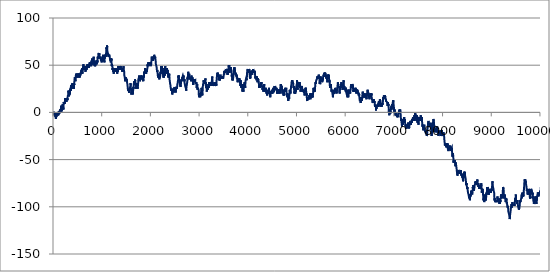
| Category | Series 0 |
|---|---|
| 0.0 | 1 |
| 1.0 | 0 |
| 2.0 | -1 |
| 3.0 | 0 |
| 4.0 | -1 |
| 5.0 | -2 |
| 6.0 | -1 |
| 7.0 | -2 |
| 8.0 | -3 |
| 9.0 | -2 |
| 10.0 | -3 |
| 11.0 | -2 |
| 12.0 | -1 |
| 13.0 | -2 |
| 14.0 | -3 |
| 15.0 | -4 |
| 16.0 | -3 |
| 17.0 | -2 |
| 18.0 | -3 |
| 19.0 | -2 |
| 20.0 | -1 |
| 21.0 | -2 |
| 22.0 | -3 |
| 23.0 | -2 |
| 24.0 | -3 |
| 25.0 | -2 |
| 26.0 | -1 |
| 27.0 | -2 |
| 28.0 | -1 |
| 29.0 | -2 |
| 30.0 | -3 |
| 31.0 | -4 |
| 32.0 | -5 |
| 33.0 | -4 |
| 34.0 | -3 |
| 35.0 | -4 |
| 36.0 | -5 |
| 37.0 | -6 |
| 38.0 | -7 |
| 39.0 | -6 |
| 40.0 | -5 |
| 41.0 | -4 |
| 42.0 | -3 |
| 43.0 | -2 |
| 44.0 | -3 |
| 45.0 | -4 |
| 46.0 | -5 |
| 47.0 | -6 |
| 48.0 | -5 |
| 49.0 | -4 |
| 50.0 | -5 |
| 51.0 | -4 |
| 52.0 | -3 |
| 53.0 | -4 |
| 54.0 | -3 |
| 55.0 | -4 |
| 56.0 | -3 |
| 57.0 | -4 |
| 58.0 | -3 |
| 59.0 | -2 |
| 60.0 | -1 |
| 61.0 | -2 |
| 62.0 | -1 |
| 63.0 | -2 |
| 64.0 | -3 |
| 65.0 | -4 |
| 66.0 | -3 |
| 67.0 | -4 |
| 68.0 | -3 |
| 69.0 | -2 |
| 70.0 | -1 |
| 71.0 | -2 |
| 72.0 | -1 |
| 73.0 | 0 |
| 74.0 | -1 |
| 75.0 | 0 |
| 76.0 | -1 |
| 77.0 | -2 |
| 78.0 | -1 |
| 79.0 | 0 |
| 80.0 | -1 |
| 81.0 | -2 |
| 82.0 | -3 |
| 83.0 | -2 |
| 84.0 | -1 |
| 85.0 | -2 |
| 86.0 | -1 |
| 87.0 | -2 |
| 88.0 | -3 |
| 89.0 | -4 |
| 90.0 | -3 |
| 91.0 | -4 |
| 92.0 | -3 |
| 93.0 | -2 |
| 94.0 | -1 |
| 95.0 | 0 |
| 96.0 | -1 |
| 97.0 | 0 |
| 98.0 | 1 |
| 99.0 | 0 |
| 100.0 | -1 |
| 101.0 | 0 |
| 102.0 | -1 |
| 103.0 | -2 |
| 104.0 | -1 |
| 105.0 | 0 |
| 106.0 | -1 |
| 107.0 | 0 |
| 108.0 | 1 |
| 109.0 | 0 |
| 110.0 | -1 |
| 111.0 | 0 |
| 112.0 | -1 |
| 113.0 | -2 |
| 114.0 | -1 |
| 115.0 | 0 |
| 116.0 | 1 |
| 117.0 | 2 |
| 118.0 | 1 |
| 119.0 | 0 |
| 120.0 | 1 |
| 121.0 | 2 |
| 122.0 | 3 |
| 123.0 | 2 |
| 124.0 | 3 |
| 125.0 | 2 |
| 126.0 | 1 |
| 127.0 | 0 |
| 128.0 | 1 |
| 129.0 | 2 |
| 130.0 | 1 |
| 131.0 | 2 |
| 132.0 | 3 |
| 133.0 | 4 |
| 134.0 | 3 |
| 135.0 | 4 |
| 136.0 | 3 |
| 137.0 | 2 |
| 138.0 | 1 |
| 139.0 | 2 |
| 140.0 | 3 |
| 141.0 | 4 |
| 142.0 | 5 |
| 143.0 | 6 |
| 144.0 | 7 |
| 145.0 | 6 |
| 146.0 | 5 |
| 147.0 | 6 |
| 148.0 | 5 |
| 149.0 | 4 |
| 150.0 | 3 |
| 151.0 | 2 |
| 152.0 | 3 |
| 153.0 | 4 |
| 154.0 | 3 |
| 155.0 | 2 |
| 156.0 | 1 |
| 157.0 | 2 |
| 158.0 | 3 |
| 159.0 | 4 |
| 160.0 | 5 |
| 161.0 | 6 |
| 162.0 | 7 |
| 163.0 | 6 |
| 164.0 | 7 |
| 165.0 | 6 |
| 166.0 | 5 |
| 167.0 | 4 |
| 168.0 | 3 |
| 169.0 | 4 |
| 170.0 | 3 |
| 171.0 | 4 |
| 172.0 | 5 |
| 173.0 | 6 |
| 174.0 | 5 |
| 175.0 | 6 |
| 176.0 | 7 |
| 177.0 | 8 |
| 178.0 | 9 |
| 179.0 | 10 |
| 180.0 | 9 |
| 181.0 | 8 |
| 182.0 | 7 |
| 183.0 | 8 |
| 184.0 | 7 |
| 185.0 | 6 |
| 186.0 | 7 |
| 187.0 | 8 |
| 188.0 | 7 |
| 189.0 | 6 |
| 190.0 | 5 |
| 191.0 | 4 |
| 192.0 | 3 |
| 193.0 | 4 |
| 194.0 | 5 |
| 195.0 | 6 |
| 196.0 | 7 |
| 197.0 | 8 |
| 198.0 | 9 |
| 199.0 | 10 |
| 200.0 | 11 |
| 201.0 | 10 |
| 202.0 | 11 |
| 203.0 | 10 |
| 204.0 | 9 |
| 205.0 | 8 |
| 206.0 | 9 |
| 207.0 | 10 |
| 208.0 | 9 |
| 209.0 | 8 |
| 210.0 | 9 |
| 211.0 | 8 |
| 212.0 | 9 |
| 213.0 | 8 |
| 214.0 | 9 |
| 215.0 | 10 |
| 216.0 | 11 |
| 217.0 | 10 |
| 218.0 | 9 |
| 219.0 | 10 |
| 220.0 | 9 |
| 221.0 | 10 |
| 222.0 | 9 |
| 223.0 | 10 |
| 224.0 | 11 |
| 225.0 | 12 |
| 226.0 | 11 |
| 227.0 | 12 |
| 228.0 | 13 |
| 229.0 | 14 |
| 230.0 | 15 |
| 231.0 | 14 |
| 232.0 | 13 |
| 233.0 | 14 |
| 234.0 | 13 |
| 235.0 | 14 |
| 236.0 | 13 |
| 237.0 | 14 |
| 238.0 | 15 |
| 239.0 | 14 |
| 240.0 | 13 |
| 241.0 | 14 |
| 242.0 | 15 |
| 243.0 | 14 |
| 244.0 | 15 |
| 245.0 | 14 |
| 246.0 | 13 |
| 247.0 | 14 |
| 248.0 | 13 |
| 249.0 | 14 |
| 250.0 | 13 |
| 251.0 | 12 |
| 252.0 | 13 |
| 253.0 | 12 |
| 254.0 | 11 |
| 255.0 | 12 |
| 256.0 | 13 |
| 257.0 | 14 |
| 258.0 | 15 |
| 259.0 | 14 |
| 260.0 | 13 |
| 261.0 | 14 |
| 262.0 | 15 |
| 263.0 | 14 |
| 264.0 | 13 |
| 265.0 | 12 |
| 266.0 | 13 |
| 267.0 | 12 |
| 268.0 | 13 |
| 269.0 | 14 |
| 270.0 | 15 |
| 271.0 | 14 |
| 272.0 | 15 |
| 273.0 | 14 |
| 274.0 | 15 |
| 275.0 | 14 |
| 276.0 | 13 |
| 277.0 | 14 |
| 278.0 | 15 |
| 279.0 | 16 |
| 280.0 | 17 |
| 281.0 | 18 |
| 282.0 | 17 |
| 283.0 | 16 |
| 284.0 | 17 |
| 285.0 | 16 |
| 286.0 | 17 |
| 287.0 | 16 |
| 288.0 | 17 |
| 289.0 | 16 |
| 290.0 | 17 |
| 291.0 | 18 |
| 292.0 | 19 |
| 293.0 | 18 |
| 294.0 | 19 |
| 295.0 | 20 |
| 296.0 | 21 |
| 297.0 | 22 |
| 298.0 | 23 |
| 299.0 | 22 |
| 300.0 | 21 |
| 301.0 | 22 |
| 302.0 | 23 |
| 303.0 | 22 |
| 304.0 | 21 |
| 305.0 | 20 |
| 306.0 | 19 |
| 307.0 | 18 |
| 308.0 | 17 |
| 309.0 | 16 |
| 310.0 | 17 |
| 311.0 | 18 |
| 312.0 | 19 |
| 313.0 | 18 |
| 314.0 | 19 |
| 315.0 | 20 |
| 316.0 | 19 |
| 317.0 | 20 |
| 318.0 | 21 |
| 319.0 | 20 |
| 320.0 | 21 |
| 321.0 | 20 |
| 322.0 | 21 |
| 323.0 | 20 |
| 324.0 | 19 |
| 325.0 | 20 |
| 326.0 | 21 |
| 327.0 | 22 |
| 328.0 | 23 |
| 329.0 | 24 |
| 330.0 | 25 |
| 331.0 | 24 |
| 332.0 | 25 |
| 333.0 | 24 |
| 334.0 | 25 |
| 335.0 | 24 |
| 336.0 | 23 |
| 337.0 | 24 |
| 338.0 | 25 |
| 339.0 | 26 |
| 340.0 | 25 |
| 341.0 | 24 |
| 342.0 | 23 |
| 343.0 | 24 |
| 344.0 | 25 |
| 345.0 | 26 |
| 346.0 | 27 |
| 347.0 | 26 |
| 348.0 | 27 |
| 349.0 | 28 |
| 350.0 | 29 |
| 351.0 | 30 |
| 352.0 | 29 |
| 353.0 | 28 |
| 354.0 | 27 |
| 355.0 | 28 |
| 356.0 | 27 |
| 357.0 | 26 |
| 358.0 | 27 |
| 359.0 | 26 |
| 360.0 | 25 |
| 361.0 | 26 |
| 362.0 | 27 |
| 363.0 | 28 |
| 364.0 | 29 |
| 365.0 | 30 |
| 366.0 | 29 |
| 367.0 | 30 |
| 368.0 | 29 |
| 369.0 | 30 |
| 370.0 | 29 |
| 371.0 | 30 |
| 372.0 | 29 |
| 373.0 | 30 |
| 374.0 | 29 |
| 375.0 | 30 |
| 376.0 | 29 |
| 377.0 | 30 |
| 378.0 | 29 |
| 379.0 | 30 |
| 380.0 | 29 |
| 381.0 | 30 |
| 382.0 | 31 |
| 383.0 | 30 |
| 384.0 | 29 |
| 385.0 | 30 |
| 386.0 | 31 |
| 387.0 | 30 |
| 388.0 | 29 |
| 389.0 | 30 |
| 390.0 | 29 |
| 391.0 | 28 |
| 392.0 | 27 |
| 393.0 | 28 |
| 394.0 | 27 |
| 395.0 | 26 |
| 396.0 | 27 |
| 397.0 | 26 |
| 398.0 | 25 |
| 399.0 | 26 |
| 400.0 | 25 |
| 401.0 | 26 |
| 402.0 | 27 |
| 403.0 | 28 |
| 404.0 | 27 |
| 405.0 | 26 |
| 406.0 | 25 |
| 407.0 | 26 |
| 408.0 | 27 |
| 409.0 | 28 |
| 410.0 | 29 |
| 411.0 | 30 |
| 412.0 | 31 |
| 413.0 | 30 |
| 414.0 | 29 |
| 415.0 | 30 |
| 416.0 | 31 |
| 417.0 | 32 |
| 418.0 | 33 |
| 419.0 | 34 |
| 420.0 | 33 |
| 421.0 | 34 |
| 422.0 | 35 |
| 423.0 | 36 |
| 424.0 | 35 |
| 425.0 | 36 |
| 426.0 | 37 |
| 427.0 | 38 |
| 428.0 | 37 |
| 429.0 | 36 |
| 430.0 | 37 |
| 431.0 | 36 |
| 432.0 | 35 |
| 433.0 | 36 |
| 434.0 | 37 |
| 435.0 | 36 |
| 436.0 | 35 |
| 437.0 | 36 |
| 438.0 | 35 |
| 439.0 | 34 |
| 440.0 | 33 |
| 441.0 | 34 |
| 442.0 | 35 |
| 443.0 | 36 |
| 444.0 | 37 |
| 445.0 | 38 |
| 446.0 | 37 |
| 447.0 | 38 |
| 448.0 | 39 |
| 449.0 | 40 |
| 450.0 | 39 |
| 451.0 | 40 |
| 452.0 | 41 |
| 453.0 | 40 |
| 454.0 | 39 |
| 455.0 | 38 |
| 456.0 | 37 |
| 457.0 | 38 |
| 458.0 | 37 |
| 459.0 | 36 |
| 460.0 | 37 |
| 461.0 | 38 |
| 462.0 | 39 |
| 463.0 | 38 |
| 464.0 | 37 |
| 465.0 | 38 |
| 466.0 | 39 |
| 467.0 | 40 |
| 468.0 | 39 |
| 469.0 | 40 |
| 470.0 | 39 |
| 471.0 | 40 |
| 472.0 | 41 |
| 473.0 | 40 |
| 474.0 | 39 |
| 475.0 | 38 |
| 476.0 | 37 |
| 477.0 | 36 |
| 478.0 | 37 |
| 479.0 | 38 |
| 480.0 | 39 |
| 481.0 | 40 |
| 482.0 | 39 |
| 483.0 | 40 |
| 484.0 | 41 |
| 485.0 | 40 |
| 486.0 | 41 |
| 487.0 | 40 |
| 488.0 | 39 |
| 489.0 | 38 |
| 490.0 | 39 |
| 491.0 | 40 |
| 492.0 | 39 |
| 493.0 | 40 |
| 494.0 | 41 |
| 495.0 | 42 |
| 496.0 | 41 |
| 497.0 | 40 |
| 498.0 | 41 |
| 499.0 | 42 |
| 500.0 | 41 |
| 501.0 | 40 |
| 502.0 | 41 |
| 503.0 | 40 |
| 504.0 | 39 |
| 505.0 | 40 |
| 506.0 | 41 |
| 507.0 | 40 |
| 508.0 | 39 |
| 509.0 | 38 |
| 510.0 | 37 |
| 511.0 | 38 |
| 512.0 | 39 |
| 513.0 | 40 |
| 514.0 | 41 |
| 515.0 | 40 |
| 516.0 | 41 |
| 517.0 | 42 |
| 518.0 | 41 |
| 519.0 | 42 |
| 520.0 | 41 |
| 521.0 | 42 |
| 522.0 | 41 |
| 523.0 | 40 |
| 524.0 | 41 |
| 525.0 | 40 |
| 526.0 | 39 |
| 527.0 | 38 |
| 528.0 | 37 |
| 529.0 | 38 |
| 530.0 | 39 |
| 531.0 | 40 |
| 532.0 | 41 |
| 533.0 | 40 |
| 534.0 | 39 |
| 535.0 | 40 |
| 536.0 | 41 |
| 537.0 | 42 |
| 538.0 | 41 |
| 539.0 | 40 |
| 540.0 | 39 |
| 541.0 | 40 |
| 542.0 | 41 |
| 543.0 | 40 |
| 544.0 | 41 |
| 545.0 | 40 |
| 546.0 | 41 |
| 547.0 | 42 |
| 548.0 | 41 |
| 549.0 | 42 |
| 550.0 | 41 |
| 551.0 | 40 |
| 552.0 | 41 |
| 553.0 | 42 |
| 554.0 | 43 |
| 555.0 | 42 |
| 556.0 | 41 |
| 557.0 | 40 |
| 558.0 | 41 |
| 559.0 | 42 |
| 560.0 | 43 |
| 561.0 | 44 |
| 562.0 | 43 |
| 563.0 | 44 |
| 564.0 | 45 |
| 565.0 | 46 |
| 566.0 | 45 |
| 567.0 | 44 |
| 568.0 | 43 |
| 569.0 | 44 |
| 570.0 | 45 |
| 571.0 | 46 |
| 572.0 | 45 |
| 573.0 | 46 |
| 574.0 | 47 |
| 575.0 | 46 |
| 576.0 | 47 |
| 577.0 | 46 |
| 578.0 | 45 |
| 579.0 | 44 |
| 580.0 | 43 |
| 581.0 | 42 |
| 582.0 | 41 |
| 583.0 | 42 |
| 584.0 | 43 |
| 585.0 | 44 |
| 586.0 | 43 |
| 587.0 | 42 |
| 588.0 | 43 |
| 589.0 | 44 |
| 590.0 | 45 |
| 591.0 | 44 |
| 592.0 | 45 |
| 593.0 | 44 |
| 594.0 | 45 |
| 595.0 | 46 |
| 596.0 | 47 |
| 597.0 | 48 |
| 598.0 | 49 |
| 599.0 | 48 |
| 600.0 | 49 |
| 601.0 | 48 |
| 602.0 | 49 |
| 603.0 | 50 |
| 604.0 | 51 |
| 605.0 | 50 |
| 606.0 | 49 |
| 607.0 | 48 |
| 608.0 | 49 |
| 609.0 | 48 |
| 610.0 | 49 |
| 611.0 | 48 |
| 612.0 | 47 |
| 613.0 | 46 |
| 614.0 | 45 |
| 615.0 | 44 |
| 616.0 | 45 |
| 617.0 | 46 |
| 618.0 | 47 |
| 619.0 | 46 |
| 620.0 | 45 |
| 621.0 | 46 |
| 622.0 | 45 |
| 623.0 | 44 |
| 624.0 | 45 |
| 625.0 | 46 |
| 626.0 | 47 |
| 627.0 | 48 |
| 628.0 | 49 |
| 629.0 | 48 |
| 630.0 | 47 |
| 631.0 | 48 |
| 632.0 | 49 |
| 633.0 | 48 |
| 634.0 | 49 |
| 635.0 | 48 |
| 636.0 | 47 |
| 637.0 | 48 |
| 638.0 | 47 |
| 639.0 | 46 |
| 640.0 | 47 |
| 641.0 | 46 |
| 642.0 | 45 |
| 643.0 | 46 |
| 644.0 | 45 |
| 645.0 | 44 |
| 646.0 | 45 |
| 647.0 | 44 |
| 648.0 | 43 |
| 649.0 | 44 |
| 650.0 | 45 |
| 651.0 | 46 |
| 652.0 | 45 |
| 653.0 | 46 |
| 654.0 | 45 |
| 655.0 | 46 |
| 656.0 | 47 |
| 657.0 | 48 |
| 658.0 | 47 |
| 659.0 | 48 |
| 660.0 | 49 |
| 661.0 | 48 |
| 662.0 | 49 |
| 663.0 | 48 |
| 664.0 | 47 |
| 665.0 | 48 |
| 666.0 | 47 |
| 667.0 | 46 |
| 668.0 | 45 |
| 669.0 | 44 |
| 670.0 | 45 |
| 671.0 | 46 |
| 672.0 | 47 |
| 673.0 | 48 |
| 674.0 | 49 |
| 675.0 | 50 |
| 676.0 | 49 |
| 677.0 | 50 |
| 678.0 | 49 |
| 679.0 | 50 |
| 680.0 | 49 |
| 681.0 | 48 |
| 682.0 | 49 |
| 683.0 | 50 |
| 684.0 | 49 |
| 685.0 | 50 |
| 686.0 | 51 |
| 687.0 | 52 |
| 688.0 | 51 |
| 689.0 | 50 |
| 690.0 | 49 |
| 691.0 | 48 |
| 692.0 | 47 |
| 693.0 | 48 |
| 694.0 | 49 |
| 695.0 | 50 |
| 696.0 | 49 |
| 697.0 | 50 |
| 698.0 | 49 |
| 699.0 | 50 |
| 700.0 | 51 |
| 701.0 | 50 |
| 702.0 | 49 |
| 703.0 | 50 |
| 704.0 | 49 |
| 705.0 | 48 |
| 706.0 | 49 |
| 707.0 | 48 |
| 708.0 | 47 |
| 709.0 | 48 |
| 710.0 | 49 |
| 711.0 | 50 |
| 712.0 | 49 |
| 713.0 | 48 |
| 714.0 | 47 |
| 715.0 | 46 |
| 716.0 | 47 |
| 717.0 | 48 |
| 718.0 | 49 |
| 719.0 | 48 |
| 720.0 | 49 |
| 721.0 | 48 |
| 722.0 | 49 |
| 723.0 | 50 |
| 724.0 | 51 |
| 725.0 | 50 |
| 726.0 | 51 |
| 727.0 | 50 |
| 728.0 | 51 |
| 729.0 | 52 |
| 730.0 | 51 |
| 731.0 | 52 |
| 732.0 | 51 |
| 733.0 | 52 |
| 734.0 | 53 |
| 735.0 | 52 |
| 736.0 | 51 |
| 737.0 | 50 |
| 738.0 | 51 |
| 739.0 | 50 |
| 740.0 | 51 |
| 741.0 | 50 |
| 742.0 | 49 |
| 743.0 | 50 |
| 744.0 | 51 |
| 745.0 | 50 |
| 746.0 | 51 |
| 747.0 | 52 |
| 748.0 | 53 |
| 749.0 | 52 |
| 750.0 | 53 |
| 751.0 | 52 |
| 752.0 | 53 |
| 753.0 | 54 |
| 754.0 | 53 |
| 755.0 | 52 |
| 756.0 | 53 |
| 757.0 | 52 |
| 758.0 | 51 |
| 759.0 | 50 |
| 760.0 | 51 |
| 761.0 | 50 |
| 762.0 | 49 |
| 763.0 | 48 |
| 764.0 | 49 |
| 765.0 | 50 |
| 766.0 | 51 |
| 767.0 | 52 |
| 768.0 | 53 |
| 769.0 | 52 |
| 770.0 | 53 |
| 771.0 | 54 |
| 772.0 | 55 |
| 773.0 | 54 |
| 774.0 | 55 |
| 775.0 | 54 |
| 776.0 | 53 |
| 777.0 | 54 |
| 778.0 | 55 |
| 779.0 | 56 |
| 780.0 | 57 |
| 781.0 | 56 |
| 782.0 | 55 |
| 783.0 | 54 |
| 784.0 | 53 |
| 785.0 | 52 |
| 786.0 | 51 |
| 787.0 | 52 |
| 788.0 | 51 |
| 789.0 | 52 |
| 790.0 | 51 |
| 791.0 | 52 |
| 792.0 | 53 |
| 793.0 | 52 |
| 794.0 | 51 |
| 795.0 | 52 |
| 796.0 | 53 |
| 797.0 | 54 |
| 798.0 | 53 |
| 799.0 | 52 |
| 800.0 | 51 |
| 801.0 | 52 |
| 802.0 | 53 |
| 803.0 | 54 |
| 804.0 | 55 |
| 805.0 | 54 |
| 806.0 | 53 |
| 807.0 | 54 |
| 808.0 | 55 |
| 809.0 | 56 |
| 810.0 | 57 |
| 811.0 | 56 |
| 812.0 | 57 |
| 813.0 | 58 |
| 814.0 | 59 |
| 815.0 | 58 |
| 816.0 | 57 |
| 817.0 | 56 |
| 818.0 | 55 |
| 819.0 | 54 |
| 820.0 | 55 |
| 821.0 | 54 |
| 822.0 | 53 |
| 823.0 | 52 |
| 824.0 | 51 |
| 825.0 | 50 |
| 826.0 | 51 |
| 827.0 | 52 |
| 828.0 | 51 |
| 829.0 | 52 |
| 830.0 | 51 |
| 831.0 | 50 |
| 832.0 | 51 |
| 833.0 | 50 |
| 834.0 | 49 |
| 835.0 | 48 |
| 836.0 | 49 |
| 837.0 | 50 |
| 838.0 | 51 |
| 839.0 | 52 |
| 840.0 | 51 |
| 841.0 | 52 |
| 842.0 | 51 |
| 843.0 | 50 |
| 844.0 | 49 |
| 845.0 | 50 |
| 846.0 | 49 |
| 847.0 | 50 |
| 848.0 | 49 |
| 849.0 | 50 |
| 850.0 | 49 |
| 851.0 | 48 |
| 852.0 | 49 |
| 853.0 | 48 |
| 854.0 | 49 |
| 855.0 | 48 |
| 856.0 | 49 |
| 857.0 | 50 |
| 858.0 | 51 |
| 859.0 | 52 |
| 860.0 | 51 |
| 861.0 | 50 |
| 862.0 | 51 |
| 863.0 | 52 |
| 864.0 | 53 |
| 865.0 | 54 |
| 866.0 | 55 |
| 867.0 | 54 |
| 868.0 | 55 |
| 869.0 | 56 |
| 870.0 | 55 |
| 871.0 | 54 |
| 872.0 | 53 |
| 873.0 | 52 |
| 874.0 | 51 |
| 875.0 | 50 |
| 876.0 | 51 |
| 877.0 | 52 |
| 878.0 | 51 |
| 879.0 | 52 |
| 880.0 | 51 |
| 881.0 | 50 |
| 882.0 | 51 |
| 883.0 | 52 |
| 884.0 | 51 |
| 885.0 | 52 |
| 886.0 | 53 |
| 887.0 | 54 |
| 888.0 | 55 |
| 889.0 | 54 |
| 890.0 | 53 |
| 891.0 | 54 |
| 892.0 | 53 |
| 893.0 | 54 |
| 894.0 | 55 |
| 895.0 | 56 |
| 896.0 | 57 |
| 897.0 | 58 |
| 898.0 | 59 |
| 899.0 | 58 |
| 900.0 | 57 |
| 901.0 | 56 |
| 902.0 | 57 |
| 903.0 | 58 |
| 904.0 | 57 |
| 905.0 | 58 |
| 906.0 | 57 |
| 907.0 | 58 |
| 908.0 | 57 |
| 909.0 | 58 |
| 910.0 | 59 |
| 911.0 | 60 |
| 912.0 | 61 |
| 913.0 | 62 |
| 914.0 | 61 |
| 915.0 | 60 |
| 916.0 | 61 |
| 917.0 | 62 |
| 918.0 | 63 |
| 919.0 | 62 |
| 920.0 | 61 |
| 921.0 | 60 |
| 922.0 | 59 |
| 923.0 | 58 |
| 924.0 | 59 |
| 925.0 | 60 |
| 926.0 | 61 |
| 927.0 | 60 |
| 928.0 | 61 |
| 929.0 | 62 |
| 930.0 | 63 |
| 931.0 | 62 |
| 932.0 | 61 |
| 933.0 | 60 |
| 934.0 | 61 |
| 935.0 | 60 |
| 936.0 | 59 |
| 937.0 | 60 |
| 938.0 | 59 |
| 939.0 | 60 |
| 940.0 | 59 |
| 941.0 | 60 |
| 942.0 | 59 |
| 943.0 | 60 |
| 944.0 | 59 |
| 945.0 | 60 |
| 946.0 | 59 |
| 947.0 | 60 |
| 948.0 | 59 |
| 949.0 | 58 |
| 950.0 | 57 |
| 951.0 | 56 |
| 952.0 | 57 |
| 953.0 | 58 |
| 954.0 | 59 |
| 955.0 | 58 |
| 956.0 | 57 |
| 957.0 | 56 |
| 958.0 | 57 |
| 959.0 | 58 |
| 960.0 | 57 |
| 961.0 | 56 |
| 962.0 | 57 |
| 963.0 | 56 |
| 964.0 | 55 |
| 965.0 | 56 |
| 966.0 | 55 |
| 967.0 | 56 |
| 968.0 | 57 |
| 969.0 | 56 |
| 970.0 | 55 |
| 971.0 | 54 |
| 972.0 | 55 |
| 973.0 | 56 |
| 974.0 | 55 |
| 975.0 | 54 |
| 976.0 | 53 |
| 977.0 | 54 |
| 978.0 | 53 |
| 979.0 | 54 |
| 980.0 | 53 |
| 981.0 | 54 |
| 982.0 | 53 |
| 983.0 | 54 |
| 984.0 | 53 |
| 985.0 | 52 |
| 986.0 | 53 |
| 987.0 | 54 |
| 988.0 | 55 |
| 989.0 | 56 |
| 990.0 | 55 |
| 991.0 | 54 |
| 992.0 | 55 |
| 993.0 | 56 |
| 994.0 | 55 |
| 995.0 | 56 |
| 996.0 | 57 |
| 997.0 | 58 |
| 998.0 | 57 |
| 999.0 | 58 |
| 1000.0 | 59 |
| 1001.0 | 58 |
| 1002.0 | 59 |
| 1003.0 | 58 |
| 1004.0 | 59 |
| 1005.0 | 60 |
| 1006.0 | 59 |
| 1007.0 | 58 |
| 1008.0 | 59 |
| 1009.0 | 60 |
| 1010.0 | 61 |
| 1011.0 | 60 |
| 1012.0 | 59 |
| 1013.0 | 60 |
| 1014.0 | 59 |
| 1015.0 | 58 |
| 1016.0 | 57 |
| 1017.0 | 56 |
| 1018.0 | 57 |
| 1019.0 | 58 |
| 1020.0 | 57 |
| 1021.0 | 56 |
| 1022.0 | 57 |
| 1023.0 | 56 |
| 1024.0 | 57 |
| 1025.0 | 56 |
| 1026.0 | 55 |
| 1027.0 | 56 |
| 1028.0 | 55 |
| 1029.0 | 54 |
| 1030.0 | 55 |
| 1031.0 | 56 |
| 1032.0 | 55 |
| 1033.0 | 54 |
| 1034.0 | 53 |
| 1035.0 | 54 |
| 1036.0 | 55 |
| 1037.0 | 56 |
| 1038.0 | 57 |
| 1039.0 | 58 |
| 1040.0 | 59 |
| 1041.0 | 58 |
| 1042.0 | 57 |
| 1043.0 | 58 |
| 1044.0 | 59 |
| 1045.0 | 60 |
| 1046.0 | 59 |
| 1047.0 | 58 |
| 1048.0 | 59 |
| 1049.0 | 60 |
| 1050.0 | 61 |
| 1051.0 | 60 |
| 1052.0 | 59 |
| 1053.0 | 58 |
| 1054.0 | 59 |
| 1055.0 | 60 |
| 1056.0 | 59 |
| 1057.0 | 60 |
| 1058.0 | 61 |
| 1059.0 | 60 |
| 1060.0 | 59 |
| 1061.0 | 60 |
| 1062.0 | 59 |
| 1063.0 | 60 |
| 1064.0 | 61 |
| 1065.0 | 62 |
| 1066.0 | 61 |
| 1067.0 | 60 |
| 1068.0 | 61 |
| 1069.0 | 62 |
| 1070.0 | 63 |
| 1071.0 | 64 |
| 1072.0 | 65 |
| 1073.0 | 66 |
| 1074.0 | 65 |
| 1075.0 | 66 |
| 1076.0 | 67 |
| 1077.0 | 68 |
| 1078.0 | 69 |
| 1079.0 | 68 |
| 1080.0 | 67 |
| 1081.0 | 66 |
| 1082.0 | 67 |
| 1083.0 | 66 |
| 1084.0 | 67 |
| 1085.0 | 66 |
| 1086.0 | 67 |
| 1087.0 | 68 |
| 1088.0 | 69 |
| 1089.0 | 70 |
| 1090.0 | 71 |
| 1091.0 | 70 |
| 1092.0 | 69 |
| 1093.0 | 68 |
| 1094.0 | 67 |
| 1095.0 | 66 |
| 1096.0 | 65 |
| 1097.0 | 64 |
| 1098.0 | 63 |
| 1099.0 | 62 |
| 1100.0 | 61 |
| 1101.0 | 62 |
| 1102.0 | 63 |
| 1103.0 | 62 |
| 1104.0 | 61 |
| 1105.0 | 62 |
| 1106.0 | 63 |
| 1107.0 | 62 |
| 1108.0 | 63 |
| 1109.0 | 62 |
| 1110.0 | 63 |
| 1111.0 | 62 |
| 1112.0 | 63 |
| 1113.0 | 64 |
| 1114.0 | 63 |
| 1115.0 | 62 |
| 1116.0 | 61 |
| 1117.0 | 60 |
| 1118.0 | 59 |
| 1119.0 | 60 |
| 1120.0 | 59 |
| 1121.0 | 60 |
| 1122.0 | 61 |
| 1123.0 | 62 |
| 1124.0 | 61 |
| 1125.0 | 60 |
| 1126.0 | 59 |
| 1127.0 | 60 |
| 1128.0 | 59 |
| 1129.0 | 58 |
| 1130.0 | 59 |
| 1131.0 | 60 |
| 1132.0 | 61 |
| 1133.0 | 60 |
| 1134.0 | 61 |
| 1135.0 | 60 |
| 1136.0 | 61 |
| 1137.0 | 62 |
| 1138.0 | 61 |
| 1139.0 | 62 |
| 1140.0 | 61 |
| 1141.0 | 60 |
| 1142.0 | 59 |
| 1143.0 | 58 |
| 1144.0 | 59 |
| 1145.0 | 60 |
| 1146.0 | 59 |
| 1147.0 | 58 |
| 1148.0 | 57 |
| 1149.0 | 56 |
| 1150.0 | 57 |
| 1151.0 | 56 |
| 1152.0 | 57 |
| 1153.0 | 58 |
| 1154.0 | 57 |
| 1155.0 | 56 |
| 1156.0 | 55 |
| 1157.0 | 56 |
| 1158.0 | 57 |
| 1159.0 | 58 |
| 1160.0 | 57 |
| 1161.0 | 56 |
| 1162.0 | 55 |
| 1163.0 | 54 |
| 1164.0 | 53 |
| 1165.0 | 52 |
| 1166.0 | 53 |
| 1167.0 | 54 |
| 1168.0 | 53 |
| 1169.0 | 54 |
| 1170.0 | 55 |
| 1171.0 | 56 |
| 1172.0 | 57 |
| 1173.0 | 58 |
| 1174.0 | 57 |
| 1175.0 | 56 |
| 1176.0 | 55 |
| 1177.0 | 56 |
| 1178.0 | 57 |
| 1179.0 | 56 |
| 1180.0 | 55 |
| 1181.0 | 54 |
| 1182.0 | 53 |
| 1183.0 | 52 |
| 1184.0 | 51 |
| 1185.0 | 50 |
| 1186.0 | 49 |
| 1187.0 | 50 |
| 1188.0 | 51 |
| 1189.0 | 50 |
| 1190.0 | 51 |
| 1191.0 | 50 |
| 1192.0 | 51 |
| 1193.0 | 52 |
| 1194.0 | 51 |
| 1195.0 | 50 |
| 1196.0 | 51 |
| 1197.0 | 50 |
| 1198.0 | 49 |
| 1199.0 | 48 |
| 1200.0 | 47 |
| 1201.0 | 46 |
| 1202.0 | 45 |
| 1203.0 | 46 |
| 1204.0 | 47 |
| 1205.0 | 48 |
| 1206.0 | 47 |
| 1207.0 | 48 |
| 1208.0 | 47 |
| 1209.0 | 48 |
| 1210.0 | 47 |
| 1211.0 | 48 |
| 1212.0 | 47 |
| 1213.0 | 46 |
| 1214.0 | 45 |
| 1215.0 | 44 |
| 1216.0 | 43 |
| 1217.0 | 44 |
| 1218.0 | 43 |
| 1219.0 | 44 |
| 1220.0 | 43 |
| 1221.0 | 44 |
| 1222.0 | 45 |
| 1223.0 | 44 |
| 1224.0 | 43 |
| 1225.0 | 42 |
| 1226.0 | 41 |
| 1227.0 | 42 |
| 1228.0 | 43 |
| 1229.0 | 42 |
| 1230.0 | 43 |
| 1231.0 | 44 |
| 1232.0 | 45 |
| 1233.0 | 44 |
| 1234.0 | 43 |
| 1235.0 | 44 |
| 1236.0 | 43 |
| 1237.0 | 44 |
| 1238.0 | 45 |
| 1239.0 | 46 |
| 1240.0 | 45 |
| 1241.0 | 44 |
| 1242.0 | 43 |
| 1243.0 | 44 |
| 1244.0 | 45 |
| 1245.0 | 46 |
| 1246.0 | 47 |
| 1247.0 | 46 |
| 1248.0 | 47 |
| 1249.0 | 46 |
| 1250.0 | 47 |
| 1251.0 | 46 |
| 1252.0 | 45 |
| 1253.0 | 44 |
| 1254.0 | 43 |
| 1255.0 | 44 |
| 1256.0 | 45 |
| 1257.0 | 46 |
| 1258.0 | 45 |
| 1259.0 | 44 |
| 1260.0 | 45 |
| 1261.0 | 46 |
| 1262.0 | 45 |
| 1263.0 | 46 |
| 1264.0 | 45 |
| 1265.0 | 44 |
| 1266.0 | 43 |
| 1267.0 | 44 |
| 1268.0 | 45 |
| 1269.0 | 46 |
| 1270.0 | 47 |
| 1271.0 | 46 |
| 1272.0 | 45 |
| 1273.0 | 44 |
| 1274.0 | 45 |
| 1275.0 | 44 |
| 1276.0 | 43 |
| 1277.0 | 44 |
| 1278.0 | 45 |
| 1279.0 | 46 |
| 1280.0 | 45 |
| 1281.0 | 46 |
| 1282.0 | 47 |
| 1283.0 | 46 |
| 1284.0 | 47 |
| 1285.0 | 46 |
| 1286.0 | 45 |
| 1287.0 | 44 |
| 1288.0 | 45 |
| 1289.0 | 46 |
| 1290.0 | 45 |
| 1291.0 | 46 |
| 1292.0 | 45 |
| 1293.0 | 44 |
| 1294.0 | 43 |
| 1295.0 | 42 |
| 1296.0 | 41 |
| 1297.0 | 40 |
| 1298.0 | 41 |
| 1299.0 | 40 |
| 1300.0 | 41 |
| 1301.0 | 42 |
| 1302.0 | 43 |
| 1303.0 | 44 |
| 1304.0 | 45 |
| 1305.0 | 46 |
| 1306.0 | 45 |
| 1307.0 | 46 |
| 1308.0 | 45 |
| 1309.0 | 46 |
| 1310.0 | 45 |
| 1311.0 | 44 |
| 1312.0 | 43 |
| 1313.0 | 44 |
| 1314.0 | 45 |
| 1315.0 | 46 |
| 1316.0 | 45 |
| 1317.0 | 46 |
| 1318.0 | 47 |
| 1319.0 | 46 |
| 1320.0 | 47 |
| 1321.0 | 48 |
| 1322.0 | 49 |
| 1323.0 | 50 |
| 1324.0 | 49 |
| 1325.0 | 48 |
| 1326.0 | 47 |
| 1327.0 | 48 |
| 1328.0 | 49 |
| 1329.0 | 50 |
| 1330.0 | 49 |
| 1331.0 | 48 |
| 1332.0 | 47 |
| 1333.0 | 46 |
| 1334.0 | 47 |
| 1335.0 | 46 |
| 1336.0 | 45 |
| 1337.0 | 46 |
| 1338.0 | 45 |
| 1339.0 | 46 |
| 1340.0 | 47 |
| 1341.0 | 46 |
| 1342.0 | 45 |
| 1343.0 | 46 |
| 1344.0 | 47 |
| 1345.0 | 46 |
| 1346.0 | 45 |
| 1347.0 | 46 |
| 1348.0 | 45 |
| 1349.0 | 46 |
| 1350.0 | 47 |
| 1351.0 | 48 |
| 1352.0 | 49 |
| 1353.0 | 48 |
| 1354.0 | 49 |
| 1355.0 | 50 |
| 1356.0 | 49 |
| 1357.0 | 48 |
| 1358.0 | 49 |
| 1359.0 | 48 |
| 1360.0 | 49 |
| 1361.0 | 48 |
| 1362.0 | 49 |
| 1363.0 | 48 |
| 1364.0 | 49 |
| 1365.0 | 48 |
| 1366.0 | 47 |
| 1367.0 | 48 |
| 1368.0 | 49 |
| 1369.0 | 48 |
| 1370.0 | 49 |
| 1371.0 | 48 |
| 1372.0 | 47 |
| 1373.0 | 46 |
| 1374.0 | 45 |
| 1375.0 | 44 |
| 1376.0 | 45 |
| 1377.0 | 46 |
| 1378.0 | 45 |
| 1379.0 | 46 |
| 1380.0 | 45 |
| 1381.0 | 44 |
| 1382.0 | 45 |
| 1383.0 | 46 |
| 1384.0 | 45 |
| 1385.0 | 44 |
| 1386.0 | 45 |
| 1387.0 | 46 |
| 1388.0 | 47 |
| 1389.0 | 46 |
| 1390.0 | 45 |
| 1391.0 | 46 |
| 1392.0 | 45 |
| 1393.0 | 46 |
| 1394.0 | 47 |
| 1395.0 | 46 |
| 1396.0 | 45 |
| 1397.0 | 44 |
| 1398.0 | 45 |
| 1399.0 | 46 |
| 1400.0 | 45 |
| 1401.0 | 44 |
| 1402.0 | 45 |
| 1403.0 | 46 |
| 1404.0 | 45 |
| 1405.0 | 44 |
| 1406.0 | 43 |
| 1407.0 | 44 |
| 1408.0 | 45 |
| 1409.0 | 44 |
| 1410.0 | 43 |
| 1411.0 | 42 |
| 1412.0 | 43 |
| 1413.0 | 44 |
| 1414.0 | 43 |
| 1415.0 | 42 |
| 1416.0 | 43 |
| 1417.0 | 44 |
| 1418.0 | 45 |
| 1419.0 | 44 |
| 1420.0 | 45 |
| 1421.0 | 46 |
| 1422.0 | 45 |
| 1423.0 | 46 |
| 1424.0 | 47 |
| 1425.0 | 48 |
| 1426.0 | 49 |
| 1427.0 | 48 |
| 1428.0 | 49 |
| 1429.0 | 48 |
| 1430.0 | 47 |
| 1431.0 | 46 |
| 1432.0 | 45 |
| 1433.0 | 44 |
| 1434.0 | 45 |
| 1435.0 | 44 |
| 1436.0 | 43 |
| 1437.0 | 44 |
| 1438.0 | 45 |
| 1439.0 | 44 |
| 1440.0 | 43 |
| 1441.0 | 42 |
| 1442.0 | 41 |
| 1443.0 | 40 |
| 1444.0 | 39 |
| 1445.0 | 40 |
| 1446.0 | 39 |
| 1447.0 | 40 |
| 1448.0 | 39 |
| 1449.0 | 40 |
| 1450.0 | 39 |
| 1451.0 | 40 |
| 1452.0 | 39 |
| 1453.0 | 38 |
| 1454.0 | 37 |
| 1455.0 | 36 |
| 1456.0 | 35 |
| 1457.0 | 34 |
| 1458.0 | 33 |
| 1459.0 | 34 |
| 1460.0 | 33 |
| 1461.0 | 34 |
| 1462.0 | 35 |
| 1463.0 | 36 |
| 1464.0 | 35 |
| 1465.0 | 36 |
| 1466.0 | 35 |
| 1467.0 | 36 |
| 1468.0 | 35 |
| 1469.0 | 36 |
| 1470.0 | 37 |
| 1471.0 | 36 |
| 1472.0 | 35 |
| 1473.0 | 36 |
| 1474.0 | 35 |
| 1475.0 | 36 |
| 1476.0 | 35 |
| 1477.0 | 34 |
| 1478.0 | 35 |
| 1479.0 | 36 |
| 1480.0 | 37 |
| 1481.0 | 36 |
| 1482.0 | 35 |
| 1483.0 | 36 |
| 1484.0 | 35 |
| 1485.0 | 34 |
| 1486.0 | 33 |
| 1487.0 | 32 |
| 1488.0 | 33 |
| 1489.0 | 32 |
| 1490.0 | 33 |
| 1491.0 | 34 |
| 1492.0 | 33 |
| 1493.0 | 34 |
| 1494.0 | 35 |
| 1495.0 | 36 |
| 1496.0 | 35 |
| 1497.0 | 34 |
| 1498.0 | 33 |
| 1499.0 | 32 |
| 1500.0 | 33 |
| 1501.0 | 32 |
| 1502.0 | 31 |
| 1503.0 | 30 |
| 1504.0 | 31 |
| 1505.0 | 32 |
| 1506.0 | 31 |
| 1507.0 | 32 |
| 1508.0 | 31 |
| 1509.0 | 30 |
| 1510.0 | 29 |
| 1511.0 | 28 |
| 1512.0 | 27 |
| 1513.0 | 26 |
| 1514.0 | 27 |
| 1515.0 | 26 |
| 1516.0 | 25 |
| 1517.0 | 26 |
| 1518.0 | 25 |
| 1519.0 | 24 |
| 1520.0 | 23 |
| 1521.0 | 22 |
| 1522.0 | 23 |
| 1523.0 | 22 |
| 1524.0 | 23 |
| 1525.0 | 24 |
| 1526.0 | 23 |
| 1527.0 | 22 |
| 1528.0 | 23 |
| 1529.0 | 24 |
| 1530.0 | 23 |
| 1531.0 | 24 |
| 1532.0 | 25 |
| 1533.0 | 24 |
| 1534.0 | 25 |
| 1535.0 | 24 |
| 1536.0 | 23 |
| 1537.0 | 22 |
| 1538.0 | 21 |
| 1539.0 | 22 |
| 1540.0 | 23 |
| 1541.0 | 22 |
| 1542.0 | 23 |
| 1543.0 | 22 |
| 1544.0 | 21 |
| 1545.0 | 22 |
| 1546.0 | 21 |
| 1547.0 | 22 |
| 1548.0 | 23 |
| 1549.0 | 24 |
| 1550.0 | 25 |
| 1551.0 | 26 |
| 1552.0 | 25 |
| 1553.0 | 24 |
| 1554.0 | 25 |
| 1555.0 | 24 |
| 1556.0 | 25 |
| 1557.0 | 26 |
| 1558.0 | 25 |
| 1559.0 | 24 |
| 1560.0 | 25 |
| 1561.0 | 24 |
| 1562.0 | 25 |
| 1563.0 | 26 |
| 1564.0 | 25 |
| 1565.0 | 26 |
| 1566.0 | 27 |
| 1567.0 | 28 |
| 1568.0 | 27 |
| 1569.0 | 28 |
| 1570.0 | 29 |
| 1571.0 | 30 |
| 1572.0 | 31 |
| 1573.0 | 30 |
| 1574.0 | 29 |
| 1575.0 | 28 |
| 1576.0 | 27 |
| 1577.0 | 26 |
| 1578.0 | 27 |
| 1579.0 | 26 |
| 1580.0 | 25 |
| 1581.0 | 24 |
| 1582.0 | 25 |
| 1583.0 | 24 |
| 1584.0 | 23 |
| 1585.0 | 22 |
| 1586.0 | 21 |
| 1587.0 | 20 |
| 1588.0 | 19 |
| 1589.0 | 20 |
| 1590.0 | 21 |
| 1591.0 | 20 |
| 1592.0 | 21 |
| 1593.0 | 22 |
| 1594.0 | 21 |
| 1595.0 | 20 |
| 1596.0 | 21 |
| 1597.0 | 20 |
| 1598.0 | 21 |
| 1599.0 | 20 |
| 1600.0 | 21 |
| 1601.0 | 22 |
| 1602.0 | 23 |
| 1603.0 | 24 |
| 1604.0 | 25 |
| 1605.0 | 24 |
| 1606.0 | 23 |
| 1607.0 | 22 |
| 1608.0 | 23 |
| 1609.0 | 24 |
| 1610.0 | 23 |
| 1611.0 | 22 |
| 1612.0 | 23 |
| 1613.0 | 22 |
| 1614.0 | 21 |
| 1615.0 | 20 |
| 1616.0 | 21 |
| 1617.0 | 20 |
| 1618.0 | 19 |
| 1619.0 | 18 |
| 1620.0 | 19 |
| 1621.0 | 20 |
| 1622.0 | 21 |
| 1623.0 | 22 |
| 1624.0 | 23 |
| 1625.0 | 22 |
| 1626.0 | 23 |
| 1627.0 | 24 |
| 1628.0 | 25 |
| 1629.0 | 26 |
| 1630.0 | 27 |
| 1631.0 | 26 |
| 1632.0 | 25 |
| 1633.0 | 26 |
| 1634.0 | 27 |
| 1635.0 | 28 |
| 1636.0 | 27 |
| 1637.0 | 28 |
| 1638.0 | 29 |
| 1639.0 | 30 |
| 1640.0 | 31 |
| 1641.0 | 30 |
| 1642.0 | 31 |
| 1643.0 | 32 |
| 1644.0 | 33 |
| 1645.0 | 34 |
| 1646.0 | 33 |
| 1647.0 | 32 |
| 1648.0 | 31 |
| 1649.0 | 30 |
| 1650.0 | 29 |
| 1651.0 | 30 |
| 1652.0 | 29 |
| 1653.0 | 30 |
| 1654.0 | 29 |
| 1655.0 | 30 |
| 1656.0 | 31 |
| 1657.0 | 30 |
| 1658.0 | 29 |
| 1659.0 | 30 |
| 1660.0 | 31 |
| 1661.0 | 32 |
| 1662.0 | 33 |
| 1663.0 | 34 |
| 1664.0 | 35 |
| 1665.0 | 34 |
| 1666.0 | 35 |
| 1667.0 | 34 |
| 1668.0 | 33 |
| 1669.0 | 34 |
| 1670.0 | 33 |
| 1671.0 | 32 |
| 1672.0 | 33 |
| 1673.0 | 34 |
| 1674.0 | 33 |
| 1675.0 | 32 |
| 1676.0 | 31 |
| 1677.0 | 32 |
| 1678.0 | 31 |
| 1679.0 | 30 |
| 1680.0 | 29 |
| 1681.0 | 28 |
| 1682.0 | 27 |
| 1683.0 | 26 |
| 1684.0 | 25 |
| 1685.0 | 26 |
| 1686.0 | 25 |
| 1687.0 | 26 |
| 1688.0 | 25 |
| 1689.0 | 26 |
| 1690.0 | 27 |
| 1691.0 | 28 |
| 1692.0 | 27 |
| 1693.0 | 28 |
| 1694.0 | 29 |
| 1695.0 | 28 |
| 1696.0 | 29 |
| 1697.0 | 30 |
| 1698.0 | 31 |
| 1699.0 | 30 |
| 1700.0 | 31 |
| 1701.0 | 30 |
| 1702.0 | 29 |
| 1703.0 | 30 |
| 1704.0 | 29 |
| 1705.0 | 30 |
| 1706.0 | 29 |
| 1707.0 | 30 |
| 1708.0 | 31 |
| 1709.0 | 32 |
| 1710.0 | 31 |
| 1711.0 | 30 |
| 1712.0 | 29 |
| 1713.0 | 28 |
| 1714.0 | 27 |
| 1715.0 | 26 |
| 1716.0 | 25 |
| 1717.0 | 26 |
| 1718.0 | 25 |
| 1719.0 | 26 |
| 1720.0 | 27 |
| 1721.0 | 26 |
| 1722.0 | 27 |
| 1723.0 | 28 |
| 1724.0 | 29 |
| 1725.0 | 28 |
| 1726.0 | 29 |
| 1727.0 | 30 |
| 1728.0 | 31 |
| 1729.0 | 32 |
| 1730.0 | 33 |
| 1731.0 | 34 |
| 1732.0 | 35 |
| 1733.0 | 36 |
| 1734.0 | 35 |
| 1735.0 | 36 |
| 1736.0 | 35 |
| 1737.0 | 36 |
| 1738.0 | 35 |
| 1739.0 | 34 |
| 1740.0 | 35 |
| 1741.0 | 34 |
| 1742.0 | 35 |
| 1743.0 | 36 |
| 1744.0 | 37 |
| 1745.0 | 38 |
| 1746.0 | 39 |
| 1747.0 | 38 |
| 1748.0 | 39 |
| 1749.0 | 38 |
| 1750.0 | 37 |
| 1751.0 | 38 |
| 1752.0 | 37 |
| 1753.0 | 38 |
| 1754.0 | 37 |
| 1755.0 | 36 |
| 1756.0 | 35 |
| 1757.0 | 34 |
| 1758.0 | 33 |
| 1759.0 | 34 |
| 1760.0 | 33 |
| 1761.0 | 34 |
| 1762.0 | 33 |
| 1763.0 | 32 |
| 1764.0 | 33 |
| 1765.0 | 32 |
| 1766.0 | 33 |
| 1767.0 | 34 |
| 1768.0 | 33 |
| 1769.0 | 34 |
| 1770.0 | 35 |
| 1771.0 | 34 |
| 1772.0 | 35 |
| 1773.0 | 36 |
| 1774.0 | 35 |
| 1775.0 | 36 |
| 1776.0 | 35 |
| 1777.0 | 36 |
| 1778.0 | 37 |
| 1779.0 | 36 |
| 1780.0 | 37 |
| 1781.0 | 38 |
| 1782.0 | 37 |
| 1783.0 | 38 |
| 1784.0 | 37 |
| 1785.0 | 38 |
| 1786.0 | 39 |
| 1787.0 | 40 |
| 1788.0 | 39 |
| 1789.0 | 40 |
| 1790.0 | 39 |
| 1791.0 | 38 |
| 1792.0 | 37 |
| 1793.0 | 36 |
| 1794.0 | 37 |
| 1795.0 | 38 |
| 1796.0 | 37 |
| 1797.0 | 38 |
| 1798.0 | 39 |
| 1799.0 | 38 |
| 1800.0 | 39 |
| 1801.0 | 38 |
| 1802.0 | 37 |
| 1803.0 | 36 |
| 1804.0 | 37 |
| 1805.0 | 38 |
| 1806.0 | 37 |
| 1807.0 | 36 |
| 1808.0 | 35 |
| 1809.0 | 36 |
| 1810.0 | 35 |
| 1811.0 | 36 |
| 1812.0 | 37 |
| 1813.0 | 38 |
| 1814.0 | 37 |
| 1815.0 | 36 |
| 1816.0 | 35 |
| 1817.0 | 36 |
| 1818.0 | 35 |
| 1819.0 | 36 |
| 1820.0 | 35 |
| 1821.0 | 34 |
| 1822.0 | 35 |
| 1823.0 | 34 |
| 1824.0 | 35 |
| 1825.0 | 36 |
| 1826.0 | 35 |
| 1827.0 | 34 |
| 1828.0 | 35 |
| 1829.0 | 34 |
| 1830.0 | 35 |
| 1831.0 | 34 |
| 1832.0 | 35 |
| 1833.0 | 34 |
| 1834.0 | 33 |
| 1835.0 | 34 |
| 1836.0 | 35 |
| 1837.0 | 36 |
| 1838.0 | 37 |
| 1839.0 | 38 |
| 1840.0 | 39 |
| 1841.0 | 38 |
| 1842.0 | 37 |
| 1843.0 | 36 |
| 1844.0 | 37 |
| 1845.0 | 38 |
| 1846.0 | 39 |
| 1847.0 | 38 |
| 1848.0 | 39 |
| 1849.0 | 40 |
| 1850.0 | 41 |
| 1851.0 | 42 |
| 1852.0 | 43 |
| 1853.0 | 42 |
| 1854.0 | 41 |
| 1855.0 | 42 |
| 1856.0 | 43 |
| 1857.0 | 42 |
| 1858.0 | 43 |
| 1859.0 | 44 |
| 1860.0 | 43 |
| 1861.0 | 42 |
| 1862.0 | 41 |
| 1863.0 | 42 |
| 1864.0 | 43 |
| 1865.0 | 44 |
| 1866.0 | 43 |
| 1867.0 | 44 |
| 1868.0 | 45 |
| 1869.0 | 46 |
| 1870.0 | 45 |
| 1871.0 | 46 |
| 1872.0 | 47 |
| 1873.0 | 46 |
| 1874.0 | 45 |
| 1875.0 | 46 |
| 1876.0 | 45 |
| 1877.0 | 44 |
| 1878.0 | 43 |
| 1879.0 | 42 |
| 1880.0 | 41 |
| 1881.0 | 42 |
| 1882.0 | 43 |
| 1883.0 | 44 |
| 1884.0 | 43 |
| 1885.0 | 42 |
| 1886.0 | 43 |
| 1887.0 | 42 |
| 1888.0 | 43 |
| 1889.0 | 44 |
| 1890.0 | 43 |
| 1891.0 | 42 |
| 1892.0 | 41 |
| 1893.0 | 42 |
| 1894.0 | 43 |
| 1895.0 | 44 |
| 1896.0 | 45 |
| 1897.0 | 44 |
| 1898.0 | 43 |
| 1899.0 | 44 |
| 1900.0 | 45 |
| 1901.0 | 44 |
| 1902.0 | 43 |
| 1903.0 | 42 |
| 1904.0 | 43 |
| 1905.0 | 42 |
| 1906.0 | 43 |
| 1907.0 | 42 |
| 1908.0 | 43 |
| 1909.0 | 44 |
| 1910.0 | 45 |
| 1911.0 | 46 |
| 1912.0 | 45 |
| 1913.0 | 44 |
| 1914.0 | 45 |
| 1915.0 | 44 |
| 1916.0 | 45 |
| 1917.0 | 46 |
| 1918.0 | 47 |
| 1919.0 | 48 |
| 1920.0 | 49 |
| 1921.0 | 50 |
| 1922.0 | 51 |
| 1923.0 | 50 |
| 1924.0 | 49 |
| 1925.0 | 50 |
| 1926.0 | 49 |
| 1927.0 | 48 |
| 1928.0 | 49 |
| 1929.0 | 50 |
| 1930.0 | 51 |
| 1931.0 | 52 |
| 1932.0 | 53 |
| 1933.0 | 54 |
| 1934.0 | 53 |
| 1935.0 | 52 |
| 1936.0 | 53 |
| 1937.0 | 54 |
| 1938.0 | 53 |
| 1939.0 | 52 |
| 1940.0 | 51 |
| 1941.0 | 50 |
| 1942.0 | 49 |
| 1943.0 | 50 |
| 1944.0 | 49 |
| 1945.0 | 50 |
| 1946.0 | 49 |
| 1947.0 | 50 |
| 1948.0 | 49 |
| 1949.0 | 50 |
| 1950.0 | 51 |
| 1951.0 | 52 |
| 1952.0 | 53 |
| 1953.0 | 52 |
| 1954.0 | 53 |
| 1955.0 | 54 |
| 1956.0 | 53 |
| 1957.0 | 54 |
| 1958.0 | 53 |
| 1959.0 | 52 |
| 1960.0 | 53 |
| 1961.0 | 54 |
| 1962.0 | 53 |
| 1963.0 | 52 |
| 1964.0 | 53 |
| 1965.0 | 54 |
| 1966.0 | 53 |
| 1967.0 | 52 |
| 1968.0 | 51 |
| 1969.0 | 52 |
| 1970.0 | 51 |
| 1971.0 | 52 |
| 1972.0 | 53 |
| 1973.0 | 54 |
| 1974.0 | 53 |
| 1975.0 | 54 |
| 1976.0 | 53 |
| 1977.0 | 52 |
| 1978.0 | 51 |
| 1979.0 | 52 |
| 1980.0 | 51 |
| 1981.0 | 50 |
| 1982.0 | 49 |
| 1983.0 | 48 |
| 1984.0 | 49 |
| 1985.0 | 50 |
| 1986.0 | 49 |
| 1987.0 | 48 |
| 1988.0 | 49 |
| 1989.0 | 50 |
| 1990.0 | 49 |
| 1991.0 | 48 |
| 1992.0 | 49 |
| 1993.0 | 48 |
| 1994.0 | 49 |
| 1995.0 | 50 |
| 1996.0 | 51 |
| 1997.0 | 52 |
| 1998.0 | 53 |
| 1999.0 | 54 |
| 2000.0 | 55 |
| 2001.0 | 56 |
| 2002.0 | 57 |
| 2003.0 | 58 |
| 2004.0 | 57 |
| 2005.0 | 58 |
| 2006.0 | 57 |
| 2007.0 | 58 |
| 2008.0 | 59 |
| 2009.0 | 58 |
| 2010.0 | 59 |
| 2011.0 | 58 |
| 2012.0 | 57 |
| 2013.0 | 56 |
| 2014.0 | 57 |
| 2015.0 | 56 |
| 2016.0 | 55 |
| 2017.0 | 56 |
| 2018.0 | 55 |
| 2019.0 | 56 |
| 2020.0 | 55 |
| 2021.0 | 56 |
| 2022.0 | 57 |
| 2023.0 | 58 |
| 2024.0 | 59 |
| 2025.0 | 58 |
| 2026.0 | 57 |
| 2027.0 | 56 |
| 2028.0 | 55 |
| 2029.0 | 56 |
| 2030.0 | 57 |
| 2031.0 | 56 |
| 2032.0 | 55 |
| 2033.0 | 54 |
| 2034.0 | 55 |
| 2035.0 | 56 |
| 2036.0 | 55 |
| 2037.0 | 56 |
| 2038.0 | 55 |
| 2039.0 | 54 |
| 2040.0 | 55 |
| 2041.0 | 56 |
| 2042.0 | 57 |
| 2043.0 | 56 |
| 2044.0 | 57 |
| 2045.0 | 58 |
| 2046.0 | 59 |
| 2047.0 | 58 |
| 2048.0 | 59 |
| 2049.0 | 58 |
| 2050.0 | 57 |
| 2051.0 | 56 |
| 2052.0 | 57 |
| 2053.0 | 56 |
| 2054.0 | 57 |
| 2055.0 | 58 |
| 2056.0 | 59 |
| 2057.0 | 60 |
| 2058.0 | 61 |
| 2059.0 | 60 |
| 2060.0 | 61 |
| 2061.0 | 60 |
| 2062.0 | 59 |
| 2063.0 | 58 |
| 2064.0 | 59 |
| 2065.0 | 58 |
| 2066.0 | 59 |
| 2067.0 | 60 |
| 2068.0 | 59 |
| 2069.0 | 58 |
| 2070.0 | 57 |
| 2071.0 | 58 |
| 2072.0 | 57 |
| 2073.0 | 58 |
| 2074.0 | 57 |
| 2075.0 | 58 |
| 2076.0 | 59 |
| 2077.0 | 58 |
| 2078.0 | 59 |
| 2079.0 | 58 |
| 2080.0 | 57 |
| 2081.0 | 58 |
| 2082.0 | 57 |
| 2083.0 | 58 |
| 2084.0 | 57 |
| 2085.0 | 56 |
| 2086.0 | 55 |
| 2087.0 | 54 |
| 2088.0 | 55 |
| 2089.0 | 54 |
| 2090.0 | 53 |
| 2091.0 | 52 |
| 2092.0 | 51 |
| 2093.0 | 52 |
| 2094.0 | 51 |
| 2095.0 | 50 |
| 2096.0 | 51 |
| 2097.0 | 52 |
| 2098.0 | 51 |
| 2099.0 | 52 |
| 2100.0 | 51 |
| 2101.0 | 50 |
| 2102.0 | 49 |
| 2103.0 | 48 |
| 2104.0 | 49 |
| 2105.0 | 48 |
| 2106.0 | 49 |
| 2107.0 | 48 |
| 2108.0 | 49 |
| 2109.0 | 48 |
| 2110.0 | 47 |
| 2111.0 | 46 |
| 2112.0 | 45 |
| 2113.0 | 46 |
| 2114.0 | 45 |
| 2115.0 | 44 |
| 2116.0 | 43 |
| 2117.0 | 42 |
| 2118.0 | 43 |
| 2119.0 | 44 |
| 2120.0 | 45 |
| 2121.0 | 44 |
| 2122.0 | 45 |
| 2123.0 | 44 |
| 2124.0 | 43 |
| 2125.0 | 42 |
| 2126.0 | 43 |
| 2127.0 | 42 |
| 2128.0 | 41 |
| 2129.0 | 42 |
| 2130.0 | 41 |
| 2131.0 | 40 |
| 2132.0 | 39 |
| 2133.0 | 38 |
| 2134.0 | 39 |
| 2135.0 | 38 |
| 2136.0 | 37 |
| 2137.0 | 38 |
| 2138.0 | 37 |
| 2139.0 | 38 |
| 2140.0 | 39 |
| 2141.0 | 38 |
| 2142.0 | 39 |
| 2143.0 | 40 |
| 2144.0 | 39 |
| 2145.0 | 38 |
| 2146.0 | 39 |
| 2147.0 | 40 |
| 2148.0 | 41 |
| 2149.0 | 42 |
| 2150.0 | 41 |
| 2151.0 | 42 |
| 2152.0 | 41 |
| 2153.0 | 40 |
| 2154.0 | 39 |
| 2155.0 | 38 |
| 2156.0 | 37 |
| 2157.0 | 38 |
| 2158.0 | 37 |
| 2159.0 | 36 |
| 2160.0 | 37 |
| 2161.0 | 36 |
| 2162.0 | 35 |
| 2163.0 | 36 |
| 2164.0 | 35 |
| 2165.0 | 36 |
| 2166.0 | 37 |
| 2167.0 | 38 |
| 2168.0 | 39 |
| 2169.0 | 38 |
| 2170.0 | 37 |
| 2171.0 | 38 |
| 2172.0 | 37 |
| 2173.0 | 36 |
| 2174.0 | 37 |
| 2175.0 | 36 |
| 2176.0 | 37 |
| 2177.0 | 38 |
| 2178.0 | 37 |
| 2179.0 | 36 |
| 2180.0 | 37 |
| 2181.0 | 38 |
| 2182.0 | 39 |
| 2183.0 | 38 |
| 2184.0 | 39 |
| 2185.0 | 40 |
| 2186.0 | 41 |
| 2187.0 | 42 |
| 2188.0 | 43 |
| 2189.0 | 42 |
| 2190.0 | 43 |
| 2191.0 | 42 |
| 2192.0 | 41 |
| 2193.0 | 42 |
| 2194.0 | 43 |
| 2195.0 | 44 |
| 2196.0 | 45 |
| 2197.0 | 46 |
| 2198.0 | 47 |
| 2199.0 | 48 |
| 2200.0 | 49 |
| 2201.0 | 48 |
| 2202.0 | 47 |
| 2203.0 | 48 |
| 2204.0 | 47 |
| 2205.0 | 46 |
| 2206.0 | 47 |
| 2207.0 | 48 |
| 2208.0 | 49 |
| 2209.0 | 48 |
| 2210.0 | 47 |
| 2211.0 | 48 |
| 2212.0 | 49 |
| 2213.0 | 50 |
| 2214.0 | 49 |
| 2215.0 | 50 |
| 2216.0 | 49 |
| 2217.0 | 48 |
| 2218.0 | 47 |
| 2219.0 | 46 |
| 2220.0 | 45 |
| 2221.0 | 44 |
| 2222.0 | 45 |
| 2223.0 | 46 |
| 2224.0 | 45 |
| 2225.0 | 44 |
| 2226.0 | 43 |
| 2227.0 | 44 |
| 2228.0 | 45 |
| 2229.0 | 46 |
| 2230.0 | 47 |
| 2231.0 | 46 |
| 2232.0 | 47 |
| 2233.0 | 48 |
| 2234.0 | 47 |
| 2235.0 | 46 |
| 2236.0 | 45 |
| 2237.0 | 44 |
| 2238.0 | 43 |
| 2239.0 | 42 |
| 2240.0 | 41 |
| 2241.0 | 42 |
| 2242.0 | 41 |
| 2243.0 | 40 |
| 2244.0 | 39 |
| 2245.0 | 40 |
| 2246.0 | 41 |
| 2247.0 | 40 |
| 2248.0 | 39 |
| 2249.0 | 38 |
| 2250.0 | 37 |
| 2251.0 | 38 |
| 2252.0 | 39 |
| 2253.0 | 38 |
| 2254.0 | 37 |
| 2255.0 | 38 |
| 2256.0 | 39 |
| 2257.0 | 40 |
| 2258.0 | 39 |
| 2259.0 | 38 |
| 2260.0 | 39 |
| 2261.0 | 40 |
| 2262.0 | 41 |
| 2263.0 | 40 |
| 2264.0 | 39 |
| 2265.0 | 40 |
| 2266.0 | 41 |
| 2267.0 | 42 |
| 2268.0 | 41 |
| 2269.0 | 40 |
| 2270.0 | 39 |
| 2271.0 | 38 |
| 2272.0 | 39 |
| 2273.0 | 40 |
| 2274.0 | 41 |
| 2275.0 | 42 |
| 2276.0 | 43 |
| 2277.0 | 44 |
| 2278.0 | 45 |
| 2279.0 | 46 |
| 2280.0 | 47 |
| 2281.0 | 46 |
| 2282.0 | 47 |
| 2283.0 | 48 |
| 2284.0 | 49 |
| 2285.0 | 48 |
| 2286.0 | 47 |
| 2287.0 | 46 |
| 2288.0 | 47 |
| 2289.0 | 46 |
| 2290.0 | 45 |
| 2291.0 | 44 |
| 2292.0 | 43 |
| 2293.0 | 44 |
| 2294.0 | 43 |
| 2295.0 | 44 |
| 2296.0 | 43 |
| 2297.0 | 44 |
| 2298.0 | 43 |
| 2299.0 | 44 |
| 2300.0 | 43 |
| 2301.0 | 44 |
| 2302.0 | 43 |
| 2303.0 | 44 |
| 2304.0 | 43 |
| 2305.0 | 44 |
| 2306.0 | 43 |
| 2307.0 | 42 |
| 2308.0 | 41 |
| 2309.0 | 40 |
| 2310.0 | 41 |
| 2311.0 | 42 |
| 2312.0 | 43 |
| 2313.0 | 42 |
| 2314.0 | 43 |
| 2315.0 | 44 |
| 2316.0 | 45 |
| 2317.0 | 46 |
| 2318.0 | 47 |
| 2319.0 | 46 |
| 2320.0 | 45 |
| 2321.0 | 46 |
| 2322.0 | 45 |
| 2323.0 | 46 |
| 2324.0 | 45 |
| 2325.0 | 46 |
| 2326.0 | 45 |
| 2327.0 | 44 |
| 2328.0 | 43 |
| 2329.0 | 42 |
| 2330.0 | 43 |
| 2331.0 | 44 |
| 2332.0 | 45 |
| 2333.0 | 44 |
| 2334.0 | 45 |
| 2335.0 | 46 |
| 2336.0 | 45 |
| 2337.0 | 44 |
| 2338.0 | 43 |
| 2339.0 | 42 |
| 2340.0 | 41 |
| 2341.0 | 42 |
| 2342.0 | 41 |
| 2343.0 | 40 |
| 2344.0 | 39 |
| 2345.0 | 38 |
| 2346.0 | 37 |
| 2347.0 | 38 |
| 2348.0 | 39 |
| 2349.0 | 40 |
| 2350.0 | 41 |
| 2351.0 | 42 |
| 2352.0 | 41 |
| 2353.0 | 40 |
| 2354.0 | 39 |
| 2355.0 | 40 |
| 2356.0 | 39 |
| 2357.0 | 40 |
| 2358.0 | 39 |
| 2359.0 | 38 |
| 2360.0 | 37 |
| 2361.0 | 36 |
| 2362.0 | 37 |
| 2363.0 | 38 |
| 2364.0 | 39 |
| 2365.0 | 40 |
| 2366.0 | 41 |
| 2367.0 | 40 |
| 2368.0 | 39 |
| 2369.0 | 38 |
| 2370.0 | 37 |
| 2371.0 | 36 |
| 2372.0 | 35 |
| 2373.0 | 36 |
| 2374.0 | 35 |
| 2375.0 | 36 |
| 2376.0 | 35 |
| 2377.0 | 34 |
| 2378.0 | 33 |
| 2379.0 | 34 |
| 2380.0 | 33 |
| 2381.0 | 32 |
| 2382.0 | 31 |
| 2383.0 | 30 |
| 2384.0 | 31 |
| 2385.0 | 30 |
| 2386.0 | 31 |
| 2387.0 | 32 |
| 2388.0 | 31 |
| 2389.0 | 30 |
| 2390.0 | 29 |
| 2391.0 | 30 |
| 2392.0 | 29 |
| 2393.0 | 28 |
| 2394.0 | 27 |
| 2395.0 | 26 |
| 2396.0 | 27 |
| 2397.0 | 28 |
| 2398.0 | 27 |
| 2399.0 | 26 |
| 2400.0 | 25 |
| 2401.0 | 24 |
| 2402.0 | 23 |
| 2403.0 | 22 |
| 2404.0 | 23 |
| 2405.0 | 24 |
| 2406.0 | 23 |
| 2407.0 | 24 |
| 2408.0 | 23 |
| 2409.0 | 24 |
| 2410.0 | 23 |
| 2411.0 | 22 |
| 2412.0 | 23 |
| 2413.0 | 22 |
| 2414.0 | 23 |
| 2415.0 | 24 |
| 2416.0 | 25 |
| 2417.0 | 24 |
| 2418.0 | 25 |
| 2419.0 | 24 |
| 2420.0 | 23 |
| 2421.0 | 24 |
| 2422.0 | 23 |
| 2423.0 | 22 |
| 2424.0 | 21 |
| 2425.0 | 20 |
| 2426.0 | 19 |
| 2427.0 | 18 |
| 2428.0 | 19 |
| 2429.0 | 20 |
| 2430.0 | 19 |
| 2431.0 | 20 |
| 2432.0 | 19 |
| 2433.0 | 20 |
| 2434.0 | 21 |
| 2435.0 | 22 |
| 2436.0 | 21 |
| 2437.0 | 22 |
| 2438.0 | 21 |
| 2439.0 | 22 |
| 2440.0 | 23 |
| 2441.0 | 22 |
| 2442.0 | 23 |
| 2443.0 | 24 |
| 2444.0 | 23 |
| 2445.0 | 24 |
| 2446.0 | 25 |
| 2447.0 | 24 |
| 2448.0 | 23 |
| 2449.0 | 22 |
| 2450.0 | 23 |
| 2451.0 | 24 |
| 2452.0 | 25 |
| 2453.0 | 24 |
| 2454.0 | 23 |
| 2455.0 | 22 |
| 2456.0 | 21 |
| 2457.0 | 22 |
| 2458.0 | 21 |
| 2459.0 | 22 |
| 2460.0 | 23 |
| 2461.0 | 22 |
| 2462.0 | 23 |
| 2463.0 | 24 |
| 2464.0 | 23 |
| 2465.0 | 22 |
| 2466.0 | 23 |
| 2467.0 | 22 |
| 2468.0 | 23 |
| 2469.0 | 22 |
| 2470.0 | 23 |
| 2471.0 | 24 |
| 2472.0 | 25 |
| 2473.0 | 26 |
| 2474.0 | 27 |
| 2475.0 | 26 |
| 2476.0 | 25 |
| 2477.0 | 26 |
| 2478.0 | 25 |
| 2479.0 | 24 |
| 2480.0 | 23 |
| 2481.0 | 24 |
| 2482.0 | 25 |
| 2483.0 | 26 |
| 2484.0 | 27 |
| 2485.0 | 28 |
| 2486.0 | 27 |
| 2487.0 | 26 |
| 2488.0 | 25 |
| 2489.0 | 26 |
| 2490.0 | 25 |
| 2491.0 | 26 |
| 2492.0 | 25 |
| 2493.0 | 26 |
| 2494.0 | 25 |
| 2495.0 | 26 |
| 2496.0 | 25 |
| 2497.0 | 24 |
| 2498.0 | 23 |
| 2499.0 | 22 |
| 2500.0 | 21 |
| 2501.0 | 22 |
| 2502.0 | 23 |
| 2503.0 | 24 |
| 2504.0 | 23 |
| 2505.0 | 24 |
| 2506.0 | 25 |
| 2507.0 | 26 |
| 2508.0 | 27 |
| 2509.0 | 28 |
| 2510.0 | 27 |
| 2511.0 | 28 |
| 2512.0 | 27 |
| 2513.0 | 26 |
| 2514.0 | 27 |
| 2515.0 | 26 |
| 2516.0 | 27 |
| 2517.0 | 28 |
| 2518.0 | 27 |
| 2519.0 | 26 |
| 2520.0 | 25 |
| 2521.0 | 24 |
| 2522.0 | 25 |
| 2523.0 | 26 |
| 2524.0 | 25 |
| 2525.0 | 24 |
| 2526.0 | 25 |
| 2527.0 | 26 |
| 2528.0 | 27 |
| 2529.0 | 28 |
| 2530.0 | 29 |
| 2531.0 | 28 |
| 2532.0 | 29 |
| 2533.0 | 30 |
| 2534.0 | 29 |
| 2535.0 | 30 |
| 2536.0 | 29 |
| 2537.0 | 30 |
| 2538.0 | 31 |
| 2539.0 | 32 |
| 2540.0 | 31 |
| 2541.0 | 30 |
| 2542.0 | 31 |
| 2543.0 | 32 |
| 2544.0 | 33 |
| 2545.0 | 34 |
| 2546.0 | 33 |
| 2547.0 | 32 |
| 2548.0 | 33 |
| 2549.0 | 34 |
| 2550.0 | 35 |
| 2551.0 | 36 |
| 2552.0 | 37 |
| 2553.0 | 36 |
| 2554.0 | 37 |
| 2555.0 | 38 |
| 2556.0 | 39 |
| 2557.0 | 38 |
| 2558.0 | 37 |
| 2559.0 | 38 |
| 2560.0 | 39 |
| 2561.0 | 40 |
| 2562.0 | 39 |
| 2563.0 | 38 |
| 2564.0 | 37 |
| 2565.0 | 36 |
| 2566.0 | 37 |
| 2567.0 | 36 |
| 2568.0 | 35 |
| 2569.0 | 34 |
| 2570.0 | 35 |
| 2571.0 | 34 |
| 2572.0 | 35 |
| 2573.0 | 34 |
| 2574.0 | 35 |
| 2575.0 | 34 |
| 2576.0 | 33 |
| 2577.0 | 34 |
| 2578.0 | 33 |
| 2579.0 | 32 |
| 2580.0 | 31 |
| 2581.0 | 30 |
| 2582.0 | 31 |
| 2583.0 | 32 |
| 2584.0 | 31 |
| 2585.0 | 30 |
| 2586.0 | 29 |
| 2587.0 | 28 |
| 2588.0 | 29 |
| 2589.0 | 28 |
| 2590.0 | 29 |
| 2591.0 | 28 |
| 2592.0 | 29 |
| 2593.0 | 30 |
| 2594.0 | 29 |
| 2595.0 | 30 |
| 2596.0 | 29 |
| 2597.0 | 28 |
| 2598.0 | 27 |
| 2599.0 | 26 |
| 2600.0 | 27 |
| 2601.0 | 28 |
| 2602.0 | 27 |
| 2603.0 | 28 |
| 2604.0 | 29 |
| 2605.0 | 28 |
| 2606.0 | 29 |
| 2607.0 | 30 |
| 2608.0 | 31 |
| 2609.0 | 32 |
| 2610.0 | 33 |
| 2611.0 | 32 |
| 2612.0 | 33 |
| 2613.0 | 34 |
| 2614.0 | 33 |
| 2615.0 | 34 |
| 2616.0 | 35 |
| 2617.0 | 34 |
| 2618.0 | 33 |
| 2619.0 | 32 |
| 2620.0 | 33 |
| 2621.0 | 34 |
| 2622.0 | 33 |
| 2623.0 | 32 |
| 2624.0 | 33 |
| 2625.0 | 34 |
| 2626.0 | 35 |
| 2627.0 | 36 |
| 2628.0 | 37 |
| 2629.0 | 36 |
| 2630.0 | 35 |
| 2631.0 | 34 |
| 2632.0 | 35 |
| 2633.0 | 36 |
| 2634.0 | 37 |
| 2635.0 | 38 |
| 2636.0 | 37 |
| 2637.0 | 36 |
| 2638.0 | 37 |
| 2639.0 | 38 |
| 2640.0 | 37 |
| 2641.0 | 36 |
| 2642.0 | 37 |
| 2643.0 | 36 |
| 2644.0 | 37 |
| 2645.0 | 38 |
| 2646.0 | 39 |
| 2647.0 | 38 |
| 2648.0 | 39 |
| 2649.0 | 40 |
| 2650.0 | 39 |
| 2651.0 | 40 |
| 2652.0 | 39 |
| 2653.0 | 38 |
| 2654.0 | 39 |
| 2655.0 | 38 |
| 2656.0 | 37 |
| 2657.0 | 38 |
| 2658.0 | 39 |
| 2659.0 | 40 |
| 2660.0 | 39 |
| 2661.0 | 38 |
| 2662.0 | 39 |
| 2663.0 | 38 |
| 2664.0 | 37 |
| 2665.0 | 38 |
| 2666.0 | 37 |
| 2667.0 | 36 |
| 2668.0 | 35 |
| 2669.0 | 36 |
| 2670.0 | 35 |
| 2671.0 | 36 |
| 2672.0 | 35 |
| 2673.0 | 34 |
| 2674.0 | 33 |
| 2675.0 | 34 |
| 2676.0 | 33 |
| 2677.0 | 34 |
| 2678.0 | 35 |
| 2679.0 | 34 |
| 2680.0 | 33 |
| 2681.0 | 32 |
| 2682.0 | 31 |
| 2683.0 | 30 |
| 2684.0 | 31 |
| 2685.0 | 30 |
| 2686.0 | 31 |
| 2687.0 | 30 |
| 2688.0 | 31 |
| 2689.0 | 30 |
| 2690.0 | 29 |
| 2691.0 | 30 |
| 2692.0 | 29 |
| 2693.0 | 30 |
| 2694.0 | 29 |
| 2695.0 | 30 |
| 2696.0 | 29 |
| 2697.0 | 28 |
| 2698.0 | 27 |
| 2699.0 | 28 |
| 2700.0 | 27 |
| 2701.0 | 26 |
| 2702.0 | 27 |
| 2703.0 | 28 |
| 2704.0 | 27 |
| 2705.0 | 28 |
| 2706.0 | 27 |
| 2707.0 | 28 |
| 2708.0 | 27 |
| 2709.0 | 26 |
| 2710.0 | 25 |
| 2711.0 | 26 |
| 2712.0 | 25 |
| 2713.0 | 24 |
| 2714.0 | 23 |
| 2715.0 | 24 |
| 2716.0 | 25 |
| 2717.0 | 24 |
| 2718.0 | 25 |
| 2719.0 | 26 |
| 2720.0 | 27 |
| 2721.0 | 28 |
| 2722.0 | 27 |
| 2723.0 | 26 |
| 2724.0 | 27 |
| 2725.0 | 28 |
| 2726.0 | 29 |
| 2727.0 | 28 |
| 2728.0 | 29 |
| 2729.0 | 30 |
| 2730.0 | 29 |
| 2731.0 | 30 |
| 2732.0 | 31 |
| 2733.0 | 32 |
| 2734.0 | 31 |
| 2735.0 | 32 |
| 2736.0 | 31 |
| 2737.0 | 32 |
| 2738.0 | 33 |
| 2739.0 | 34 |
| 2740.0 | 35 |
| 2741.0 | 36 |
| 2742.0 | 37 |
| 2743.0 | 36 |
| 2744.0 | 35 |
| 2745.0 | 36 |
| 2746.0 | 37 |
| 2747.0 | 38 |
| 2748.0 | 37 |
| 2749.0 | 38 |
| 2750.0 | 39 |
| 2751.0 | 38 |
| 2752.0 | 39 |
| 2753.0 | 40 |
| 2754.0 | 41 |
| 2755.0 | 42 |
| 2756.0 | 43 |
| 2757.0 | 42 |
| 2758.0 | 43 |
| 2759.0 | 42 |
| 2760.0 | 41 |
| 2761.0 | 40 |
| 2762.0 | 41 |
| 2763.0 | 42 |
| 2764.0 | 41 |
| 2765.0 | 40 |
| 2766.0 | 41 |
| 2767.0 | 40 |
| 2768.0 | 39 |
| 2769.0 | 38 |
| 2770.0 | 37 |
| 2771.0 | 38 |
| 2772.0 | 39 |
| 2773.0 | 40 |
| 2774.0 | 39 |
| 2775.0 | 40 |
| 2776.0 | 39 |
| 2777.0 | 40 |
| 2778.0 | 41 |
| 2779.0 | 40 |
| 2780.0 | 39 |
| 2781.0 | 40 |
| 2782.0 | 39 |
| 2783.0 | 38 |
| 2784.0 | 37 |
| 2785.0 | 36 |
| 2786.0 | 37 |
| 2787.0 | 36 |
| 2788.0 | 37 |
| 2789.0 | 36 |
| 2790.0 | 35 |
| 2791.0 | 34 |
| 2792.0 | 35 |
| 2793.0 | 36 |
| 2794.0 | 35 |
| 2795.0 | 36 |
| 2796.0 | 35 |
| 2797.0 | 36 |
| 2798.0 | 35 |
| 2799.0 | 36 |
| 2800.0 | 37 |
| 2801.0 | 36 |
| 2802.0 | 35 |
| 2803.0 | 34 |
| 2804.0 | 35 |
| 2805.0 | 36 |
| 2806.0 | 37 |
| 2807.0 | 36 |
| 2808.0 | 37 |
| 2809.0 | 36 |
| 2810.0 | 37 |
| 2811.0 | 36 |
| 2812.0 | 35 |
| 2813.0 | 34 |
| 2814.0 | 33 |
| 2815.0 | 34 |
| 2816.0 | 33 |
| 2817.0 | 34 |
| 2818.0 | 35 |
| 2819.0 | 36 |
| 2820.0 | 37 |
| 2821.0 | 38 |
| 2822.0 | 39 |
| 2823.0 | 38 |
| 2824.0 | 39 |
| 2825.0 | 40 |
| 2826.0 | 39 |
| 2827.0 | 38 |
| 2828.0 | 37 |
| 2829.0 | 36 |
| 2830.0 | 37 |
| 2831.0 | 36 |
| 2832.0 | 37 |
| 2833.0 | 38 |
| 2834.0 | 37 |
| 2835.0 | 36 |
| 2836.0 | 37 |
| 2837.0 | 36 |
| 2838.0 | 35 |
| 2839.0 | 36 |
| 2840.0 | 35 |
| 2841.0 | 36 |
| 2842.0 | 37 |
| 2843.0 | 36 |
| 2844.0 | 35 |
| 2845.0 | 34 |
| 2846.0 | 35 |
| 2847.0 | 34 |
| 2848.0 | 35 |
| 2849.0 | 34 |
| 2850.0 | 33 |
| 2851.0 | 32 |
| 2852.0 | 33 |
| 2853.0 | 32 |
| 2854.0 | 31 |
| 2855.0 | 32 |
| 2856.0 | 31 |
| 2857.0 | 30 |
| 2858.0 | 29 |
| 2859.0 | 30 |
| 2860.0 | 31 |
| 2861.0 | 30 |
| 2862.0 | 31 |
| 2863.0 | 32 |
| 2864.0 | 33 |
| 2865.0 | 32 |
| 2866.0 | 33 |
| 2867.0 | 34 |
| 2868.0 | 33 |
| 2869.0 | 34 |
| 2870.0 | 35 |
| 2871.0 | 34 |
| 2872.0 | 33 |
| 2873.0 | 34 |
| 2874.0 | 33 |
| 2875.0 | 34 |
| 2876.0 | 35 |
| 2877.0 | 34 |
| 2878.0 | 35 |
| 2879.0 | 34 |
| 2880.0 | 33 |
| 2881.0 | 34 |
| 2882.0 | 33 |
| 2883.0 | 34 |
| 2884.0 | 33 |
| 2885.0 | 34 |
| 2886.0 | 33 |
| 2887.0 | 32 |
| 2888.0 | 33 |
| 2889.0 | 32 |
| 2890.0 | 33 |
| 2891.0 | 32 |
| 2892.0 | 33 |
| 2893.0 | 34 |
| 2894.0 | 33 |
| 2895.0 | 34 |
| 2896.0 | 33 |
| 2897.0 | 34 |
| 2898.0 | 33 |
| 2899.0 | 34 |
| 2900.0 | 33 |
| 2901.0 | 34 |
| 2902.0 | 33 |
| 2903.0 | 32 |
| 2904.0 | 33 |
| 2905.0 | 32 |
| 2906.0 | 33 |
| 2907.0 | 32 |
| 2908.0 | 31 |
| 2909.0 | 30 |
| 2910.0 | 29 |
| 2911.0 | 30 |
| 2912.0 | 31 |
| 2913.0 | 30 |
| 2914.0 | 29 |
| 2915.0 | 30 |
| 2916.0 | 29 |
| 2917.0 | 30 |
| 2918.0 | 31 |
| 2919.0 | 30 |
| 2920.0 | 29 |
| 2921.0 | 30 |
| 2922.0 | 31 |
| 2923.0 | 32 |
| 2924.0 | 31 |
| 2925.0 | 30 |
| 2926.0 | 29 |
| 2927.0 | 28 |
| 2928.0 | 27 |
| 2929.0 | 26 |
| 2930.0 | 27 |
| 2931.0 | 26 |
| 2932.0 | 25 |
| 2933.0 | 26 |
| 2934.0 | 25 |
| 2935.0 | 26 |
| 2936.0 | 27 |
| 2937.0 | 28 |
| 2938.0 | 29 |
| 2939.0 | 30 |
| 2940.0 | 29 |
| 2941.0 | 28 |
| 2942.0 | 27 |
| 2943.0 | 26 |
| 2944.0 | 25 |
| 2945.0 | 24 |
| 2946.0 | 23 |
| 2947.0 | 24 |
| 2948.0 | 25 |
| 2949.0 | 24 |
| 2950.0 | 25 |
| 2951.0 | 26 |
| 2952.0 | 27 |
| 2953.0 | 26 |
| 2954.0 | 27 |
| 2955.0 | 26 |
| 2956.0 | 27 |
| 2957.0 | 26 |
| 2958.0 | 25 |
| 2959.0 | 26 |
| 2960.0 | 25 |
| 2961.0 | 26 |
| 2962.0 | 25 |
| 2963.0 | 26 |
| 2964.0 | 25 |
| 2965.0 | 26 |
| 2966.0 | 25 |
| 2967.0 | 26 |
| 2968.0 | 25 |
| 2969.0 | 24 |
| 2970.0 | 23 |
| 2971.0 | 22 |
| 2972.0 | 21 |
| 2973.0 | 20 |
| 2974.0 | 19 |
| 2975.0 | 18 |
| 2976.0 | 19 |
| 2977.0 | 20 |
| 2978.0 | 19 |
| 2979.0 | 18 |
| 2980.0 | 17 |
| 2981.0 | 18 |
| 2982.0 | 17 |
| 2983.0 | 16 |
| 2984.0 | 17 |
| 2985.0 | 18 |
| 2986.0 | 19 |
| 2987.0 | 20 |
| 2988.0 | 21 |
| 2989.0 | 20 |
| 2990.0 | 19 |
| 2991.0 | 20 |
| 2992.0 | 19 |
| 2993.0 | 18 |
| 2994.0 | 19 |
| 2995.0 | 18 |
| 2996.0 | 19 |
| 2997.0 | 20 |
| 2998.0 | 21 |
| 2999.0 | 20 |
| 3000.0 | 19 |
| 3001.0 | 18 |
| 3002.0 | 17 |
| 3003.0 | 16 |
| 3004.0 | 17 |
| 3005.0 | 18 |
| 3006.0 | 17 |
| 3007.0 | 18 |
| 3008.0 | 19 |
| 3009.0 | 18 |
| 3010.0 | 17 |
| 3011.0 | 18 |
| 3012.0 | 19 |
| 3013.0 | 18 |
| 3014.0 | 19 |
| 3015.0 | 20 |
| 3016.0 | 19 |
| 3017.0 | 18 |
| 3018.0 | 19 |
| 3019.0 | 20 |
| 3020.0 | 21 |
| 3021.0 | 22 |
| 3022.0 | 23 |
| 3023.0 | 22 |
| 3024.0 | 23 |
| 3025.0 | 22 |
| 3026.0 | 23 |
| 3027.0 | 24 |
| 3028.0 | 25 |
| 3029.0 | 26 |
| 3030.0 | 25 |
| 3031.0 | 24 |
| 3032.0 | 23 |
| 3033.0 | 24 |
| 3034.0 | 23 |
| 3035.0 | 22 |
| 3036.0 | 21 |
| 3037.0 | 20 |
| 3038.0 | 21 |
| 3039.0 | 20 |
| 3040.0 | 19 |
| 3041.0 | 20 |
| 3042.0 | 21 |
| 3043.0 | 20 |
| 3044.0 | 19 |
| 3045.0 | 18 |
| 3046.0 | 17 |
| 3047.0 | 18 |
| 3048.0 | 19 |
| 3049.0 | 20 |
| 3050.0 | 21 |
| 3051.0 | 22 |
| 3052.0 | 23 |
| 3053.0 | 24 |
| 3054.0 | 25 |
| 3055.0 | 26 |
| 3056.0 | 27 |
| 3057.0 | 28 |
| 3058.0 | 29 |
| 3059.0 | 30 |
| 3060.0 | 29 |
| 3061.0 | 28 |
| 3062.0 | 27 |
| 3063.0 | 28 |
| 3064.0 | 29 |
| 3065.0 | 30 |
| 3066.0 | 31 |
| 3067.0 | 30 |
| 3068.0 | 31 |
| 3069.0 | 32 |
| 3070.0 | 33 |
| 3071.0 | 34 |
| 3072.0 | 33 |
| 3073.0 | 34 |
| 3074.0 | 35 |
| 3075.0 | 34 |
| 3076.0 | 33 |
| 3077.0 | 32 |
| 3078.0 | 33 |
| 3079.0 | 32 |
| 3080.0 | 33 |
| 3081.0 | 34 |
| 3082.0 | 33 |
| 3083.0 | 32 |
| 3084.0 | 33 |
| 3085.0 | 32 |
| 3086.0 | 31 |
| 3087.0 | 30 |
| 3088.0 | 31 |
| 3089.0 | 32 |
| 3090.0 | 31 |
| 3091.0 | 30 |
| 3092.0 | 29 |
| 3093.0 | 30 |
| 3094.0 | 31 |
| 3095.0 | 32 |
| 3096.0 | 31 |
| 3097.0 | 32 |
| 3098.0 | 31 |
| 3099.0 | 32 |
| 3100.0 | 33 |
| 3101.0 | 34 |
| 3102.0 | 35 |
| 3103.0 | 34 |
| 3104.0 | 35 |
| 3105.0 | 34 |
| 3106.0 | 35 |
| 3107.0 | 34 |
| 3108.0 | 35 |
| 3109.0 | 36 |
| 3110.0 | 35 |
| 3111.0 | 34 |
| 3112.0 | 33 |
| 3113.0 | 32 |
| 3114.0 | 31 |
| 3115.0 | 30 |
| 3116.0 | 31 |
| 3117.0 | 32 |
| 3118.0 | 31 |
| 3119.0 | 32 |
| 3120.0 | 31 |
| 3121.0 | 30 |
| 3122.0 | 29 |
| 3123.0 | 28 |
| 3124.0 | 27 |
| 3125.0 | 26 |
| 3126.0 | 27 |
| 3127.0 | 26 |
| 3128.0 | 27 |
| 3129.0 | 28 |
| 3130.0 | 27 |
| 3131.0 | 26 |
| 3132.0 | 27 |
| 3133.0 | 26 |
| 3134.0 | 25 |
| 3135.0 | 24 |
| 3136.0 | 23 |
| 3137.0 | 22 |
| 3138.0 | 21 |
| 3139.0 | 22 |
| 3140.0 | 23 |
| 3141.0 | 24 |
| 3142.0 | 25 |
| 3143.0 | 24 |
| 3144.0 | 25 |
| 3145.0 | 24 |
| 3146.0 | 25 |
| 3147.0 | 26 |
| 3148.0 | 25 |
| 3149.0 | 26 |
| 3150.0 | 25 |
| 3151.0 | 26 |
| 3152.0 | 27 |
| 3153.0 | 26 |
| 3154.0 | 25 |
| 3155.0 | 24 |
| 3156.0 | 25 |
| 3157.0 | 26 |
| 3158.0 | 27 |
| 3159.0 | 28 |
| 3160.0 | 27 |
| 3161.0 | 26 |
| 3162.0 | 25 |
| 3163.0 | 26 |
| 3164.0 | 27 |
| 3165.0 | 28 |
| 3166.0 | 29 |
| 3167.0 | 28 |
| 3168.0 | 29 |
| 3169.0 | 30 |
| 3170.0 | 29 |
| 3171.0 | 28 |
| 3172.0 | 27 |
| 3173.0 | 26 |
| 3174.0 | 27 |
| 3175.0 | 28 |
| 3176.0 | 27 |
| 3177.0 | 28 |
| 3178.0 | 27 |
| 3179.0 | 26 |
| 3180.0 | 27 |
| 3181.0 | 28 |
| 3182.0 | 27 |
| 3183.0 | 28 |
| 3184.0 | 29 |
| 3185.0 | 30 |
| 3186.0 | 31 |
| 3187.0 | 32 |
| 3188.0 | 31 |
| 3189.0 | 30 |
| 3190.0 | 31 |
| 3191.0 | 32 |
| 3192.0 | 31 |
| 3193.0 | 30 |
| 3194.0 | 29 |
| 3195.0 | 28 |
| 3196.0 | 29 |
| 3197.0 | 30 |
| 3198.0 | 29 |
| 3199.0 | 28 |
| 3200.0 | 27 |
| 3201.0 | 28 |
| 3202.0 | 29 |
| 3203.0 | 30 |
| 3204.0 | 31 |
| 3205.0 | 32 |
| 3206.0 | 31 |
| 3207.0 | 30 |
| 3208.0 | 29 |
| 3209.0 | 30 |
| 3210.0 | 29 |
| 3211.0 | 30 |
| 3212.0 | 31 |
| 3213.0 | 30 |
| 3214.0 | 29 |
| 3215.0 | 30 |
| 3216.0 | 29 |
| 3217.0 | 30 |
| 3218.0 | 29 |
| 3219.0 | 28 |
| 3220.0 | 27 |
| 3221.0 | 28 |
| 3222.0 | 29 |
| 3223.0 | 30 |
| 3224.0 | 31 |
| 3225.0 | 32 |
| 3226.0 | 33 |
| 3227.0 | 32 |
| 3228.0 | 31 |
| 3229.0 | 30 |
| 3230.0 | 29 |
| 3231.0 | 28 |
| 3232.0 | 29 |
| 3233.0 | 30 |
| 3234.0 | 31 |
| 3235.0 | 30 |
| 3236.0 | 31 |
| 3237.0 | 30 |
| 3238.0 | 31 |
| 3239.0 | 32 |
| 3240.0 | 31 |
| 3241.0 | 32 |
| 3242.0 | 33 |
| 3243.0 | 34 |
| 3244.0 | 33 |
| 3245.0 | 34 |
| 3246.0 | 35 |
| 3247.0 | 36 |
| 3248.0 | 37 |
| 3249.0 | 38 |
| 3250.0 | 37 |
| 3251.0 | 36 |
| 3252.0 | 35 |
| 3253.0 | 34 |
| 3254.0 | 33 |
| 3255.0 | 32 |
| 3256.0 | 31 |
| 3257.0 | 32 |
| 3258.0 | 31 |
| 3259.0 | 30 |
| 3260.0 | 29 |
| 3261.0 | 30 |
| 3262.0 | 29 |
| 3263.0 | 30 |
| 3264.0 | 29 |
| 3265.0 | 28 |
| 3266.0 | 29 |
| 3267.0 | 28 |
| 3268.0 | 27 |
| 3269.0 | 28 |
| 3270.0 | 27 |
| 3271.0 | 28 |
| 3272.0 | 27 |
| 3273.0 | 28 |
| 3274.0 | 29 |
| 3275.0 | 30 |
| 3276.0 | 31 |
| 3277.0 | 30 |
| 3278.0 | 31 |
| 3279.0 | 30 |
| 3280.0 | 29 |
| 3281.0 | 28 |
| 3282.0 | 29 |
| 3283.0 | 28 |
| 3284.0 | 29 |
| 3285.0 | 30 |
| 3286.0 | 29 |
| 3287.0 | 28 |
| 3288.0 | 29 |
| 3289.0 | 30 |
| 3290.0 | 31 |
| 3291.0 | 32 |
| 3292.0 | 31 |
| 3293.0 | 30 |
| 3294.0 | 29 |
| 3295.0 | 28 |
| 3296.0 | 29 |
| 3297.0 | 28 |
| 3298.0 | 29 |
| 3299.0 | 28 |
| 3300.0 | 27 |
| 3301.0 | 28 |
| 3302.0 | 29 |
| 3303.0 | 28 |
| 3304.0 | 27 |
| 3305.0 | 28 |
| 3306.0 | 27 |
| 3307.0 | 28 |
| 3308.0 | 29 |
| 3309.0 | 30 |
| 3310.0 | 29 |
| 3311.0 | 28 |
| 3312.0 | 29 |
| 3313.0 | 30 |
| 3314.0 | 31 |
| 3315.0 | 32 |
| 3316.0 | 33 |
| 3317.0 | 32 |
| 3318.0 | 31 |
| 3319.0 | 32 |
| 3320.0 | 33 |
| 3321.0 | 32 |
| 3322.0 | 33 |
| 3323.0 | 32 |
| 3324.0 | 31 |
| 3325.0 | 32 |
| 3326.0 | 31 |
| 3327.0 | 30 |
| 3328.0 | 29 |
| 3329.0 | 30 |
| 3330.0 | 29 |
| 3331.0 | 30 |
| 3332.0 | 29 |
| 3333.0 | 28 |
| 3334.0 | 29 |
| 3335.0 | 30 |
| 3336.0 | 31 |
| 3337.0 | 32 |
| 3338.0 | 33 |
| 3339.0 | 34 |
| 3340.0 | 35 |
| 3341.0 | 36 |
| 3342.0 | 37 |
| 3343.0 | 36 |
| 3344.0 | 37 |
| 3345.0 | 38 |
| 3346.0 | 37 |
| 3347.0 | 38 |
| 3348.0 | 39 |
| 3349.0 | 38 |
| 3350.0 | 39 |
| 3351.0 | 40 |
| 3352.0 | 41 |
| 3353.0 | 40 |
| 3354.0 | 41 |
| 3355.0 | 42 |
| 3356.0 | 41 |
| 3357.0 | 42 |
| 3358.0 | 41 |
| 3359.0 | 40 |
| 3360.0 | 39 |
| 3361.0 | 38 |
| 3362.0 | 39 |
| 3363.0 | 40 |
| 3364.0 | 41 |
| 3365.0 | 42 |
| 3366.0 | 43 |
| 3367.0 | 42 |
| 3368.0 | 41 |
| 3369.0 | 40 |
| 3370.0 | 41 |
| 3371.0 | 40 |
| 3372.0 | 41 |
| 3373.0 | 40 |
| 3374.0 | 39 |
| 3375.0 | 38 |
| 3376.0 | 39 |
| 3377.0 | 40 |
| 3378.0 | 39 |
| 3379.0 | 38 |
| 3380.0 | 39 |
| 3381.0 | 38 |
| 3382.0 | 37 |
| 3383.0 | 36 |
| 3384.0 | 35 |
| 3385.0 | 34 |
| 3386.0 | 35 |
| 3387.0 | 36 |
| 3388.0 | 37 |
| 3389.0 | 38 |
| 3390.0 | 37 |
| 3391.0 | 38 |
| 3392.0 | 37 |
| 3393.0 | 38 |
| 3394.0 | 37 |
| 3395.0 | 36 |
| 3396.0 | 37 |
| 3397.0 | 38 |
| 3398.0 | 37 |
| 3399.0 | 36 |
| 3400.0 | 35 |
| 3401.0 | 34 |
| 3402.0 | 35 |
| 3403.0 | 36 |
| 3404.0 | 35 |
| 3405.0 | 36 |
| 3406.0 | 35 |
| 3407.0 | 34 |
| 3408.0 | 35 |
| 3409.0 | 36 |
| 3410.0 | 37 |
| 3411.0 | 38 |
| 3412.0 | 37 |
| 3413.0 | 38 |
| 3414.0 | 39 |
| 3415.0 | 38 |
| 3416.0 | 39 |
| 3417.0 | 40 |
| 3418.0 | 39 |
| 3419.0 | 38 |
| 3420.0 | 39 |
| 3421.0 | 38 |
| 3422.0 | 37 |
| 3423.0 | 36 |
| 3424.0 | 35 |
| 3425.0 | 36 |
| 3426.0 | 37 |
| 3427.0 | 36 |
| 3428.0 | 35 |
| 3429.0 | 36 |
| 3430.0 | 37 |
| 3431.0 | 36 |
| 3432.0 | 37 |
| 3433.0 | 38 |
| 3434.0 | 39 |
| 3435.0 | 38 |
| 3436.0 | 39 |
| 3437.0 | 38 |
| 3438.0 | 37 |
| 3439.0 | 36 |
| 3440.0 | 35 |
| 3441.0 | 36 |
| 3442.0 | 37 |
| 3443.0 | 38 |
| 3444.0 | 39 |
| 3445.0 | 38 |
| 3446.0 | 37 |
| 3447.0 | 36 |
| 3448.0 | 37 |
| 3449.0 | 38 |
| 3450.0 | 37 |
| 3451.0 | 36 |
| 3452.0 | 37 |
| 3453.0 | 36 |
| 3454.0 | 35 |
| 3455.0 | 36 |
| 3456.0 | 37 |
| 3457.0 | 36 |
| 3458.0 | 37 |
| 3459.0 | 36 |
| 3460.0 | 37 |
| 3461.0 | 38 |
| 3462.0 | 37 |
| 3463.0 | 36 |
| 3464.0 | 35 |
| 3465.0 | 36 |
| 3466.0 | 35 |
| 3467.0 | 36 |
| 3468.0 | 37 |
| 3469.0 | 38 |
| 3470.0 | 39 |
| 3471.0 | 38 |
| 3472.0 | 37 |
| 3473.0 | 36 |
| 3474.0 | 35 |
| 3475.0 | 36 |
| 3476.0 | 35 |
| 3477.0 | 36 |
| 3478.0 | 37 |
| 3479.0 | 38 |
| 3480.0 | 37 |
| 3481.0 | 38 |
| 3482.0 | 39 |
| 3483.0 | 38 |
| 3484.0 | 39 |
| 3485.0 | 38 |
| 3486.0 | 39 |
| 3487.0 | 40 |
| 3488.0 | 39 |
| 3489.0 | 40 |
| 3490.0 | 41 |
| 3491.0 | 42 |
| 3492.0 | 41 |
| 3493.0 | 40 |
| 3494.0 | 41 |
| 3495.0 | 42 |
| 3496.0 | 41 |
| 3497.0 | 42 |
| 3498.0 | 43 |
| 3499.0 | 44 |
| 3500.0 | 43 |
| 3501.0 | 44 |
| 3502.0 | 43 |
| 3503.0 | 42 |
| 3504.0 | 43 |
| 3505.0 | 42 |
| 3506.0 | 43 |
| 3507.0 | 44 |
| 3508.0 | 43 |
| 3509.0 | 42 |
| 3510.0 | 43 |
| 3511.0 | 42 |
| 3512.0 | 41 |
| 3513.0 | 42 |
| 3514.0 | 43 |
| 3515.0 | 42 |
| 3516.0 | 41 |
| 3517.0 | 42 |
| 3518.0 | 43 |
| 3519.0 | 42 |
| 3520.0 | 43 |
| 3521.0 | 42 |
| 3522.0 | 43 |
| 3523.0 | 42 |
| 3524.0 | 43 |
| 3525.0 | 44 |
| 3526.0 | 43 |
| 3527.0 | 44 |
| 3528.0 | 45 |
| 3529.0 | 46 |
| 3530.0 | 47 |
| 3531.0 | 46 |
| 3532.0 | 47 |
| 3533.0 | 46 |
| 3534.0 | 45 |
| 3535.0 | 46 |
| 3536.0 | 47 |
| 3537.0 | 46 |
| 3538.0 | 45 |
| 3539.0 | 44 |
| 3540.0 | 45 |
| 3541.0 | 44 |
| 3542.0 | 43 |
| 3543.0 | 44 |
| 3544.0 | 43 |
| 3545.0 | 44 |
| 3546.0 | 43 |
| 3547.0 | 44 |
| 3548.0 | 43 |
| 3549.0 | 44 |
| 3550.0 | 45 |
| 3551.0 | 46 |
| 3552.0 | 47 |
| 3553.0 | 46 |
| 3554.0 | 45 |
| 3555.0 | 44 |
| 3556.0 | 45 |
| 3557.0 | 46 |
| 3558.0 | 45 |
| 3559.0 | 44 |
| 3560.0 | 43 |
| 3561.0 | 42 |
| 3562.0 | 41 |
| 3563.0 | 40 |
| 3564.0 | 41 |
| 3565.0 | 40 |
| 3566.0 | 41 |
| 3567.0 | 42 |
| 3568.0 | 41 |
| 3569.0 | 40 |
| 3570.0 | 39 |
| 3571.0 | 40 |
| 3572.0 | 41 |
| 3573.0 | 42 |
| 3574.0 | 43 |
| 3575.0 | 44 |
| 3576.0 | 45 |
| 3577.0 | 44 |
| 3578.0 | 45 |
| 3579.0 | 46 |
| 3580.0 | 45 |
| 3581.0 | 46 |
| 3582.0 | 47 |
| 3583.0 | 46 |
| 3584.0 | 47 |
| 3585.0 | 46 |
| 3586.0 | 47 |
| 3587.0 | 48 |
| 3588.0 | 49 |
| 3589.0 | 50 |
| 3590.0 | 49 |
| 3591.0 | 48 |
| 3592.0 | 49 |
| 3593.0 | 50 |
| 3594.0 | 49 |
| 3595.0 | 48 |
| 3596.0 | 49 |
| 3597.0 | 50 |
| 3598.0 | 49 |
| 3599.0 | 48 |
| 3600.0 | 47 |
| 3601.0 | 46 |
| 3602.0 | 45 |
| 3603.0 | 44 |
| 3604.0 | 43 |
| 3605.0 | 42 |
| 3606.0 | 43 |
| 3607.0 | 42 |
| 3608.0 | 43 |
| 3609.0 | 42 |
| 3610.0 | 43 |
| 3611.0 | 44 |
| 3612.0 | 45 |
| 3613.0 | 46 |
| 3614.0 | 47 |
| 3615.0 | 46 |
| 3616.0 | 45 |
| 3617.0 | 46 |
| 3618.0 | 47 |
| 3619.0 | 46 |
| 3620.0 | 47 |
| 3621.0 | 46 |
| 3622.0 | 45 |
| 3623.0 | 46 |
| 3624.0 | 47 |
| 3625.0 | 48 |
| 3626.0 | 47 |
| 3627.0 | 46 |
| 3628.0 | 45 |
| 3629.0 | 46 |
| 3630.0 | 47 |
| 3631.0 | 48 |
| 3632.0 | 49 |
| 3633.0 | 48 |
| 3634.0 | 47 |
| 3635.0 | 46 |
| 3636.0 | 45 |
| 3637.0 | 46 |
| 3638.0 | 45 |
| 3639.0 | 46 |
| 3640.0 | 47 |
| 3641.0 | 46 |
| 3642.0 | 45 |
| 3643.0 | 44 |
| 3644.0 | 43 |
| 3645.0 | 44 |
| 3646.0 | 43 |
| 3647.0 | 42 |
| 3648.0 | 41 |
| 3649.0 | 40 |
| 3650.0 | 39 |
| 3651.0 | 38 |
| 3652.0 | 39 |
| 3653.0 | 40 |
| 3654.0 | 39 |
| 3655.0 | 38 |
| 3656.0 | 39 |
| 3657.0 | 38 |
| 3658.0 | 37 |
| 3659.0 | 36 |
| 3660.0 | 35 |
| 3661.0 | 36 |
| 3662.0 | 35 |
| 3663.0 | 34 |
| 3664.0 | 35 |
| 3665.0 | 36 |
| 3666.0 | 35 |
| 3667.0 | 34 |
| 3668.0 | 33 |
| 3669.0 | 34 |
| 3670.0 | 35 |
| 3671.0 | 34 |
| 3672.0 | 33 |
| 3673.0 | 34 |
| 3674.0 | 35 |
| 3675.0 | 34 |
| 3676.0 | 35 |
| 3677.0 | 36 |
| 3678.0 | 35 |
| 3679.0 | 36 |
| 3680.0 | 37 |
| 3681.0 | 36 |
| 3682.0 | 37 |
| 3683.0 | 38 |
| 3684.0 | 39 |
| 3685.0 | 40 |
| 3686.0 | 39 |
| 3687.0 | 40 |
| 3688.0 | 41 |
| 3689.0 | 42 |
| 3690.0 | 43 |
| 3691.0 | 44 |
| 3692.0 | 43 |
| 3693.0 | 44 |
| 3694.0 | 45 |
| 3695.0 | 46 |
| 3696.0 | 45 |
| 3697.0 | 46 |
| 3698.0 | 47 |
| 3699.0 | 46 |
| 3700.0 | 45 |
| 3701.0 | 46 |
| 3702.0 | 47 |
| 3703.0 | 48 |
| 3704.0 | 49 |
| 3705.0 | 48 |
| 3706.0 | 49 |
| 3707.0 | 48 |
| 3708.0 | 47 |
| 3709.0 | 48 |
| 3710.0 | 47 |
| 3711.0 | 48 |
| 3712.0 | 47 |
| 3713.0 | 46 |
| 3714.0 | 47 |
| 3715.0 | 46 |
| 3716.0 | 45 |
| 3717.0 | 44 |
| 3718.0 | 43 |
| 3719.0 | 42 |
| 3720.0 | 43 |
| 3721.0 | 42 |
| 3722.0 | 41 |
| 3723.0 | 40 |
| 3724.0 | 41 |
| 3725.0 | 40 |
| 3726.0 | 39 |
| 3727.0 | 40 |
| 3728.0 | 39 |
| 3729.0 | 40 |
| 3730.0 | 41 |
| 3731.0 | 40 |
| 3732.0 | 41 |
| 3733.0 | 40 |
| 3734.0 | 41 |
| 3735.0 | 42 |
| 3736.0 | 41 |
| 3737.0 | 42 |
| 3738.0 | 41 |
| 3739.0 | 40 |
| 3740.0 | 41 |
| 3741.0 | 40 |
| 3742.0 | 41 |
| 3743.0 | 40 |
| 3744.0 | 39 |
| 3745.0 | 38 |
| 3746.0 | 37 |
| 3747.0 | 38 |
| 3748.0 | 39 |
| 3749.0 | 40 |
| 3750.0 | 39 |
| 3751.0 | 38 |
| 3752.0 | 39 |
| 3753.0 | 38 |
| 3754.0 | 37 |
| 3755.0 | 36 |
| 3756.0 | 35 |
| 3757.0 | 36 |
| 3758.0 | 37 |
| 3759.0 | 38 |
| 3760.0 | 37 |
| 3761.0 | 36 |
| 3762.0 | 35 |
| 3763.0 | 36 |
| 3764.0 | 35 |
| 3765.0 | 36 |
| 3766.0 | 35 |
| 3767.0 | 34 |
| 3768.0 | 33 |
| 3769.0 | 34 |
| 3770.0 | 33 |
| 3771.0 | 32 |
| 3772.0 | 33 |
| 3773.0 | 34 |
| 3774.0 | 35 |
| 3775.0 | 36 |
| 3776.0 | 35 |
| 3777.0 | 34 |
| 3778.0 | 33 |
| 3779.0 | 34 |
| 3780.0 | 33 |
| 3781.0 | 34 |
| 3782.0 | 33 |
| 3783.0 | 34 |
| 3784.0 | 35 |
| 3785.0 | 36 |
| 3786.0 | 35 |
| 3787.0 | 34 |
| 3788.0 | 35 |
| 3789.0 | 34 |
| 3790.0 | 33 |
| 3791.0 | 34 |
| 3792.0 | 35 |
| 3793.0 | 34 |
| 3794.0 | 35 |
| 3795.0 | 34 |
| 3796.0 | 35 |
| 3797.0 | 36 |
| 3798.0 | 35 |
| 3799.0 | 36 |
| 3800.0 | 35 |
| 3801.0 | 36 |
| 3802.0 | 35 |
| 3803.0 | 34 |
| 3804.0 | 33 |
| 3805.0 | 34 |
| 3806.0 | 35 |
| 3807.0 | 36 |
| 3808.0 | 35 |
| 3809.0 | 34 |
| 3810.0 | 33 |
| 3811.0 | 34 |
| 3812.0 | 35 |
| 3813.0 | 34 |
| 3814.0 | 33 |
| 3815.0 | 32 |
| 3816.0 | 31 |
| 3817.0 | 32 |
| 3818.0 | 33 |
| 3819.0 | 32 |
| 3820.0 | 31 |
| 3821.0 | 32 |
| 3822.0 | 31 |
| 3823.0 | 32 |
| 3824.0 | 31 |
| 3825.0 | 30 |
| 3826.0 | 29 |
| 3827.0 | 28 |
| 3828.0 | 29 |
| 3829.0 | 30 |
| 3830.0 | 31 |
| 3831.0 | 32 |
| 3832.0 | 33 |
| 3833.0 | 34 |
| 3834.0 | 33 |
| 3835.0 | 34 |
| 3836.0 | 33 |
| 3837.0 | 32 |
| 3838.0 | 31 |
| 3839.0 | 30 |
| 3840.0 | 29 |
| 3841.0 | 28 |
| 3842.0 | 27 |
| 3843.0 | 28 |
| 3844.0 | 27 |
| 3845.0 | 26 |
| 3846.0 | 27 |
| 3847.0 | 28 |
| 3848.0 | 29 |
| 3849.0 | 28 |
| 3850.0 | 29 |
| 3851.0 | 28 |
| 3852.0 | 29 |
| 3853.0 | 30 |
| 3854.0 | 31 |
| 3855.0 | 30 |
| 3856.0 | 29 |
| 3857.0 | 28 |
| 3858.0 | 29 |
| 3859.0 | 30 |
| 3860.0 | 29 |
| 3861.0 | 28 |
| 3862.0 | 29 |
| 3863.0 | 28 |
| 3864.0 | 27 |
| 3865.0 | 26 |
| 3866.0 | 25 |
| 3867.0 | 24 |
| 3868.0 | 23 |
| 3869.0 | 22 |
| 3870.0 | 23 |
| 3871.0 | 22 |
| 3872.0 | 23 |
| 3873.0 | 24 |
| 3874.0 | 25 |
| 3875.0 | 24 |
| 3876.0 | 25 |
| 3877.0 | 26 |
| 3878.0 | 25 |
| 3879.0 | 26 |
| 3880.0 | 27 |
| 3881.0 | 28 |
| 3882.0 | 29 |
| 3883.0 | 28 |
| 3884.0 | 27 |
| 3885.0 | 26 |
| 3886.0 | 25 |
| 3887.0 | 24 |
| 3888.0 | 23 |
| 3889.0 | 22 |
| 3890.0 | 23 |
| 3891.0 | 24 |
| 3892.0 | 25 |
| 3893.0 | 24 |
| 3894.0 | 25 |
| 3895.0 | 26 |
| 3896.0 | 27 |
| 3897.0 | 26 |
| 3898.0 | 27 |
| 3899.0 | 26 |
| 3900.0 | 27 |
| 3901.0 | 28 |
| 3902.0 | 29 |
| 3903.0 | 30 |
| 3904.0 | 31 |
| 3905.0 | 30 |
| 3906.0 | 29 |
| 3907.0 | 30 |
| 3908.0 | 31 |
| 3909.0 | 30 |
| 3910.0 | 31 |
| 3911.0 | 30 |
| 3912.0 | 31 |
| 3913.0 | 32 |
| 3914.0 | 33 |
| 3915.0 | 32 |
| 3916.0 | 33 |
| 3917.0 | 32 |
| 3918.0 | 33 |
| 3919.0 | 32 |
| 3920.0 | 31 |
| 3921.0 | 30 |
| 3922.0 | 29 |
| 3923.0 | 28 |
| 3924.0 | 27 |
| 3925.0 | 26 |
| 3926.0 | 27 |
| 3927.0 | 28 |
| 3928.0 | 29 |
| 3929.0 | 30 |
| 3930.0 | 31 |
| 3931.0 | 30 |
| 3932.0 | 31 |
| 3933.0 | 32 |
| 3934.0 | 33 |
| 3935.0 | 34 |
| 3936.0 | 33 |
| 3937.0 | 34 |
| 3938.0 | 33 |
| 3939.0 | 34 |
| 3940.0 | 33 |
| 3941.0 | 34 |
| 3942.0 | 35 |
| 3943.0 | 34 |
| 3944.0 | 35 |
| 3945.0 | 36 |
| 3946.0 | 37 |
| 3947.0 | 36 |
| 3948.0 | 35 |
| 3949.0 | 36 |
| 3950.0 | 37 |
| 3951.0 | 36 |
| 3952.0 | 37 |
| 3953.0 | 36 |
| 3954.0 | 35 |
| 3955.0 | 36 |
| 3956.0 | 35 |
| 3957.0 | 34 |
| 3958.0 | 35 |
| 3959.0 | 36 |
| 3960.0 | 37 |
| 3961.0 | 38 |
| 3962.0 | 39 |
| 3963.0 | 40 |
| 3964.0 | 41 |
| 3965.0 | 42 |
| 3966.0 | 43 |
| 3967.0 | 44 |
| 3968.0 | 43 |
| 3969.0 | 44 |
| 3970.0 | 43 |
| 3971.0 | 44 |
| 3972.0 | 43 |
| 3973.0 | 44 |
| 3974.0 | 45 |
| 3975.0 | 44 |
| 3976.0 | 45 |
| 3977.0 | 44 |
| 3978.0 | 45 |
| 3979.0 | 46 |
| 3980.0 | 45 |
| 3981.0 | 44 |
| 3982.0 | 43 |
| 3983.0 | 44 |
| 3984.0 | 43 |
| 3985.0 | 44 |
| 3986.0 | 43 |
| 3987.0 | 44 |
| 3988.0 | 43 |
| 3989.0 | 42 |
| 3990.0 | 43 |
| 3991.0 | 44 |
| 3992.0 | 43 |
| 3993.0 | 44 |
| 3994.0 | 45 |
| 3995.0 | 46 |
| 3996.0 | 45 |
| 3997.0 | 46 |
| 3998.0 | 47 |
| 3999.0 | 46 |
| 4000.0 | 47 |
| 4001.0 | 46 |
| 4002.0 | 45 |
| 4003.0 | 44 |
| 4004.0 | 43 |
| 4005.0 | 42 |
| 4006.0 | 43 |
| 4007.0 | 44 |
| 4008.0 | 45 |
| 4009.0 | 46 |
| 4010.0 | 45 |
| 4011.0 | 46 |
| 4012.0 | 45 |
| 4013.0 | 44 |
| 4014.0 | 43 |
| 4015.0 | 42 |
| 4016.0 | 41 |
| 4017.0 | 40 |
| 4018.0 | 39 |
| 4019.0 | 40 |
| 4020.0 | 39 |
| 4021.0 | 38 |
| 4022.0 | 37 |
| 4023.0 | 36 |
| 4024.0 | 37 |
| 4025.0 | 36 |
| 4026.0 | 37 |
| 4027.0 | 38 |
| 4028.0 | 37 |
| 4029.0 | 36 |
| 4030.0 | 35 |
| 4031.0 | 36 |
| 4032.0 | 37 |
| 4033.0 | 36 |
| 4034.0 | 37 |
| 4035.0 | 38 |
| 4036.0 | 39 |
| 4037.0 | 38 |
| 4038.0 | 39 |
| 4039.0 | 38 |
| 4040.0 | 37 |
| 4041.0 | 38 |
| 4042.0 | 39 |
| 4043.0 | 38 |
| 4044.0 | 39 |
| 4045.0 | 40 |
| 4046.0 | 41 |
| 4047.0 | 42 |
| 4048.0 | 43 |
| 4049.0 | 44 |
| 4050.0 | 43 |
| 4051.0 | 42 |
| 4052.0 | 43 |
| 4053.0 | 44 |
| 4054.0 | 45 |
| 4055.0 | 44 |
| 4056.0 | 45 |
| 4057.0 | 44 |
| 4058.0 | 45 |
| 4059.0 | 44 |
| 4060.0 | 43 |
| 4061.0 | 42 |
| 4062.0 | 43 |
| 4063.0 | 42 |
| 4064.0 | 43 |
| 4065.0 | 42 |
| 4066.0 | 43 |
| 4067.0 | 42 |
| 4068.0 | 41 |
| 4069.0 | 40 |
| 4070.0 | 41 |
| 4071.0 | 42 |
| 4072.0 | 43 |
| 4073.0 | 44 |
| 4074.0 | 43 |
| 4075.0 | 44 |
| 4076.0 | 43 |
| 4077.0 | 42 |
| 4078.0 | 43 |
| 4079.0 | 44 |
| 4080.0 | 45 |
| 4081.0 | 44 |
| 4082.0 | 45 |
| 4083.0 | 44 |
| 4084.0 | 43 |
| 4085.0 | 42 |
| 4086.0 | 43 |
| 4087.0 | 44 |
| 4088.0 | 45 |
| 4089.0 | 46 |
| 4090.0 | 47 |
| 4091.0 | 46 |
| 4092.0 | 45 |
| 4093.0 | 44 |
| 4094.0 | 43 |
| 4095.0 | 44 |
| 4096.0 | 43 |
| 4097.0 | 42 |
| 4098.0 | 41 |
| 4099.0 | 42 |
| 4100.0 | 43 |
| 4101.0 | 44 |
| 4102.0 | 43 |
| 4103.0 | 44 |
| 4104.0 | 43 |
| 4105.0 | 44 |
| 4106.0 | 43 |
| 4107.0 | 42 |
| 4108.0 | 41 |
| 4109.0 | 42 |
| 4110.0 | 41 |
| 4111.0 | 42 |
| 4112.0 | 43 |
| 4113.0 | 44 |
| 4114.0 | 43 |
| 4115.0 | 42 |
| 4116.0 | 41 |
| 4117.0 | 42 |
| 4118.0 | 43 |
| 4119.0 | 42 |
| 4120.0 | 41 |
| 4121.0 | 42 |
| 4122.0 | 43 |
| 4123.0 | 44 |
| 4124.0 | 45 |
| 4125.0 | 44 |
| 4126.0 | 43 |
| 4127.0 | 42 |
| 4128.0 | 41 |
| 4129.0 | 40 |
| 4130.0 | 39 |
| 4131.0 | 38 |
| 4132.0 | 39 |
| 4133.0 | 38 |
| 4134.0 | 39 |
| 4135.0 | 38 |
| 4136.0 | 37 |
| 4137.0 | 36 |
| 4138.0 | 37 |
| 4139.0 | 38 |
| 4140.0 | 37 |
| 4141.0 | 36 |
| 4142.0 | 35 |
| 4143.0 | 36 |
| 4144.0 | 37 |
| 4145.0 | 38 |
| 4146.0 | 37 |
| 4147.0 | 38 |
| 4148.0 | 37 |
| 4149.0 | 38 |
| 4150.0 | 37 |
| 4151.0 | 36 |
| 4152.0 | 35 |
| 4153.0 | 36 |
| 4154.0 | 37 |
| 4155.0 | 38 |
| 4156.0 | 37 |
| 4157.0 | 36 |
| 4158.0 | 35 |
| 4159.0 | 34 |
| 4160.0 | 33 |
| 4161.0 | 34 |
| 4162.0 | 35 |
| 4163.0 | 36 |
| 4164.0 | 37 |
| 4165.0 | 36 |
| 4166.0 | 37 |
| 4167.0 | 38 |
| 4168.0 | 37 |
| 4169.0 | 36 |
| 4170.0 | 37 |
| 4171.0 | 36 |
| 4172.0 | 35 |
| 4173.0 | 36 |
| 4174.0 | 37 |
| 4175.0 | 36 |
| 4176.0 | 35 |
| 4177.0 | 34 |
| 4178.0 | 33 |
| 4179.0 | 32 |
| 4180.0 | 33 |
| 4181.0 | 34 |
| 4182.0 | 35 |
| 4183.0 | 34 |
| 4184.0 | 35 |
| 4185.0 | 34 |
| 4186.0 | 35 |
| 4187.0 | 36 |
| 4188.0 | 37 |
| 4189.0 | 36 |
| 4190.0 | 35 |
| 4191.0 | 36 |
| 4192.0 | 35 |
| 4193.0 | 36 |
| 4194.0 | 35 |
| 4195.0 | 36 |
| 4196.0 | 37 |
| 4197.0 | 36 |
| 4198.0 | 35 |
| 4199.0 | 34 |
| 4200.0 | 35 |
| 4201.0 | 34 |
| 4202.0 | 33 |
| 4203.0 | 34 |
| 4204.0 | 33 |
| 4205.0 | 32 |
| 4206.0 | 31 |
| 4207.0 | 30 |
| 4208.0 | 29 |
| 4209.0 | 28 |
| 4210.0 | 29 |
| 4211.0 | 28 |
| 4212.0 | 27 |
| 4213.0 | 26 |
| 4214.0 | 25 |
| 4215.0 | 26 |
| 4216.0 | 27 |
| 4217.0 | 28 |
| 4218.0 | 29 |
| 4219.0 | 28 |
| 4220.0 | 29 |
| 4221.0 | 28 |
| 4222.0 | 27 |
| 4223.0 | 28 |
| 4224.0 | 27 |
| 4225.0 | 26 |
| 4226.0 | 27 |
| 4227.0 | 28 |
| 4228.0 | 27 |
| 4229.0 | 28 |
| 4230.0 | 29 |
| 4231.0 | 28 |
| 4232.0 | 29 |
| 4233.0 | 30 |
| 4234.0 | 29 |
| 4235.0 | 28 |
| 4236.0 | 29 |
| 4237.0 | 30 |
| 4238.0 | 31 |
| 4239.0 | 30 |
| 4240.0 | 31 |
| 4241.0 | 30 |
| 4242.0 | 31 |
| 4243.0 | 30 |
| 4244.0 | 31 |
| 4245.0 | 30 |
| 4246.0 | 29 |
| 4247.0 | 30 |
| 4248.0 | 31 |
| 4249.0 | 32 |
| 4250.0 | 31 |
| 4251.0 | 32 |
| 4252.0 | 31 |
| 4253.0 | 30 |
| 4254.0 | 29 |
| 4255.0 | 30 |
| 4256.0 | 31 |
| 4257.0 | 30 |
| 4258.0 | 31 |
| 4259.0 | 32 |
| 4260.0 | 31 |
| 4261.0 | 32 |
| 4262.0 | 31 |
| 4263.0 | 30 |
| 4264.0 | 29 |
| 4265.0 | 30 |
| 4266.0 | 29 |
| 4267.0 | 30 |
| 4268.0 | 31 |
| 4269.0 | 30 |
| 4270.0 | 29 |
| 4271.0 | 28 |
| 4272.0 | 29 |
| 4273.0 | 28 |
| 4274.0 | 27 |
| 4275.0 | 26 |
| 4276.0 | 25 |
| 4277.0 | 26 |
| 4278.0 | 25 |
| 4279.0 | 26 |
| 4280.0 | 25 |
| 4281.0 | 26 |
| 4282.0 | 25 |
| 4283.0 | 24 |
| 4284.0 | 25 |
| 4285.0 | 26 |
| 4286.0 | 25 |
| 4287.0 | 26 |
| 4288.0 | 25 |
| 4289.0 | 26 |
| 4290.0 | 25 |
| 4291.0 | 26 |
| 4292.0 | 25 |
| 4293.0 | 26 |
| 4294.0 | 27 |
| 4295.0 | 26 |
| 4296.0 | 25 |
| 4297.0 | 24 |
| 4298.0 | 23 |
| 4299.0 | 22 |
| 4300.0 | 23 |
| 4301.0 | 24 |
| 4302.0 | 23 |
| 4303.0 | 24 |
| 4304.0 | 23 |
| 4305.0 | 24 |
| 4306.0 | 25 |
| 4307.0 | 26 |
| 4308.0 | 25 |
| 4309.0 | 26 |
| 4310.0 | 25 |
| 4311.0 | 26 |
| 4312.0 | 27 |
| 4313.0 | 28 |
| 4314.0 | 29 |
| 4315.0 | 30 |
| 4316.0 | 29 |
| 4317.0 | 28 |
| 4318.0 | 29 |
| 4319.0 | 28 |
| 4320.0 | 27 |
| 4321.0 | 26 |
| 4322.0 | 27 |
| 4323.0 | 26 |
| 4324.0 | 25 |
| 4325.0 | 26 |
| 4326.0 | 27 |
| 4327.0 | 26 |
| 4328.0 | 27 |
| 4329.0 | 26 |
| 4330.0 | 25 |
| 4331.0 | 24 |
| 4332.0 | 23 |
| 4333.0 | 22 |
| 4334.0 | 23 |
| 4335.0 | 24 |
| 4336.0 | 23 |
| 4337.0 | 24 |
| 4338.0 | 23 |
| 4339.0 | 22 |
| 4340.0 | 23 |
| 4341.0 | 24 |
| 4342.0 | 23 |
| 4343.0 | 24 |
| 4344.0 | 23 |
| 4345.0 | 24 |
| 4346.0 | 25 |
| 4347.0 | 24 |
| 4348.0 | 25 |
| 4349.0 | 24 |
| 4350.0 | 25 |
| 4351.0 | 26 |
| 4352.0 | 25 |
| 4353.0 | 24 |
| 4354.0 | 23 |
| 4355.0 | 22 |
| 4356.0 | 21 |
| 4357.0 | 22 |
| 4358.0 | 21 |
| 4359.0 | 22 |
| 4360.0 | 21 |
| 4361.0 | 22 |
| 4362.0 | 21 |
| 4363.0 | 22 |
| 4364.0 | 21 |
| 4365.0 | 20 |
| 4366.0 | 21 |
| 4367.0 | 20 |
| 4368.0 | 21 |
| 4369.0 | 22 |
| 4370.0 | 23 |
| 4371.0 | 22 |
| 4372.0 | 21 |
| 4373.0 | 20 |
| 4374.0 | 19 |
| 4375.0 | 18 |
| 4376.0 | 19 |
| 4377.0 | 20 |
| 4378.0 | 21 |
| 4379.0 | 22 |
| 4380.0 | 23 |
| 4381.0 | 22 |
| 4382.0 | 23 |
| 4383.0 | 22 |
| 4384.0 | 23 |
| 4385.0 | 24 |
| 4386.0 | 23 |
| 4387.0 | 22 |
| 4388.0 | 21 |
| 4389.0 | 22 |
| 4390.0 | 21 |
| 4391.0 | 20 |
| 4392.0 | 21 |
| 4393.0 | 20 |
| 4394.0 | 21 |
| 4395.0 | 20 |
| 4396.0 | 21 |
| 4397.0 | 22 |
| 4398.0 | 21 |
| 4399.0 | 22 |
| 4400.0 | 21 |
| 4401.0 | 20 |
| 4402.0 | 21 |
| 4403.0 | 20 |
| 4404.0 | 19 |
| 4405.0 | 20 |
| 4406.0 | 21 |
| 4407.0 | 22 |
| 4408.0 | 21 |
| 4409.0 | 20 |
| 4410.0 | 21 |
| 4411.0 | 22 |
| 4412.0 | 23 |
| 4413.0 | 24 |
| 4414.0 | 25 |
| 4415.0 | 26 |
| 4416.0 | 25 |
| 4417.0 | 24 |
| 4418.0 | 23 |
| 4419.0 | 24 |
| 4420.0 | 23 |
| 4421.0 | 22 |
| 4422.0 | 21 |
| 4423.0 | 22 |
| 4424.0 | 23 |
| 4425.0 | 22 |
| 4426.0 | 23 |
| 4427.0 | 22 |
| 4428.0 | 21 |
| 4429.0 | 20 |
| 4430.0 | 19 |
| 4431.0 | 18 |
| 4432.0 | 17 |
| 4433.0 | 18 |
| 4434.0 | 19 |
| 4435.0 | 20 |
| 4436.0 | 19 |
| 4437.0 | 20 |
| 4438.0 | 19 |
| 4439.0 | 18 |
| 4440.0 | 17 |
| 4441.0 | 16 |
| 4442.0 | 17 |
| 4443.0 | 18 |
| 4444.0 | 19 |
| 4445.0 | 20 |
| 4446.0 | 21 |
| 4447.0 | 22 |
| 4448.0 | 21 |
| 4449.0 | 20 |
| 4450.0 | 19 |
| 4451.0 | 20 |
| 4452.0 | 19 |
| 4453.0 | 20 |
| 4454.0 | 21 |
| 4455.0 | 22 |
| 4456.0 | 21 |
| 4457.0 | 20 |
| 4458.0 | 21 |
| 4459.0 | 22 |
| 4460.0 | 21 |
| 4461.0 | 20 |
| 4462.0 | 21 |
| 4463.0 | 20 |
| 4464.0 | 21 |
| 4465.0 | 20 |
| 4466.0 | 21 |
| 4467.0 | 22 |
| 4468.0 | 21 |
| 4469.0 | 20 |
| 4470.0 | 21 |
| 4471.0 | 22 |
| 4472.0 | 21 |
| 4473.0 | 22 |
| 4474.0 | 23 |
| 4475.0 | 24 |
| 4476.0 | 25 |
| 4477.0 | 24 |
| 4478.0 | 23 |
| 4479.0 | 24 |
| 4480.0 | 25 |
| 4481.0 | 24 |
| 4482.0 | 23 |
| 4483.0 | 24 |
| 4484.0 | 23 |
| 4485.0 | 22 |
| 4486.0 | 21 |
| 4487.0 | 22 |
| 4488.0 | 21 |
| 4489.0 | 20 |
| 4490.0 | 21 |
| 4491.0 | 22 |
| 4492.0 | 23 |
| 4493.0 | 24 |
| 4494.0 | 25 |
| 4495.0 | 24 |
| 4496.0 | 25 |
| 4497.0 | 26 |
| 4498.0 | 25 |
| 4499.0 | 26 |
| 4500.0 | 25 |
| 4501.0 | 26 |
| 4502.0 | 27 |
| 4503.0 | 26 |
| 4504.0 | 27 |
| 4505.0 | 26 |
| 4506.0 | 27 |
| 4507.0 | 26 |
| 4508.0 | 27 |
| 4509.0 | 26 |
| 4510.0 | 25 |
| 4511.0 | 24 |
| 4512.0 | 25 |
| 4513.0 | 26 |
| 4514.0 | 25 |
| 4515.0 | 24 |
| 4516.0 | 23 |
| 4517.0 | 22 |
| 4518.0 | 23 |
| 4519.0 | 24 |
| 4520.0 | 25 |
| 4521.0 | 24 |
| 4522.0 | 25 |
| 4523.0 | 24 |
| 4524.0 | 25 |
| 4525.0 | 26 |
| 4526.0 | 25 |
| 4527.0 | 26 |
| 4528.0 | 27 |
| 4529.0 | 28 |
| 4530.0 | 27 |
| 4531.0 | 26 |
| 4532.0 | 25 |
| 4533.0 | 24 |
| 4534.0 | 23 |
| 4535.0 | 24 |
| 4536.0 | 25 |
| 4537.0 | 24 |
| 4538.0 | 23 |
| 4539.0 | 24 |
| 4540.0 | 23 |
| 4541.0 | 24 |
| 4542.0 | 23 |
| 4543.0 | 24 |
| 4544.0 | 25 |
| 4545.0 | 24 |
| 4546.0 | 23 |
| 4547.0 | 24 |
| 4548.0 | 23 |
| 4549.0 | 24 |
| 4550.0 | 23 |
| 4551.0 | 24 |
| 4552.0 | 25 |
| 4553.0 | 26 |
| 4554.0 | 25 |
| 4555.0 | 26 |
| 4556.0 | 25 |
| 4557.0 | 26 |
| 4558.0 | 27 |
| 4559.0 | 26 |
| 4560.0 | 27 |
| 4561.0 | 26 |
| 4562.0 | 25 |
| 4563.0 | 26 |
| 4564.0 | 25 |
| 4565.0 | 24 |
| 4566.0 | 25 |
| 4567.0 | 26 |
| 4568.0 | 27 |
| 4569.0 | 26 |
| 4570.0 | 27 |
| 4571.0 | 26 |
| 4572.0 | 25 |
| 4573.0 | 24 |
| 4574.0 | 25 |
| 4575.0 | 24 |
| 4576.0 | 25 |
| 4577.0 | 24 |
| 4578.0 | 23 |
| 4579.0 | 22 |
| 4580.0 | 21 |
| 4581.0 | 20 |
| 4582.0 | 21 |
| 4583.0 | 22 |
| 4584.0 | 23 |
| 4585.0 | 24 |
| 4586.0 | 23 |
| 4587.0 | 22 |
| 4588.0 | 21 |
| 4589.0 | 20 |
| 4590.0 | 19 |
| 4591.0 | 20 |
| 4592.0 | 21 |
| 4593.0 | 20 |
| 4594.0 | 21 |
| 4595.0 | 20 |
| 4596.0 | 21 |
| 4597.0 | 22 |
| 4598.0 | 23 |
| 4599.0 | 24 |
| 4600.0 | 23 |
| 4601.0 | 22 |
| 4602.0 | 21 |
| 4603.0 | 22 |
| 4604.0 | 23 |
| 4605.0 | 24 |
| 4606.0 | 23 |
| 4607.0 | 24 |
| 4608.0 | 23 |
| 4609.0 | 22 |
| 4610.0 | 23 |
| 4611.0 | 22 |
| 4612.0 | 21 |
| 4613.0 | 22 |
| 4614.0 | 21 |
| 4615.0 | 20 |
| 4616.0 | 21 |
| 4617.0 | 22 |
| 4618.0 | 23 |
| 4619.0 | 24 |
| 4620.0 | 23 |
| 4621.0 | 24 |
| 4622.0 | 25 |
| 4623.0 | 24 |
| 4624.0 | 23 |
| 4625.0 | 22 |
| 4626.0 | 23 |
| 4627.0 | 22 |
| 4628.0 | 23 |
| 4629.0 | 22 |
| 4630.0 | 23 |
| 4631.0 | 24 |
| 4632.0 | 23 |
| 4633.0 | 22 |
| 4634.0 | 23 |
| 4635.0 | 22 |
| 4636.0 | 23 |
| 4637.0 | 22 |
| 4638.0 | 21 |
| 4639.0 | 20 |
| 4640.0 | 21 |
| 4641.0 | 22 |
| 4642.0 | 23 |
| 4643.0 | 24 |
| 4644.0 | 25 |
| 4645.0 | 24 |
| 4646.0 | 25 |
| 4647.0 | 26 |
| 4648.0 | 25 |
| 4649.0 | 26 |
| 4650.0 | 27 |
| 4651.0 | 26 |
| 4652.0 | 27 |
| 4653.0 | 28 |
| 4654.0 | 29 |
| 4655.0 | 30 |
| 4656.0 | 31 |
| 4657.0 | 30 |
| 4658.0 | 29 |
| 4659.0 | 28 |
| 4660.0 | 29 |
| 4661.0 | 30 |
| 4662.0 | 29 |
| 4663.0 | 30 |
| 4664.0 | 29 |
| 4665.0 | 30 |
| 4666.0 | 29 |
| 4667.0 | 28 |
| 4668.0 | 27 |
| 4669.0 | 26 |
| 4670.0 | 27 |
| 4671.0 | 28 |
| 4672.0 | 27 |
| 4673.0 | 26 |
| 4674.0 | 25 |
| 4675.0 | 24 |
| 4676.0 | 23 |
| 4677.0 | 24 |
| 4678.0 | 25 |
| 4679.0 | 26 |
| 4680.0 | 27 |
| 4681.0 | 26 |
| 4682.0 | 25 |
| 4683.0 | 24 |
| 4684.0 | 25 |
| 4685.0 | 24 |
| 4686.0 | 23 |
| 4687.0 | 22 |
| 4688.0 | 21 |
| 4689.0 | 20 |
| 4690.0 | 19 |
| 4691.0 | 20 |
| 4692.0 | 21 |
| 4693.0 | 22 |
| 4694.0 | 23 |
| 4695.0 | 24 |
| 4696.0 | 23 |
| 4697.0 | 22 |
| 4698.0 | 23 |
| 4699.0 | 24 |
| 4700.0 | 25 |
| 4701.0 | 24 |
| 4702.0 | 23 |
| 4703.0 | 24 |
| 4704.0 | 23 |
| 4705.0 | 22 |
| 4706.0 | 23 |
| 4707.0 | 22 |
| 4708.0 | 23 |
| 4709.0 | 22 |
| 4710.0 | 23 |
| 4711.0 | 22 |
| 4712.0 | 21 |
| 4713.0 | 20 |
| 4714.0 | 19 |
| 4715.0 | 18 |
| 4716.0 | 19 |
| 4717.0 | 20 |
| 4718.0 | 19 |
| 4719.0 | 18 |
| 4720.0 | 19 |
| 4721.0 | 20 |
| 4722.0 | 21 |
| 4723.0 | 22 |
| 4724.0 | 23 |
| 4725.0 | 22 |
| 4726.0 | 23 |
| 4727.0 | 22 |
| 4728.0 | 23 |
| 4729.0 | 22 |
| 4730.0 | 21 |
| 4731.0 | 22 |
| 4732.0 | 23 |
| 4733.0 | 22 |
| 4734.0 | 23 |
| 4735.0 | 22 |
| 4736.0 | 23 |
| 4737.0 | 22 |
| 4738.0 | 21 |
| 4739.0 | 22 |
| 4740.0 | 23 |
| 4741.0 | 24 |
| 4742.0 | 25 |
| 4743.0 | 24 |
| 4744.0 | 25 |
| 4745.0 | 26 |
| 4746.0 | 25 |
| 4747.0 | 24 |
| 4748.0 | 23 |
| 4749.0 | 24 |
| 4750.0 | 23 |
| 4751.0 | 22 |
| 4752.0 | 23 |
| 4753.0 | 22 |
| 4754.0 | 23 |
| 4755.0 | 24 |
| 4756.0 | 25 |
| 4757.0 | 24 |
| 4758.0 | 25 |
| 4759.0 | 24 |
| 4760.0 | 25 |
| 4761.0 | 24 |
| 4762.0 | 23 |
| 4763.0 | 24 |
| 4764.0 | 25 |
| 4765.0 | 24 |
| 4766.0 | 23 |
| 4767.0 | 24 |
| 4768.0 | 25 |
| 4769.0 | 26 |
| 4770.0 | 25 |
| 4771.0 | 24 |
| 4772.0 | 23 |
| 4773.0 | 22 |
| 4774.0 | 21 |
| 4775.0 | 20 |
| 4776.0 | 19 |
| 4777.0 | 18 |
| 4778.0 | 17 |
| 4779.0 | 18 |
| 4780.0 | 19 |
| 4781.0 | 18 |
| 4782.0 | 19 |
| 4783.0 | 20 |
| 4784.0 | 21 |
| 4785.0 | 20 |
| 4786.0 | 21 |
| 4787.0 | 20 |
| 4788.0 | 19 |
| 4789.0 | 18 |
| 4790.0 | 17 |
| 4791.0 | 16 |
| 4792.0 | 17 |
| 4793.0 | 18 |
| 4794.0 | 19 |
| 4795.0 | 18 |
| 4796.0 | 17 |
| 4797.0 | 18 |
| 4798.0 | 17 |
| 4799.0 | 18 |
| 4800.0 | 19 |
| 4801.0 | 20 |
| 4802.0 | 19 |
| 4803.0 | 18 |
| 4804.0 | 17 |
| 4805.0 | 16 |
| 4806.0 | 15 |
| 4807.0 | 14 |
| 4808.0 | 13 |
| 4809.0 | 12 |
| 4810.0 | 13 |
| 4811.0 | 14 |
| 4812.0 | 13 |
| 4813.0 | 14 |
| 4814.0 | 15 |
| 4815.0 | 14 |
| 4816.0 | 15 |
| 4817.0 | 14 |
| 4818.0 | 15 |
| 4819.0 | 16 |
| 4820.0 | 17 |
| 4821.0 | 16 |
| 4822.0 | 17 |
| 4823.0 | 16 |
| 4824.0 | 17 |
| 4825.0 | 16 |
| 4826.0 | 15 |
| 4827.0 | 14 |
| 4828.0 | 13 |
| 4829.0 | 14 |
| 4830.0 | 15 |
| 4831.0 | 16 |
| 4832.0 | 17 |
| 4833.0 | 18 |
| 4834.0 | 19 |
| 4835.0 | 20 |
| 4836.0 | 21 |
| 4837.0 | 22 |
| 4838.0 | 23 |
| 4839.0 | 24 |
| 4840.0 | 25 |
| 4841.0 | 24 |
| 4842.0 | 25 |
| 4843.0 | 24 |
| 4844.0 | 23 |
| 4845.0 | 24 |
| 4846.0 | 23 |
| 4847.0 | 24 |
| 4848.0 | 25 |
| 4849.0 | 24 |
| 4850.0 | 23 |
| 4851.0 | 22 |
| 4852.0 | 23 |
| 4853.0 | 22 |
| 4854.0 | 23 |
| 4855.0 | 22 |
| 4856.0 | 21 |
| 4857.0 | 20 |
| 4858.0 | 21 |
| 4859.0 | 22 |
| 4860.0 | 23 |
| 4861.0 | 22 |
| 4862.0 | 23 |
| 4863.0 | 24 |
| 4864.0 | 25 |
| 4865.0 | 26 |
| 4866.0 | 25 |
| 4867.0 | 26 |
| 4868.0 | 27 |
| 4869.0 | 28 |
| 4870.0 | 27 |
| 4871.0 | 28 |
| 4872.0 | 27 |
| 4873.0 | 28 |
| 4874.0 | 29 |
| 4875.0 | 28 |
| 4876.0 | 29 |
| 4877.0 | 30 |
| 4878.0 | 31 |
| 4879.0 | 32 |
| 4880.0 | 33 |
| 4881.0 | 32 |
| 4882.0 | 31 |
| 4883.0 | 32 |
| 4884.0 | 33 |
| 4885.0 | 32 |
| 4886.0 | 33 |
| 4887.0 | 34 |
| 4888.0 | 33 |
| 4889.0 | 32 |
| 4890.0 | 33 |
| 4891.0 | 34 |
| 4892.0 | 33 |
| 4893.0 | 34 |
| 4894.0 | 33 |
| 4895.0 | 34 |
| 4896.0 | 33 |
| 4897.0 | 34 |
| 4898.0 | 33 |
| 4899.0 | 32 |
| 4900.0 | 31 |
| 4901.0 | 32 |
| 4902.0 | 33 |
| 4903.0 | 32 |
| 4904.0 | 31 |
| 4905.0 | 30 |
| 4906.0 | 31 |
| 4907.0 | 30 |
| 4908.0 | 31 |
| 4909.0 | 32 |
| 4910.0 | 31 |
| 4911.0 | 30 |
| 4912.0 | 29 |
| 4913.0 | 30 |
| 4914.0 | 29 |
| 4915.0 | 28 |
| 4916.0 | 27 |
| 4917.0 | 26 |
| 4918.0 | 25 |
| 4919.0 | 26 |
| 4920.0 | 25 |
| 4921.0 | 26 |
| 4922.0 | 25 |
| 4923.0 | 26 |
| 4924.0 | 27 |
| 4925.0 | 28 |
| 4926.0 | 27 |
| 4927.0 | 26 |
| 4928.0 | 27 |
| 4929.0 | 26 |
| 4930.0 | 25 |
| 4931.0 | 24 |
| 4932.0 | 23 |
| 4933.0 | 22 |
| 4934.0 | 23 |
| 4935.0 | 22 |
| 4936.0 | 21 |
| 4937.0 | 20 |
| 4938.0 | 21 |
| 4939.0 | 20 |
| 4940.0 | 21 |
| 4941.0 | 22 |
| 4942.0 | 21 |
| 4943.0 | 22 |
| 4944.0 | 23 |
| 4945.0 | 22 |
| 4946.0 | 21 |
| 4947.0 | 20 |
| 4948.0 | 21 |
| 4949.0 | 20 |
| 4950.0 | 21 |
| 4951.0 | 22 |
| 4952.0 | 21 |
| 4953.0 | 20 |
| 4954.0 | 21 |
| 4955.0 | 22 |
| 4956.0 | 21 |
| 4957.0 | 22 |
| 4958.0 | 23 |
| 4959.0 | 24 |
| 4960.0 | 25 |
| 4961.0 | 26 |
| 4962.0 | 27 |
| 4963.0 | 26 |
| 4964.0 | 27 |
| 4965.0 | 26 |
| 4966.0 | 25 |
| 4967.0 | 24 |
| 4968.0 | 23 |
| 4969.0 | 22 |
| 4970.0 | 23 |
| 4971.0 | 24 |
| 4972.0 | 25 |
| 4973.0 | 24 |
| 4974.0 | 25 |
| 4975.0 | 26 |
| 4976.0 | 27 |
| 4977.0 | 28 |
| 4978.0 | 29 |
| 4979.0 | 28 |
| 4980.0 | 27 |
| 4981.0 | 28 |
| 4982.0 | 29 |
| 4983.0 | 28 |
| 4984.0 | 29 |
| 4985.0 | 28 |
| 4986.0 | 29 |
| 4987.0 | 30 |
| 4988.0 | 31 |
| 4989.0 | 32 |
| 4990.0 | 33 |
| 4991.0 | 34 |
| 4992.0 | 33 |
| 4993.0 | 32 |
| 4994.0 | 33 |
| 4995.0 | 32 |
| 4996.0 | 31 |
| 4997.0 | 30 |
| 4998.0 | 29 |
| 4999.0 | 28 |
| 5000.0 | 27 |
| 5001.0 | 26 |
| 5002.0 | 25 |
| 5003.0 | 24 |
| 5004.0 | 23 |
| 5005.0 | 24 |
| 5006.0 | 25 |
| 5007.0 | 26 |
| 5008.0 | 27 |
| 5009.0 | 28 |
| 5010.0 | 27 |
| 5011.0 | 28 |
| 5012.0 | 29 |
| 5013.0 | 28 |
| 5014.0 | 29 |
| 5015.0 | 30 |
| 5016.0 | 31 |
| 5017.0 | 32 |
| 5018.0 | 33 |
| 5019.0 | 32 |
| 5020.0 | 31 |
| 5021.0 | 32 |
| 5022.0 | 31 |
| 5023.0 | 32 |
| 5024.0 | 31 |
| 5025.0 | 30 |
| 5026.0 | 31 |
| 5027.0 | 30 |
| 5028.0 | 31 |
| 5029.0 | 32 |
| 5030.0 | 31 |
| 5031.0 | 32 |
| 5032.0 | 31 |
| 5033.0 | 30 |
| 5034.0 | 31 |
| 5035.0 | 32 |
| 5036.0 | 31 |
| 5037.0 | 30 |
| 5038.0 | 29 |
| 5039.0 | 30 |
| 5040.0 | 31 |
| 5041.0 | 32 |
| 5042.0 | 31 |
| 5043.0 | 30 |
| 5044.0 | 29 |
| 5045.0 | 28 |
| 5046.0 | 29 |
| 5047.0 | 30 |
| 5048.0 | 31 |
| 5049.0 | 30 |
| 5050.0 | 29 |
| 5051.0 | 30 |
| 5052.0 | 29 |
| 5053.0 | 28 |
| 5054.0 | 27 |
| 5055.0 | 26 |
| 5056.0 | 27 |
| 5057.0 | 28 |
| 5058.0 | 27 |
| 5059.0 | 26 |
| 5060.0 | 25 |
| 5061.0 | 24 |
| 5062.0 | 23 |
| 5063.0 | 22 |
| 5064.0 | 23 |
| 5065.0 | 24 |
| 5066.0 | 25 |
| 5067.0 | 26 |
| 5068.0 | 27 |
| 5069.0 | 28 |
| 5070.0 | 27 |
| 5071.0 | 28 |
| 5072.0 | 27 |
| 5073.0 | 26 |
| 5074.0 | 27 |
| 5075.0 | 28 |
| 5076.0 | 27 |
| 5077.0 | 26 |
| 5078.0 | 25 |
| 5079.0 | 26 |
| 5080.0 | 25 |
| 5081.0 | 26 |
| 5082.0 | 27 |
| 5083.0 | 26 |
| 5084.0 | 25 |
| 5085.0 | 26 |
| 5086.0 | 25 |
| 5087.0 | 26 |
| 5088.0 | 27 |
| 5089.0 | 28 |
| 5090.0 | 27 |
| 5091.0 | 28 |
| 5092.0 | 27 |
| 5093.0 | 28 |
| 5094.0 | 27 |
| 5095.0 | 26 |
| 5096.0 | 25 |
| 5097.0 | 24 |
| 5098.0 | 23 |
| 5099.0 | 22 |
| 5100.0 | 23 |
| 5101.0 | 22 |
| 5102.0 | 23 |
| 5103.0 | 22 |
| 5104.0 | 23 |
| 5105.0 | 22 |
| 5106.0 | 23 |
| 5107.0 | 24 |
| 5108.0 | 23 |
| 5109.0 | 22 |
| 5110.0 | 23 |
| 5111.0 | 22 |
| 5112.0 | 23 |
| 5113.0 | 24 |
| 5114.0 | 23 |
| 5115.0 | 24 |
| 5116.0 | 25 |
| 5117.0 | 24 |
| 5118.0 | 25 |
| 5119.0 | 24 |
| 5120.0 | 23 |
| 5121.0 | 24 |
| 5122.0 | 23 |
| 5123.0 | 22 |
| 5124.0 | 23 |
| 5125.0 | 22 |
| 5126.0 | 23 |
| 5127.0 | 22 |
| 5128.0 | 21 |
| 5129.0 | 22 |
| 5130.0 | 21 |
| 5131.0 | 22 |
| 5132.0 | 21 |
| 5133.0 | 22 |
| 5134.0 | 23 |
| 5135.0 | 22 |
| 5136.0 | 21 |
| 5137.0 | 22 |
| 5138.0 | 21 |
| 5139.0 | 22 |
| 5140.0 | 21 |
| 5141.0 | 22 |
| 5142.0 | 21 |
| 5143.0 | 20 |
| 5144.0 | 19 |
| 5145.0 | 18 |
| 5146.0 | 19 |
| 5147.0 | 18 |
| 5148.0 | 19 |
| 5149.0 | 20 |
| 5150.0 | 21 |
| 5151.0 | 22 |
| 5152.0 | 23 |
| 5153.0 | 22 |
| 5154.0 | 21 |
| 5155.0 | 22 |
| 5156.0 | 23 |
| 5157.0 | 24 |
| 5158.0 | 23 |
| 5159.0 | 24 |
| 5160.0 | 23 |
| 5161.0 | 22 |
| 5162.0 | 23 |
| 5163.0 | 24 |
| 5164.0 | 23 |
| 5165.0 | 24 |
| 5166.0 | 25 |
| 5167.0 | 26 |
| 5168.0 | 25 |
| 5169.0 | 24 |
| 5170.0 | 25 |
| 5171.0 | 26 |
| 5172.0 | 25 |
| 5173.0 | 24 |
| 5174.0 | 25 |
| 5175.0 | 24 |
| 5176.0 | 25 |
| 5177.0 | 24 |
| 5178.0 | 23 |
| 5179.0 | 22 |
| 5180.0 | 21 |
| 5181.0 | 22 |
| 5182.0 | 21 |
| 5183.0 | 20 |
| 5184.0 | 19 |
| 5185.0 | 18 |
| 5186.0 | 19 |
| 5187.0 | 20 |
| 5188.0 | 19 |
| 5189.0 | 18 |
| 5190.0 | 17 |
| 5191.0 | 16 |
| 5192.0 | 15 |
| 5193.0 | 16 |
| 5194.0 | 15 |
| 5195.0 | 14 |
| 5196.0 | 13 |
| 5197.0 | 14 |
| 5198.0 | 13 |
| 5199.0 | 12 |
| 5200.0 | 13 |
| 5201.0 | 14 |
| 5202.0 | 15 |
| 5203.0 | 16 |
| 5204.0 | 15 |
| 5205.0 | 16 |
| 5206.0 | 17 |
| 5207.0 | 16 |
| 5208.0 | 15 |
| 5209.0 | 14 |
| 5210.0 | 15 |
| 5211.0 | 16 |
| 5212.0 | 15 |
| 5213.0 | 16 |
| 5214.0 | 15 |
| 5215.0 | 14 |
| 5216.0 | 15 |
| 5217.0 | 16 |
| 5218.0 | 15 |
| 5219.0 | 16 |
| 5220.0 | 15 |
| 5221.0 | 16 |
| 5222.0 | 17 |
| 5223.0 | 16 |
| 5224.0 | 17 |
| 5225.0 | 16 |
| 5226.0 | 15 |
| 5227.0 | 14 |
| 5228.0 | 13 |
| 5229.0 | 14 |
| 5230.0 | 15 |
| 5231.0 | 14 |
| 5232.0 | 15 |
| 5233.0 | 16 |
| 5234.0 | 15 |
| 5235.0 | 14 |
| 5236.0 | 15 |
| 5237.0 | 16 |
| 5238.0 | 17 |
| 5239.0 | 18 |
| 5240.0 | 17 |
| 5241.0 | 18 |
| 5242.0 | 17 |
| 5243.0 | 16 |
| 5244.0 | 17 |
| 5245.0 | 16 |
| 5246.0 | 17 |
| 5247.0 | 16 |
| 5248.0 | 17 |
| 5249.0 | 18 |
| 5250.0 | 19 |
| 5251.0 | 18 |
| 5252.0 | 17 |
| 5253.0 | 18 |
| 5254.0 | 17 |
| 5255.0 | 16 |
| 5256.0 | 17 |
| 5257.0 | 18 |
| 5258.0 | 19 |
| 5259.0 | 20 |
| 5260.0 | 19 |
| 5261.0 | 18 |
| 5262.0 | 17 |
| 5263.0 | 16 |
| 5264.0 | 15 |
| 5265.0 | 14 |
| 5266.0 | 15 |
| 5267.0 | 16 |
| 5268.0 | 17 |
| 5269.0 | 18 |
| 5270.0 | 17 |
| 5271.0 | 18 |
| 5272.0 | 19 |
| 5273.0 | 20 |
| 5274.0 | 19 |
| 5275.0 | 18 |
| 5276.0 | 17 |
| 5277.0 | 18 |
| 5278.0 | 19 |
| 5279.0 | 20 |
| 5280.0 | 19 |
| 5281.0 | 18 |
| 5282.0 | 17 |
| 5283.0 | 16 |
| 5284.0 | 17 |
| 5285.0 | 18 |
| 5286.0 | 17 |
| 5287.0 | 18 |
| 5288.0 | 19 |
| 5289.0 | 18 |
| 5290.0 | 19 |
| 5291.0 | 18 |
| 5292.0 | 17 |
| 5293.0 | 16 |
| 5294.0 | 17 |
| 5295.0 | 18 |
| 5296.0 | 19 |
| 5297.0 | 18 |
| 5298.0 | 17 |
| 5299.0 | 18 |
| 5300.0 | 19 |
| 5301.0 | 18 |
| 5302.0 | 17 |
| 5303.0 | 16 |
| 5304.0 | 17 |
| 5305.0 | 18 |
| 5306.0 | 17 |
| 5307.0 | 18 |
| 5308.0 | 17 |
| 5309.0 | 18 |
| 5310.0 | 17 |
| 5311.0 | 16 |
| 5312.0 | 15 |
| 5313.0 | 16 |
| 5314.0 | 17 |
| 5315.0 | 18 |
| 5316.0 | 19 |
| 5317.0 | 18 |
| 5318.0 | 19 |
| 5319.0 | 20 |
| 5320.0 | 21 |
| 5321.0 | 20 |
| 5322.0 | 21 |
| 5323.0 | 20 |
| 5324.0 | 21 |
| 5325.0 | 22 |
| 5326.0 | 23 |
| 5327.0 | 24 |
| 5328.0 | 25 |
| 5329.0 | 26 |
| 5330.0 | 25 |
| 5331.0 | 24 |
| 5332.0 | 23 |
| 5333.0 | 22 |
| 5334.0 | 23 |
| 5335.0 | 22 |
| 5336.0 | 23 |
| 5337.0 | 22 |
| 5338.0 | 23 |
| 5339.0 | 24 |
| 5340.0 | 23 |
| 5341.0 | 24 |
| 5342.0 | 23 |
| 5343.0 | 24 |
| 5344.0 | 23 |
| 5345.0 | 22 |
| 5346.0 | 21 |
| 5347.0 | 22 |
| 5348.0 | 23 |
| 5349.0 | 24 |
| 5350.0 | 23 |
| 5351.0 | 22 |
| 5352.0 | 23 |
| 5353.0 | 22 |
| 5354.0 | 21 |
| 5355.0 | 22 |
| 5356.0 | 23 |
| 5357.0 | 24 |
| 5358.0 | 25 |
| 5359.0 | 24 |
| 5360.0 | 25 |
| 5361.0 | 26 |
| 5362.0 | 27 |
| 5363.0 | 28 |
| 5364.0 | 27 |
| 5365.0 | 28 |
| 5366.0 | 29 |
| 5367.0 | 30 |
| 5368.0 | 31 |
| 5369.0 | 30 |
| 5370.0 | 29 |
| 5371.0 | 30 |
| 5372.0 | 31 |
| 5373.0 | 32 |
| 5374.0 | 31 |
| 5375.0 | 30 |
| 5376.0 | 31 |
| 5377.0 | 32 |
| 5378.0 | 33 |
| 5379.0 | 32 |
| 5380.0 | 31 |
| 5381.0 | 32 |
| 5382.0 | 33 |
| 5383.0 | 32 |
| 5384.0 | 33 |
| 5385.0 | 34 |
| 5386.0 | 35 |
| 5387.0 | 34 |
| 5388.0 | 35 |
| 5389.0 | 34 |
| 5390.0 | 35 |
| 5391.0 | 34 |
| 5392.0 | 33 |
| 5393.0 | 34 |
| 5394.0 | 35 |
| 5395.0 | 34 |
| 5396.0 | 33 |
| 5397.0 | 34 |
| 5398.0 | 33 |
| 5399.0 | 34 |
| 5400.0 | 33 |
| 5401.0 | 34 |
| 5402.0 | 35 |
| 5403.0 | 36 |
| 5404.0 | 37 |
| 5405.0 | 36 |
| 5406.0 | 37 |
| 5407.0 | 38 |
| 5408.0 | 37 |
| 5409.0 | 36 |
| 5410.0 | 35 |
| 5411.0 | 36 |
| 5412.0 | 35 |
| 5413.0 | 36 |
| 5414.0 | 35 |
| 5415.0 | 36 |
| 5416.0 | 37 |
| 5417.0 | 36 |
| 5418.0 | 37 |
| 5419.0 | 38 |
| 5420.0 | 39 |
| 5421.0 | 38 |
| 5422.0 | 37 |
| 5423.0 | 36 |
| 5424.0 | 35 |
| 5425.0 | 36 |
| 5426.0 | 37 |
| 5427.0 | 36 |
| 5428.0 | 37 |
| 5429.0 | 38 |
| 5430.0 | 37 |
| 5431.0 | 36 |
| 5432.0 | 37 |
| 5433.0 | 38 |
| 5434.0 | 39 |
| 5435.0 | 40 |
| 5436.0 | 41 |
| 5437.0 | 40 |
| 5438.0 | 39 |
| 5439.0 | 38 |
| 5440.0 | 37 |
| 5441.0 | 36 |
| 5442.0 | 37 |
| 5443.0 | 36 |
| 5444.0 | 37 |
| 5445.0 | 38 |
| 5446.0 | 37 |
| 5447.0 | 38 |
| 5448.0 | 37 |
| 5449.0 | 36 |
| 5450.0 | 35 |
| 5451.0 | 34 |
| 5452.0 | 33 |
| 5453.0 | 32 |
| 5454.0 | 31 |
| 5455.0 | 30 |
| 5456.0 | 29 |
| 5457.0 | 30 |
| 5458.0 | 29 |
| 5459.0 | 30 |
| 5460.0 | 31 |
| 5461.0 | 32 |
| 5462.0 | 31 |
| 5463.0 | 32 |
| 5464.0 | 31 |
| 5465.0 | 30 |
| 5466.0 | 29 |
| 5467.0 | 30 |
| 5468.0 | 31 |
| 5469.0 | 32 |
| 5470.0 | 33 |
| 5471.0 | 34 |
| 5472.0 | 33 |
| 5473.0 | 34 |
| 5474.0 | 35 |
| 5475.0 | 36 |
| 5476.0 | 37 |
| 5477.0 | 38 |
| 5478.0 | 37 |
| 5479.0 | 36 |
| 5480.0 | 35 |
| 5481.0 | 34 |
| 5482.0 | 35 |
| 5483.0 | 34 |
| 5484.0 | 33 |
| 5485.0 | 34 |
| 5486.0 | 35 |
| 5487.0 | 34 |
| 5488.0 | 35 |
| 5489.0 | 34 |
| 5490.0 | 35 |
| 5491.0 | 34 |
| 5492.0 | 35 |
| 5493.0 | 36 |
| 5494.0 | 37 |
| 5495.0 | 36 |
| 5496.0 | 35 |
| 5497.0 | 36 |
| 5498.0 | 35 |
| 5499.0 | 34 |
| 5500.0 | 35 |
| 5501.0 | 36 |
| 5502.0 | 35 |
| 5503.0 | 34 |
| 5504.0 | 35 |
| 5505.0 | 34 |
| 5506.0 | 35 |
| 5507.0 | 34 |
| 5508.0 | 33 |
| 5509.0 | 32 |
| 5510.0 | 33 |
| 5511.0 | 32 |
| 5512.0 | 33 |
| 5513.0 | 34 |
| 5514.0 | 33 |
| 5515.0 | 34 |
| 5516.0 | 33 |
| 5517.0 | 34 |
| 5518.0 | 35 |
| 5519.0 | 36 |
| 5520.0 | 35 |
| 5521.0 | 34 |
| 5522.0 | 33 |
| 5523.0 | 34 |
| 5524.0 | 35 |
| 5525.0 | 36 |
| 5526.0 | 37 |
| 5527.0 | 38 |
| 5528.0 | 39 |
| 5529.0 | 38 |
| 5530.0 | 39 |
| 5531.0 | 38 |
| 5532.0 | 39 |
| 5533.0 | 38 |
| 5534.0 | 37 |
| 5535.0 | 38 |
| 5536.0 | 39 |
| 5537.0 | 40 |
| 5538.0 | 41 |
| 5539.0 | 40 |
| 5540.0 | 39 |
| 5541.0 | 38 |
| 5542.0 | 39 |
| 5543.0 | 38 |
| 5544.0 | 39 |
| 5545.0 | 38 |
| 5546.0 | 39 |
| 5547.0 | 38 |
| 5548.0 | 39 |
| 5549.0 | 40 |
| 5550.0 | 41 |
| 5551.0 | 42 |
| 5552.0 | 41 |
| 5553.0 | 40 |
| 5554.0 | 39 |
| 5555.0 | 38 |
| 5556.0 | 37 |
| 5557.0 | 38 |
| 5558.0 | 37 |
| 5559.0 | 38 |
| 5560.0 | 39 |
| 5561.0 | 40 |
| 5562.0 | 41 |
| 5563.0 | 42 |
| 5564.0 | 41 |
| 5565.0 | 40 |
| 5566.0 | 39 |
| 5567.0 | 40 |
| 5568.0 | 39 |
| 5569.0 | 40 |
| 5570.0 | 41 |
| 5571.0 | 42 |
| 5572.0 | 41 |
| 5573.0 | 40 |
| 5574.0 | 39 |
| 5575.0 | 38 |
| 5576.0 | 37 |
| 5577.0 | 38 |
| 5578.0 | 39 |
| 5579.0 | 38 |
| 5580.0 | 39 |
| 5581.0 | 40 |
| 5582.0 | 39 |
| 5583.0 | 38 |
| 5584.0 | 39 |
| 5585.0 | 38 |
| 5586.0 | 37 |
| 5587.0 | 38 |
| 5588.0 | 37 |
| 5589.0 | 38 |
| 5590.0 | 37 |
| 5591.0 | 38 |
| 5592.0 | 37 |
| 5593.0 | 36 |
| 5594.0 | 37 |
| 5595.0 | 38 |
| 5596.0 | 39 |
| 5597.0 | 38 |
| 5598.0 | 37 |
| 5599.0 | 36 |
| 5600.0 | 37 |
| 5601.0 | 38 |
| 5602.0 | 37 |
| 5603.0 | 36 |
| 5604.0 | 37 |
| 5605.0 | 36 |
| 5606.0 | 35 |
| 5607.0 | 36 |
| 5608.0 | 35 |
| 5609.0 | 34 |
| 5610.0 | 35 |
| 5611.0 | 34 |
| 5612.0 | 33 |
| 5613.0 | 32 |
| 5614.0 | 33 |
| 5615.0 | 34 |
| 5616.0 | 33 |
| 5617.0 | 34 |
| 5618.0 | 35 |
| 5619.0 | 34 |
| 5620.0 | 35 |
| 5621.0 | 34 |
| 5622.0 | 35 |
| 5623.0 | 36 |
| 5624.0 | 37 |
| 5625.0 | 38 |
| 5626.0 | 39 |
| 5627.0 | 40 |
| 5628.0 | 41 |
| 5629.0 | 40 |
| 5630.0 | 41 |
| 5631.0 | 40 |
| 5632.0 | 39 |
| 5633.0 | 40 |
| 5634.0 | 39 |
| 5635.0 | 38 |
| 5636.0 | 39 |
| 5637.0 | 40 |
| 5638.0 | 41 |
| 5639.0 | 40 |
| 5640.0 | 39 |
| 5641.0 | 40 |
| 5642.0 | 39 |
| 5643.0 | 40 |
| 5644.0 | 39 |
| 5645.0 | 38 |
| 5646.0 | 37 |
| 5647.0 | 38 |
| 5648.0 | 37 |
| 5649.0 | 36 |
| 5650.0 | 35 |
| 5651.0 | 34 |
| 5652.0 | 33 |
| 5653.0 | 32 |
| 5654.0 | 33 |
| 5655.0 | 34 |
| 5656.0 | 33 |
| 5657.0 | 34 |
| 5658.0 | 33 |
| 5659.0 | 34 |
| 5660.0 | 33 |
| 5661.0 | 32 |
| 5662.0 | 31 |
| 5663.0 | 30 |
| 5664.0 | 29 |
| 5665.0 | 28 |
| 5666.0 | 27 |
| 5667.0 | 26 |
| 5668.0 | 27 |
| 5669.0 | 28 |
| 5670.0 | 29 |
| 5671.0 | 28 |
| 5672.0 | 29 |
| 5673.0 | 28 |
| 5674.0 | 29 |
| 5675.0 | 30 |
| 5676.0 | 31 |
| 5677.0 | 30 |
| 5678.0 | 29 |
| 5679.0 | 30 |
| 5680.0 | 29 |
| 5681.0 | 28 |
| 5682.0 | 27 |
| 5683.0 | 26 |
| 5684.0 | 27 |
| 5685.0 | 28 |
| 5686.0 | 29 |
| 5687.0 | 30 |
| 5688.0 | 29 |
| 5689.0 | 28 |
| 5690.0 | 27 |
| 5691.0 | 26 |
| 5692.0 | 25 |
| 5693.0 | 24 |
| 5694.0 | 23 |
| 5695.0 | 22 |
| 5696.0 | 23 |
| 5697.0 | 22 |
| 5698.0 | 21 |
| 5699.0 | 22 |
| 5700.0 | 23 |
| 5701.0 | 22 |
| 5702.0 | 21 |
| 5703.0 | 22 |
| 5704.0 | 23 |
| 5705.0 | 22 |
| 5706.0 | 21 |
| 5707.0 | 22 |
| 5708.0 | 23 |
| 5709.0 | 24 |
| 5710.0 | 23 |
| 5711.0 | 22 |
| 5712.0 | 23 |
| 5713.0 | 22 |
| 5714.0 | 21 |
| 5715.0 | 22 |
| 5716.0 | 21 |
| 5717.0 | 20 |
| 5718.0 | 21 |
| 5719.0 | 20 |
| 5720.0 | 21 |
| 5721.0 | 20 |
| 5722.0 | 19 |
| 5723.0 | 20 |
| 5724.0 | 19 |
| 5725.0 | 18 |
| 5726.0 | 17 |
| 5727.0 | 16 |
| 5728.0 | 17 |
| 5729.0 | 16 |
| 5730.0 | 17 |
| 5731.0 | 18 |
| 5732.0 | 19 |
| 5733.0 | 20 |
| 5734.0 | 19 |
| 5735.0 | 20 |
| 5736.0 | 21 |
| 5737.0 | 22 |
| 5738.0 | 23 |
| 5739.0 | 24 |
| 5740.0 | 23 |
| 5741.0 | 22 |
| 5742.0 | 21 |
| 5743.0 | 22 |
| 5744.0 | 21 |
| 5745.0 | 20 |
| 5746.0 | 21 |
| 5747.0 | 22 |
| 5748.0 | 21 |
| 5749.0 | 20 |
| 5750.0 | 21 |
| 5751.0 | 22 |
| 5752.0 | 21 |
| 5753.0 | 22 |
| 5754.0 | 21 |
| 5755.0 | 20 |
| 5756.0 | 21 |
| 5757.0 | 20 |
| 5758.0 | 19 |
| 5759.0 | 20 |
| 5760.0 | 19 |
| 5761.0 | 20 |
| 5762.0 | 21 |
| 5763.0 | 22 |
| 5764.0 | 23 |
| 5765.0 | 22 |
| 5766.0 | 23 |
| 5767.0 | 22 |
| 5768.0 | 23 |
| 5769.0 | 22 |
| 5770.0 | 23 |
| 5771.0 | 24 |
| 5772.0 | 25 |
| 5773.0 | 26 |
| 5774.0 | 27 |
| 5775.0 | 26 |
| 5776.0 | 25 |
| 5777.0 | 26 |
| 5778.0 | 27 |
| 5779.0 | 26 |
| 5780.0 | 27 |
| 5781.0 | 26 |
| 5782.0 | 27 |
| 5783.0 | 26 |
| 5784.0 | 25 |
| 5785.0 | 24 |
| 5786.0 | 25 |
| 5787.0 | 24 |
| 5788.0 | 23 |
| 5789.0 | 24 |
| 5790.0 | 23 |
| 5791.0 | 24 |
| 5792.0 | 23 |
| 5793.0 | 22 |
| 5794.0 | 23 |
| 5795.0 | 24 |
| 5796.0 | 23 |
| 5797.0 | 24 |
| 5798.0 | 25 |
| 5799.0 | 24 |
| 5800.0 | 23 |
| 5801.0 | 22 |
| 5802.0 | 21 |
| 5803.0 | 20 |
| 5804.0 | 19 |
| 5805.0 | 20 |
| 5806.0 | 21 |
| 5807.0 | 22 |
| 5808.0 | 21 |
| 5809.0 | 22 |
| 5810.0 | 23 |
| 5811.0 | 24 |
| 5812.0 | 25 |
| 5813.0 | 24 |
| 5814.0 | 23 |
| 5815.0 | 24 |
| 5816.0 | 25 |
| 5817.0 | 26 |
| 5818.0 | 27 |
| 5819.0 | 26 |
| 5820.0 | 27 |
| 5821.0 | 28 |
| 5822.0 | 27 |
| 5823.0 | 28 |
| 5824.0 | 27 |
| 5825.0 | 28 |
| 5826.0 | 29 |
| 5827.0 | 30 |
| 5828.0 | 31 |
| 5829.0 | 32 |
| 5830.0 | 31 |
| 5831.0 | 32 |
| 5832.0 | 31 |
| 5833.0 | 30 |
| 5834.0 | 31 |
| 5835.0 | 30 |
| 5836.0 | 29 |
| 5837.0 | 28 |
| 5838.0 | 29 |
| 5839.0 | 28 |
| 5840.0 | 27 |
| 5841.0 | 28 |
| 5842.0 | 27 |
| 5843.0 | 26 |
| 5844.0 | 27 |
| 5845.0 | 26 |
| 5846.0 | 27 |
| 5847.0 | 26 |
| 5848.0 | 27 |
| 5849.0 | 28 |
| 5850.0 | 29 |
| 5851.0 | 28 |
| 5852.0 | 29 |
| 5853.0 | 28 |
| 5854.0 | 27 |
| 5855.0 | 26 |
| 5856.0 | 25 |
| 5857.0 | 24 |
| 5858.0 | 23 |
| 5859.0 | 22 |
| 5860.0 | 23 |
| 5861.0 | 22 |
| 5862.0 | 23 |
| 5863.0 | 22 |
| 5864.0 | 23 |
| 5865.0 | 22 |
| 5866.0 | 21 |
| 5867.0 | 20 |
| 5868.0 | 21 |
| 5869.0 | 22 |
| 5870.0 | 23 |
| 5871.0 | 24 |
| 5872.0 | 25 |
| 5873.0 | 26 |
| 5874.0 | 27 |
| 5875.0 | 26 |
| 5876.0 | 25 |
| 5877.0 | 24 |
| 5878.0 | 25 |
| 5879.0 | 26 |
| 5880.0 | 25 |
| 5881.0 | 26 |
| 5882.0 | 27 |
| 5883.0 | 26 |
| 5884.0 | 27 |
| 5885.0 | 26 |
| 5886.0 | 27 |
| 5887.0 | 28 |
| 5888.0 | 29 |
| 5889.0 | 30 |
| 5890.0 | 31 |
| 5891.0 | 30 |
| 5892.0 | 29 |
| 5893.0 | 28 |
| 5894.0 | 27 |
| 5895.0 | 28 |
| 5896.0 | 29 |
| 5897.0 | 30 |
| 5898.0 | 31 |
| 5899.0 | 32 |
| 5900.0 | 31 |
| 5901.0 | 32 |
| 5902.0 | 31 |
| 5903.0 | 30 |
| 5904.0 | 29 |
| 5905.0 | 28 |
| 5906.0 | 29 |
| 5907.0 | 30 |
| 5908.0 | 31 |
| 5909.0 | 30 |
| 5910.0 | 29 |
| 5911.0 | 30 |
| 5912.0 | 31 |
| 5913.0 | 30 |
| 5914.0 | 29 |
| 5915.0 | 28 |
| 5916.0 | 29 |
| 5917.0 | 28 |
| 5918.0 | 27 |
| 5919.0 | 26 |
| 5920.0 | 27 |
| 5921.0 | 28 |
| 5922.0 | 27 |
| 5923.0 | 28 |
| 5924.0 | 27 |
| 5925.0 | 26 |
| 5926.0 | 25 |
| 5927.0 | 24 |
| 5928.0 | 23 |
| 5929.0 | 24 |
| 5930.0 | 25 |
| 5931.0 | 24 |
| 5932.0 | 25 |
| 5933.0 | 24 |
| 5934.0 | 25 |
| 5935.0 | 26 |
| 5936.0 | 27 |
| 5937.0 | 28 |
| 5938.0 | 29 |
| 5939.0 | 30 |
| 5940.0 | 31 |
| 5941.0 | 32 |
| 5942.0 | 31 |
| 5943.0 | 32 |
| 5944.0 | 33 |
| 5945.0 | 32 |
| 5946.0 | 33 |
| 5947.0 | 34 |
| 5948.0 | 33 |
| 5949.0 | 32 |
| 5950.0 | 31 |
| 5951.0 | 30 |
| 5952.0 | 29 |
| 5953.0 | 28 |
| 5954.0 | 29 |
| 5955.0 | 28 |
| 5956.0 | 27 |
| 5957.0 | 26 |
| 5958.0 | 27 |
| 5959.0 | 28 |
| 5960.0 | 27 |
| 5961.0 | 26 |
| 5962.0 | 25 |
| 5963.0 | 26 |
| 5964.0 | 25 |
| 5965.0 | 26 |
| 5966.0 | 25 |
| 5967.0 | 26 |
| 5968.0 | 25 |
| 5969.0 | 26 |
| 5970.0 | 25 |
| 5971.0 | 26 |
| 5972.0 | 25 |
| 5973.0 | 26 |
| 5974.0 | 25 |
| 5975.0 | 26 |
| 5976.0 | 27 |
| 5977.0 | 26 |
| 5978.0 | 25 |
| 5979.0 | 24 |
| 5980.0 | 23 |
| 5981.0 | 24 |
| 5982.0 | 25 |
| 5983.0 | 26 |
| 5984.0 | 25 |
| 5985.0 | 24 |
| 5986.0 | 25 |
| 5987.0 | 26 |
| 5988.0 | 25 |
| 5989.0 | 24 |
| 5990.0 | 23 |
| 5991.0 | 24 |
| 5992.0 | 23 |
| 5993.0 | 22 |
| 5994.0 | 23 |
| 5995.0 | 24 |
| 5996.0 | 25 |
| 5997.0 | 26 |
| 5998.0 | 25 |
| 5999.0 | 24 |
| 6000.0 | 25 |
| 6001.0 | 24 |
| 6002.0 | 23 |
| 6003.0 | 22 |
| 6004.0 | 21 |
| 6005.0 | 22 |
| 6006.0 | 21 |
| 6007.0 | 20 |
| 6008.0 | 19 |
| 6009.0 | 20 |
| 6010.0 | 21 |
| 6011.0 | 20 |
| 6012.0 | 21 |
| 6013.0 | 20 |
| 6014.0 | 19 |
| 6015.0 | 20 |
| 6016.0 | 19 |
| 6017.0 | 18 |
| 6018.0 | 19 |
| 6019.0 | 20 |
| 6020.0 | 19 |
| 6021.0 | 18 |
| 6022.0 | 19 |
| 6023.0 | 18 |
| 6024.0 | 19 |
| 6025.0 | 18 |
| 6026.0 | 17 |
| 6027.0 | 16 |
| 6028.0 | 17 |
| 6029.0 | 18 |
| 6030.0 | 19 |
| 6031.0 | 20 |
| 6032.0 | 21 |
| 6033.0 | 22 |
| 6034.0 | 23 |
| 6035.0 | 24 |
| 6036.0 | 23 |
| 6037.0 | 22 |
| 6038.0 | 21 |
| 6039.0 | 20 |
| 6040.0 | 19 |
| 6041.0 | 18 |
| 6042.0 | 17 |
| 6043.0 | 16 |
| 6044.0 | 17 |
| 6045.0 | 18 |
| 6046.0 | 19 |
| 6047.0 | 18 |
| 6048.0 | 19 |
| 6049.0 | 20 |
| 6050.0 | 21 |
| 6051.0 | 22 |
| 6052.0 | 23 |
| 6053.0 | 22 |
| 6054.0 | 23 |
| 6055.0 | 24 |
| 6056.0 | 23 |
| 6057.0 | 24 |
| 6058.0 | 23 |
| 6059.0 | 24 |
| 6060.0 | 23 |
| 6061.0 | 22 |
| 6062.0 | 21 |
| 6063.0 | 20 |
| 6064.0 | 21 |
| 6065.0 | 20 |
| 6066.0 | 21 |
| 6067.0 | 22 |
| 6068.0 | 23 |
| 6069.0 | 24 |
| 6070.0 | 23 |
| 6071.0 | 24 |
| 6072.0 | 23 |
| 6073.0 | 24 |
| 6074.0 | 23 |
| 6075.0 | 22 |
| 6076.0 | 23 |
| 6077.0 | 22 |
| 6078.0 | 21 |
| 6079.0 | 22 |
| 6080.0 | 21 |
| 6081.0 | 20 |
| 6082.0 | 21 |
| 6083.0 | 22 |
| 6084.0 | 21 |
| 6085.0 | 22 |
| 6086.0 | 21 |
| 6087.0 | 22 |
| 6088.0 | 23 |
| 6089.0 | 22 |
| 6090.0 | 23 |
| 6091.0 | 24 |
| 6092.0 | 25 |
| 6093.0 | 26 |
| 6094.0 | 25 |
| 6095.0 | 26 |
| 6096.0 | 27 |
| 6097.0 | 28 |
| 6098.0 | 27 |
| 6099.0 | 26 |
| 6100.0 | 27 |
| 6101.0 | 28 |
| 6102.0 | 29 |
| 6103.0 | 28 |
| 6104.0 | 29 |
| 6105.0 | 30 |
| 6106.0 | 29 |
| 6107.0 | 28 |
| 6108.0 | 27 |
| 6109.0 | 26 |
| 6110.0 | 25 |
| 6111.0 | 26 |
| 6112.0 | 27 |
| 6113.0 | 28 |
| 6114.0 | 29 |
| 6115.0 | 28 |
| 6116.0 | 29 |
| 6117.0 | 28 |
| 6118.0 | 29 |
| 6119.0 | 30 |
| 6120.0 | 29 |
| 6121.0 | 28 |
| 6122.0 | 27 |
| 6123.0 | 28 |
| 6124.0 | 29 |
| 6125.0 | 30 |
| 6126.0 | 29 |
| 6127.0 | 30 |
| 6128.0 | 29 |
| 6129.0 | 30 |
| 6130.0 | 29 |
| 6131.0 | 30 |
| 6132.0 | 31 |
| 6133.0 | 30 |
| 6134.0 | 29 |
| 6135.0 | 30 |
| 6136.0 | 29 |
| 6137.0 | 30 |
| 6138.0 | 29 |
| 6139.0 | 28 |
| 6140.0 | 27 |
| 6141.0 | 26 |
| 6142.0 | 25 |
| 6143.0 | 24 |
| 6144.0 | 23 |
| 6145.0 | 24 |
| 6146.0 | 23 |
| 6147.0 | 22 |
| 6148.0 | 23 |
| 6149.0 | 24 |
| 6150.0 | 25 |
| 6151.0 | 24 |
| 6152.0 | 23 |
| 6153.0 | 24 |
| 6154.0 | 23 |
| 6155.0 | 24 |
| 6156.0 | 23 |
| 6157.0 | 22 |
| 6158.0 | 23 |
| 6159.0 | 24 |
| 6160.0 | 23 |
| 6161.0 | 22 |
| 6162.0 | 21 |
| 6163.0 | 22 |
| 6164.0 | 23 |
| 6165.0 | 22 |
| 6166.0 | 21 |
| 6167.0 | 22 |
| 6168.0 | 21 |
| 6169.0 | 22 |
| 6170.0 | 23 |
| 6171.0 | 22 |
| 6172.0 | 23 |
| 6173.0 | 22 |
| 6174.0 | 23 |
| 6175.0 | 24 |
| 6176.0 | 25 |
| 6177.0 | 26 |
| 6178.0 | 25 |
| 6179.0 | 26 |
| 6180.0 | 25 |
| 6181.0 | 26 |
| 6182.0 | 25 |
| 6183.0 | 24 |
| 6184.0 | 25 |
| 6185.0 | 24 |
| 6186.0 | 25 |
| 6187.0 | 24 |
| 6188.0 | 23 |
| 6189.0 | 22 |
| 6190.0 | 21 |
| 6191.0 | 22 |
| 6192.0 | 23 |
| 6193.0 | 24 |
| 6194.0 | 25 |
| 6195.0 | 26 |
| 6196.0 | 25 |
| 6197.0 | 26 |
| 6198.0 | 27 |
| 6199.0 | 26 |
| 6200.0 | 25 |
| 6201.0 | 24 |
| 6202.0 | 23 |
| 6203.0 | 22 |
| 6204.0 | 23 |
| 6205.0 | 22 |
| 6206.0 | 21 |
| 6207.0 | 20 |
| 6208.0 | 21 |
| 6209.0 | 20 |
| 6210.0 | 19 |
| 6211.0 | 20 |
| 6212.0 | 21 |
| 6213.0 | 22 |
| 6214.0 | 23 |
| 6215.0 | 22 |
| 6216.0 | 23 |
| 6217.0 | 24 |
| 6218.0 | 23 |
| 6219.0 | 22 |
| 6220.0 | 23 |
| 6221.0 | 22 |
| 6222.0 | 23 |
| 6223.0 | 24 |
| 6224.0 | 23 |
| 6225.0 | 22 |
| 6226.0 | 23 |
| 6227.0 | 22 |
| 6228.0 | 23 |
| 6229.0 | 24 |
| 6230.0 | 23 |
| 6231.0 | 24 |
| 6232.0 | 23 |
| 6233.0 | 22 |
| 6234.0 | 21 |
| 6235.0 | 22 |
| 6236.0 | 21 |
| 6237.0 | 20 |
| 6238.0 | 21 |
| 6239.0 | 20 |
| 6240.0 | 19 |
| 6241.0 | 20 |
| 6242.0 | 21 |
| 6243.0 | 22 |
| 6244.0 | 23 |
| 6245.0 | 22 |
| 6246.0 | 23 |
| 6247.0 | 22 |
| 6248.0 | 23 |
| 6249.0 | 22 |
| 6250.0 | 21 |
| 6251.0 | 20 |
| 6252.0 | 19 |
| 6253.0 | 20 |
| 6254.0 | 19 |
| 6255.0 | 18 |
| 6256.0 | 17 |
| 6257.0 | 18 |
| 6258.0 | 19 |
| 6259.0 | 18 |
| 6260.0 | 17 |
| 6261.0 | 18 |
| 6262.0 | 19 |
| 6263.0 | 18 |
| 6264.0 | 19 |
| 6265.0 | 20 |
| 6266.0 | 19 |
| 6267.0 | 18 |
| 6268.0 | 17 |
| 6269.0 | 18 |
| 6270.0 | 17 |
| 6271.0 | 16 |
| 6272.0 | 17 |
| 6273.0 | 16 |
| 6274.0 | 15 |
| 6275.0 | 14 |
| 6276.0 | 13 |
| 6277.0 | 14 |
| 6278.0 | 13 |
| 6279.0 | 14 |
| 6280.0 | 13 |
| 6281.0 | 12 |
| 6282.0 | 13 |
| 6283.0 | 14 |
| 6284.0 | 13 |
| 6285.0 | 12 |
| 6286.0 | 11 |
| 6287.0 | 12 |
| 6288.0 | 13 |
| 6289.0 | 14 |
| 6290.0 | 13 |
| 6291.0 | 12 |
| 6292.0 | 13 |
| 6293.0 | 12 |
| 6294.0 | 11 |
| 6295.0 | 12 |
| 6296.0 | 11 |
| 6297.0 | 12 |
| 6298.0 | 11 |
| 6299.0 | 10 |
| 6300.0 | 11 |
| 6301.0 | 12 |
| 6302.0 | 13 |
| 6303.0 | 14 |
| 6304.0 | 15 |
| 6305.0 | 16 |
| 6306.0 | 15 |
| 6307.0 | 14 |
| 6308.0 | 13 |
| 6309.0 | 14 |
| 6310.0 | 13 |
| 6311.0 | 12 |
| 6312.0 | 13 |
| 6313.0 | 14 |
| 6314.0 | 15 |
| 6315.0 | 14 |
| 6316.0 | 15 |
| 6317.0 | 14 |
| 6318.0 | 13 |
| 6319.0 | 12 |
| 6320.0 | 13 |
| 6321.0 | 14 |
| 6322.0 | 13 |
| 6323.0 | 14 |
| 6324.0 | 13 |
| 6325.0 | 12 |
| 6326.0 | 13 |
| 6327.0 | 14 |
| 6328.0 | 15 |
| 6329.0 | 16 |
| 6330.0 | 17 |
| 6331.0 | 18 |
| 6332.0 | 19 |
| 6333.0 | 18 |
| 6334.0 | 19 |
| 6335.0 | 18 |
| 6336.0 | 19 |
| 6337.0 | 20 |
| 6338.0 | 21 |
| 6339.0 | 22 |
| 6340.0 | 23 |
| 6341.0 | 22 |
| 6342.0 | 21 |
| 6343.0 | 20 |
| 6344.0 | 19 |
| 6345.0 | 18 |
| 6346.0 | 17 |
| 6347.0 | 16 |
| 6348.0 | 17 |
| 6349.0 | 18 |
| 6350.0 | 17 |
| 6351.0 | 16 |
| 6352.0 | 17 |
| 6353.0 | 16 |
| 6354.0 | 17 |
| 6355.0 | 18 |
| 6356.0 | 19 |
| 6357.0 | 20 |
| 6358.0 | 19 |
| 6359.0 | 20 |
| 6360.0 | 19 |
| 6361.0 | 20 |
| 6362.0 | 19 |
| 6363.0 | 18 |
| 6364.0 | 17 |
| 6365.0 | 16 |
| 6366.0 | 17 |
| 6367.0 | 18 |
| 6368.0 | 19 |
| 6369.0 | 18 |
| 6370.0 | 19 |
| 6371.0 | 20 |
| 6372.0 | 19 |
| 6373.0 | 18 |
| 6374.0 | 17 |
| 6375.0 | 16 |
| 6376.0 | 17 |
| 6377.0 | 16 |
| 6378.0 | 15 |
| 6379.0 | 16 |
| 6380.0 | 15 |
| 6381.0 | 16 |
| 6382.0 | 17 |
| 6383.0 | 18 |
| 6384.0 | 17 |
| 6385.0 | 16 |
| 6386.0 | 17 |
| 6387.0 | 16 |
| 6388.0 | 15 |
| 6389.0 | 16 |
| 6390.0 | 17 |
| 6391.0 | 18 |
| 6392.0 | 19 |
| 6393.0 | 20 |
| 6394.0 | 19 |
| 6395.0 | 18 |
| 6396.0 | 17 |
| 6397.0 | 16 |
| 6398.0 | 17 |
| 6399.0 | 18 |
| 6400.0 | 19 |
| 6401.0 | 18 |
| 6402.0 | 17 |
| 6403.0 | 18 |
| 6404.0 | 17 |
| 6405.0 | 16 |
| 6406.0 | 15 |
| 6407.0 | 16 |
| 6408.0 | 17 |
| 6409.0 | 16 |
| 6410.0 | 17 |
| 6411.0 | 16 |
| 6412.0 | 15 |
| 6413.0 | 16 |
| 6414.0 | 17 |
| 6415.0 | 16 |
| 6416.0 | 17 |
| 6417.0 | 16 |
| 6418.0 | 15 |
| 6419.0 | 14 |
| 6420.0 | 15 |
| 6421.0 | 16 |
| 6422.0 | 17 |
| 6423.0 | 18 |
| 6424.0 | 19 |
| 6425.0 | 20 |
| 6426.0 | 19 |
| 6427.0 | 18 |
| 6428.0 | 19 |
| 6429.0 | 20 |
| 6430.0 | 21 |
| 6431.0 | 20 |
| 6432.0 | 21 |
| 6433.0 | 20 |
| 6434.0 | 21 |
| 6435.0 | 22 |
| 6436.0 | 23 |
| 6437.0 | 22 |
| 6438.0 | 23 |
| 6439.0 | 24 |
| 6440.0 | 25 |
| 6441.0 | 24 |
| 6442.0 | 25 |
| 6443.0 | 24 |
| 6444.0 | 23 |
| 6445.0 | 22 |
| 6446.0 | 21 |
| 6447.0 | 20 |
| 6448.0 | 21 |
| 6449.0 | 22 |
| 6450.0 | 23 |
| 6451.0 | 22 |
| 6452.0 | 21 |
| 6453.0 | 20 |
| 6454.0 | 19 |
| 6455.0 | 20 |
| 6456.0 | 19 |
| 6457.0 | 20 |
| 6458.0 | 19 |
| 6459.0 | 18 |
| 6460.0 | 17 |
| 6461.0 | 16 |
| 6462.0 | 17 |
| 6463.0 | 16 |
| 6464.0 | 17 |
| 6465.0 | 16 |
| 6466.0 | 17 |
| 6467.0 | 16 |
| 6468.0 | 15 |
| 6469.0 | 16 |
| 6470.0 | 17 |
| 6471.0 | 18 |
| 6472.0 | 17 |
| 6473.0 | 18 |
| 6474.0 | 17 |
| 6475.0 | 16 |
| 6476.0 | 15 |
| 6477.0 | 14 |
| 6478.0 | 15 |
| 6479.0 | 16 |
| 6480.0 | 17 |
| 6481.0 | 16 |
| 6482.0 | 17 |
| 6483.0 | 16 |
| 6484.0 | 17 |
| 6485.0 | 16 |
| 6486.0 | 15 |
| 6487.0 | 16 |
| 6488.0 | 17 |
| 6489.0 | 18 |
| 6490.0 | 19 |
| 6491.0 | 18 |
| 6492.0 | 19 |
| 6493.0 | 18 |
| 6494.0 | 19 |
| 6495.0 | 20 |
| 6496.0 | 19 |
| 6497.0 | 18 |
| 6498.0 | 19 |
| 6499.0 | 20 |
| 6500.0 | 19 |
| 6501.0 | 18 |
| 6502.0 | 17 |
| 6503.0 | 16 |
| 6504.0 | 17 |
| 6505.0 | 18 |
| 6506.0 | 19 |
| 6507.0 | 18 |
| 6508.0 | 19 |
| 6509.0 | 18 |
| 6510.0 | 19 |
| 6511.0 | 18 |
| 6512.0 | 19 |
| 6513.0 | 20 |
| 6514.0 | 19 |
| 6515.0 | 18 |
| 6516.0 | 19 |
| 6517.0 | 20 |
| 6518.0 | 19 |
| 6519.0 | 18 |
| 6520.0 | 19 |
| 6521.0 | 18 |
| 6522.0 | 17 |
| 6523.0 | 16 |
| 6524.0 | 17 |
| 6525.0 | 16 |
| 6526.0 | 15 |
| 6527.0 | 16 |
| 6528.0 | 15 |
| 6529.0 | 14 |
| 6530.0 | 15 |
| 6531.0 | 14 |
| 6532.0 | 13 |
| 6533.0 | 14 |
| 6534.0 | 13 |
| 6535.0 | 14 |
| 6536.0 | 13 |
| 6537.0 | 14 |
| 6538.0 | 13 |
| 6539.0 | 12 |
| 6540.0 | 11 |
| 6541.0 | 12 |
| 6542.0 | 11 |
| 6543.0 | 12 |
| 6544.0 | 11 |
| 6545.0 | 10 |
| 6546.0 | 11 |
| 6547.0 | 12 |
| 6548.0 | 13 |
| 6549.0 | 12 |
| 6550.0 | 11 |
| 6551.0 | 12 |
| 6552.0 | 13 |
| 6553.0 | 12 |
| 6554.0 | 11 |
| 6555.0 | 12 |
| 6556.0 | 11 |
| 6557.0 | 12 |
| 6558.0 | 11 |
| 6559.0 | 10 |
| 6560.0 | 11 |
| 6561.0 | 12 |
| 6562.0 | 11 |
| 6563.0 | 12 |
| 6564.0 | 13 |
| 6565.0 | 14 |
| 6566.0 | 13 |
| 6567.0 | 14 |
| 6568.0 | 13 |
| 6569.0 | 12 |
| 6570.0 | 11 |
| 6571.0 | 10 |
| 6572.0 | 9 |
| 6573.0 | 10 |
| 6574.0 | 11 |
| 6575.0 | 10 |
| 6576.0 | 11 |
| 6577.0 | 10 |
| 6578.0 | 9 |
| 6579.0 | 10 |
| 6580.0 | 11 |
| 6581.0 | 12 |
| 6582.0 | 13 |
| 6583.0 | 12 |
| 6584.0 | 11 |
| 6585.0 | 10 |
| 6586.0 | 9 |
| 6587.0 | 8 |
| 6588.0 | 7 |
| 6589.0 | 8 |
| 6590.0 | 7 |
| 6591.0 | 6 |
| 6592.0 | 5 |
| 6593.0 | 6 |
| 6594.0 | 7 |
| 6595.0 | 6 |
| 6596.0 | 7 |
| 6597.0 | 8 |
| 6598.0 | 9 |
| 6599.0 | 8 |
| 6600.0 | 9 |
| 6601.0 | 8 |
| 6602.0 | 7 |
| 6603.0 | 6 |
| 6604.0 | 5 |
| 6605.0 | 6 |
| 6606.0 | 7 |
| 6607.0 | 8 |
| 6608.0 | 7 |
| 6609.0 | 6 |
| 6610.0 | 5 |
| 6611.0 | 4 |
| 6612.0 | 3 |
| 6613.0 | 2 |
| 6614.0 | 3 |
| 6615.0 | 4 |
| 6616.0 | 5 |
| 6617.0 | 6 |
| 6618.0 | 7 |
| 6619.0 | 6 |
| 6620.0 | 5 |
| 6621.0 | 4 |
| 6622.0 | 5 |
| 6623.0 | 6 |
| 6624.0 | 7 |
| 6625.0 | 6 |
| 6626.0 | 7 |
| 6627.0 | 6 |
| 6628.0 | 5 |
| 6629.0 | 6 |
| 6630.0 | 5 |
| 6631.0 | 6 |
| 6632.0 | 7 |
| 6633.0 | 6 |
| 6634.0 | 7 |
| 6635.0 | 6 |
| 6636.0 | 7 |
| 6637.0 | 6 |
| 6638.0 | 5 |
| 6639.0 | 6 |
| 6640.0 | 7 |
| 6641.0 | 6 |
| 6642.0 | 7 |
| 6643.0 | 8 |
| 6644.0 | 9 |
| 6645.0 | 8 |
| 6646.0 | 7 |
| 6647.0 | 6 |
| 6648.0 | 5 |
| 6649.0 | 6 |
| 6650.0 | 7 |
| 6651.0 | 6 |
| 6652.0 | 5 |
| 6653.0 | 6 |
| 6654.0 | 5 |
| 6655.0 | 6 |
| 6656.0 | 7 |
| 6657.0 | 6 |
| 6658.0 | 7 |
| 6659.0 | 6 |
| 6660.0 | 7 |
| 6661.0 | 8 |
| 6662.0 | 7 |
| 6663.0 | 6 |
| 6664.0 | 7 |
| 6665.0 | 6 |
| 6666.0 | 7 |
| 6667.0 | 8 |
| 6668.0 | 9 |
| 6669.0 | 10 |
| 6670.0 | 11 |
| 6671.0 | 12 |
| 6672.0 | 11 |
| 6673.0 | 12 |
| 6674.0 | 13 |
| 6675.0 | 12 |
| 6676.0 | 11 |
| 6677.0 | 12 |
| 6678.0 | 11 |
| 6679.0 | 10 |
| 6680.0 | 11 |
| 6681.0 | 10 |
| 6682.0 | 9 |
| 6683.0 | 8 |
| 6684.0 | 9 |
| 6685.0 | 10 |
| 6686.0 | 11 |
| 6687.0 | 10 |
| 6688.0 | 11 |
| 6689.0 | 12 |
| 6690.0 | 13 |
| 6691.0 | 14 |
| 6692.0 | 13 |
| 6693.0 | 14 |
| 6694.0 | 15 |
| 6695.0 | 14 |
| 6696.0 | 13 |
| 6697.0 | 14 |
| 6698.0 | 15 |
| 6699.0 | 14 |
| 6700.0 | 13 |
| 6701.0 | 14 |
| 6702.0 | 13 |
| 6703.0 | 12 |
| 6704.0 | 11 |
| 6705.0 | 10 |
| 6706.0 | 9 |
| 6707.0 | 8 |
| 6708.0 | 9 |
| 6709.0 | 10 |
| 6710.0 | 9 |
| 6711.0 | 10 |
| 6712.0 | 11 |
| 6713.0 | 10 |
| 6714.0 | 9 |
| 6715.0 | 10 |
| 6716.0 | 9 |
| 6717.0 | 10 |
| 6718.0 | 9 |
| 6719.0 | 8 |
| 6720.0 | 7 |
| 6721.0 | 6 |
| 6722.0 | 7 |
| 6723.0 | 8 |
| 6724.0 | 9 |
| 6725.0 | 8 |
| 6726.0 | 7 |
| 6727.0 | 6 |
| 6728.0 | 7 |
| 6729.0 | 8 |
| 6730.0 | 9 |
| 6731.0 | 10 |
| 6732.0 | 11 |
| 6733.0 | 10 |
| 6734.0 | 11 |
| 6735.0 | 10 |
| 6736.0 | 9 |
| 6737.0 | 8 |
| 6738.0 | 9 |
| 6739.0 | 10 |
| 6740.0 | 9 |
| 6741.0 | 10 |
| 6742.0 | 11 |
| 6743.0 | 10 |
| 6744.0 | 9 |
| 6745.0 | 8 |
| 6746.0 | 7 |
| 6747.0 | 8 |
| 6748.0 | 9 |
| 6749.0 | 10 |
| 6750.0 | 11 |
| 6751.0 | 10 |
| 6752.0 | 11 |
| 6753.0 | 10 |
| 6754.0 | 11 |
| 6755.0 | 12 |
| 6756.0 | 13 |
| 6757.0 | 14 |
| 6758.0 | 15 |
| 6759.0 | 14 |
| 6760.0 | 13 |
| 6761.0 | 14 |
| 6762.0 | 15 |
| 6763.0 | 16 |
| 6764.0 | 15 |
| 6765.0 | 14 |
| 6766.0 | 15 |
| 6767.0 | 16 |
| 6768.0 | 15 |
| 6769.0 | 16 |
| 6770.0 | 17 |
| 6771.0 | 16 |
| 6772.0 | 17 |
| 6773.0 | 16 |
| 6774.0 | 17 |
| 6775.0 | 18 |
| 6776.0 | 17 |
| 6777.0 | 16 |
| 6778.0 | 15 |
| 6779.0 | 16 |
| 6780.0 | 15 |
| 6781.0 | 16 |
| 6782.0 | 17 |
| 6783.0 | 16 |
| 6784.0 | 15 |
| 6785.0 | 16 |
| 6786.0 | 15 |
| 6787.0 | 16 |
| 6788.0 | 17 |
| 6789.0 | 16 |
| 6790.0 | 17 |
| 6791.0 | 18 |
| 6792.0 | 17 |
| 6793.0 | 16 |
| 6794.0 | 17 |
| 6795.0 | 18 |
| 6796.0 | 17 |
| 6797.0 | 16 |
| 6798.0 | 17 |
| 6799.0 | 18 |
| 6800.0 | 17 |
| 6801.0 | 16 |
| 6802.0 | 17 |
| 6803.0 | 16 |
| 6804.0 | 15 |
| 6805.0 | 16 |
| 6806.0 | 15 |
| 6807.0 | 16 |
| 6808.0 | 15 |
| 6809.0 | 16 |
| 6810.0 | 17 |
| 6811.0 | 16 |
| 6812.0 | 15 |
| 6813.0 | 16 |
| 6814.0 | 15 |
| 6815.0 | 14 |
| 6816.0 | 13 |
| 6817.0 | 12 |
| 6818.0 | 13 |
| 6819.0 | 12 |
| 6820.0 | 11 |
| 6821.0 | 12 |
| 6822.0 | 11 |
| 6823.0 | 12 |
| 6824.0 | 13 |
| 6825.0 | 12 |
| 6826.0 | 13 |
| 6827.0 | 12 |
| 6828.0 | 11 |
| 6829.0 | 12 |
| 6830.0 | 13 |
| 6831.0 | 12 |
| 6832.0 | 13 |
| 6833.0 | 12 |
| 6834.0 | 11 |
| 6835.0 | 12 |
| 6836.0 | 11 |
| 6837.0 | 12 |
| 6838.0 | 11 |
| 6839.0 | 10 |
| 6840.0 | 11 |
| 6841.0 | 10 |
| 6842.0 | 11 |
| 6843.0 | 10 |
| 6844.0 | 11 |
| 6845.0 | 10 |
| 6846.0 | 9 |
| 6847.0 | 8 |
| 6848.0 | 7 |
| 6849.0 | 6 |
| 6850.0 | 7 |
| 6851.0 | 6 |
| 6852.0 | 7 |
| 6853.0 | 8 |
| 6854.0 | 9 |
| 6855.0 | 10 |
| 6856.0 | 11 |
| 6857.0 | 10 |
| 6858.0 | 9 |
| 6859.0 | 8 |
| 6860.0 | 9 |
| 6861.0 | 8 |
| 6862.0 | 7 |
| 6863.0 | 6 |
| 6864.0 | 7 |
| 6865.0 | 8 |
| 6866.0 | 9 |
| 6867.0 | 8 |
| 6868.0 | 7 |
| 6869.0 | 6 |
| 6870.0 | 7 |
| 6871.0 | 6 |
| 6872.0 | 5 |
| 6873.0 | 4 |
| 6874.0 | 3 |
| 6875.0 | 2 |
| 6876.0 | 1 |
| 6877.0 | 2 |
| 6878.0 | 3 |
| 6879.0 | 2 |
| 6880.0 | 3 |
| 6881.0 | 2 |
| 6882.0 | 1 |
| 6883.0 | 0 |
| 6884.0 | -1 |
| 6885.0 | -2 |
| 6886.0 | -3 |
| 6887.0 | -2 |
| 6888.0 | -1 |
| 6889.0 | 0 |
| 6890.0 | -1 |
| 6891.0 | 0 |
| 6892.0 | -1 |
| 6893.0 | -2 |
| 6894.0 | -1 |
| 6895.0 | 0 |
| 6896.0 | 1 |
| 6897.0 | 2 |
| 6898.0 | 1 |
| 6899.0 | 2 |
| 6900.0 | 1 |
| 6901.0 | 0 |
| 6902.0 | -1 |
| 6903.0 | 0 |
| 6904.0 | 1 |
| 6905.0 | 0 |
| 6906.0 | -1 |
| 6907.0 | 0 |
| 6908.0 | -1 |
| 6909.0 | 0 |
| 6910.0 | -1 |
| 6911.0 | 0 |
| 6912.0 | -1 |
| 6913.0 | 0 |
| 6914.0 | -1 |
| 6915.0 | 0 |
| 6916.0 | 1 |
| 6917.0 | 2 |
| 6918.0 | 3 |
| 6919.0 | 2 |
| 6920.0 | 3 |
| 6921.0 | 4 |
| 6922.0 | 5 |
| 6923.0 | 6 |
| 6924.0 | 5 |
| 6925.0 | 6 |
| 6926.0 | 5 |
| 6927.0 | 6 |
| 6928.0 | 7 |
| 6929.0 | 8 |
| 6930.0 | 7 |
| 6931.0 | 6 |
| 6932.0 | 5 |
| 6933.0 | 4 |
| 6934.0 | 3 |
| 6935.0 | 4 |
| 6936.0 | 5 |
| 6937.0 | 6 |
| 6938.0 | 5 |
| 6939.0 | 6 |
| 6940.0 | 7 |
| 6941.0 | 8 |
| 6942.0 | 9 |
| 6943.0 | 8 |
| 6944.0 | 9 |
| 6945.0 | 8 |
| 6946.0 | 7 |
| 6947.0 | 6 |
| 6948.0 | 7 |
| 6949.0 | 6 |
| 6950.0 | 5 |
| 6951.0 | 4 |
| 6952.0 | 5 |
| 6953.0 | 6 |
| 6954.0 | 7 |
| 6955.0 | 8 |
| 6956.0 | 9 |
| 6957.0 | 10 |
| 6958.0 | 11 |
| 6959.0 | 12 |
| 6960.0 | 11 |
| 6961.0 | 12 |
| 6962.0 | 11 |
| 6963.0 | 12 |
| 6964.0 | 11 |
| 6965.0 | 12 |
| 6966.0 | 13 |
| 6967.0 | 14 |
| 6968.0 | 13 |
| 6969.0 | 12 |
| 6970.0 | 11 |
| 6971.0 | 10 |
| 6972.0 | 9 |
| 6973.0 | 10 |
| 6974.0 | 9 |
| 6975.0 | 10 |
| 6976.0 | 9 |
| 6977.0 | 8 |
| 6978.0 | 7 |
| 6979.0 | 6 |
| 6980.0 | 5 |
| 6981.0 | 4 |
| 6982.0 | 3 |
| 6983.0 | 2 |
| 6984.0 | 1 |
| 6985.0 | 0 |
| 6986.0 | 1 |
| 6987.0 | 2 |
| 6988.0 | 3 |
| 6989.0 | 2 |
| 6990.0 | 1 |
| 6991.0 | 0 |
| 6992.0 | 1 |
| 6993.0 | 2 |
| 6994.0 | 3 |
| 6995.0 | 2 |
| 6996.0 | 1 |
| 6997.0 | 0 |
| 6998.0 | -1 |
| 6999.0 | -2 |
| 7000.0 | -1 |
| 7001.0 | -2 |
| 7002.0 | -1 |
| 7003.0 | 0 |
| 7004.0 | -1 |
| 7005.0 | -2 |
| 7006.0 | -3 |
| 7007.0 | -2 |
| 7008.0 | -1 |
| 7009.0 | -2 |
| 7010.0 | -1 |
| 7011.0 | -2 |
| 7012.0 | -3 |
| 7013.0 | -4 |
| 7014.0 | -3 |
| 7015.0 | -2 |
| 7016.0 | -3 |
| 7017.0 | -2 |
| 7018.0 | -3 |
| 7019.0 | -2 |
| 7020.0 | -3 |
| 7021.0 | -2 |
| 7022.0 | -1 |
| 7023.0 | 0 |
| 7024.0 | -1 |
| 7025.0 | -2 |
| 7026.0 | -3 |
| 7027.0 | -4 |
| 7028.0 | -3 |
| 7029.0 | -2 |
| 7030.0 | -3 |
| 7031.0 | -2 |
| 7032.0 | -1 |
| 7033.0 | 0 |
| 7034.0 | -1 |
| 7035.0 | -2 |
| 7036.0 | -1 |
| 7037.0 | -2 |
| 7038.0 | -3 |
| 7039.0 | -4 |
| 7040.0 | -3 |
| 7041.0 | -4 |
| 7042.0 | -5 |
| 7043.0 | -4 |
| 7044.0 | -5 |
| 7045.0 | -4 |
| 7046.0 | -3 |
| 7047.0 | -2 |
| 7048.0 | -3 |
| 7049.0 | -4 |
| 7050.0 | -5 |
| 7051.0 | -4 |
| 7052.0 | -5 |
| 7053.0 | -6 |
| 7054.0 | -5 |
| 7055.0 | -6 |
| 7056.0 | -5 |
| 7057.0 | -6 |
| 7058.0 | -5 |
| 7059.0 | -4 |
| 7060.0 | -3 |
| 7061.0 | -4 |
| 7062.0 | -3 |
| 7063.0 | -4 |
| 7064.0 | -3 |
| 7065.0 | -2 |
| 7066.0 | -3 |
| 7067.0 | -4 |
| 7068.0 | -5 |
| 7069.0 | -4 |
| 7070.0 | -3 |
| 7071.0 | -2 |
| 7072.0 | -3 |
| 7073.0 | -2 |
| 7074.0 | -3 |
| 7075.0 | -4 |
| 7076.0 | -3 |
| 7077.0 | -2 |
| 7078.0 | -3 |
| 7079.0 | -2 |
| 7080.0 | -1 |
| 7081.0 | -2 |
| 7082.0 | -1 |
| 7083.0 | -2 |
| 7084.0 | -1 |
| 7085.0 | 0 |
| 7086.0 | 1 |
| 7087.0 | 2 |
| 7088.0 | 3 |
| 7089.0 | 2 |
| 7090.0 | 3 |
| 7091.0 | 2 |
| 7092.0 | 3 |
| 7093.0 | 2 |
| 7094.0 | 3 |
| 7095.0 | 2 |
| 7096.0 | 1 |
| 7097.0 | 0 |
| 7098.0 | 1 |
| 7099.0 | 0 |
| 7100.0 | -1 |
| 7101.0 | 0 |
| 7102.0 | 1 |
| 7103.0 | 2 |
| 7104.0 | 1 |
| 7105.0 | 0 |
| 7106.0 | 1 |
| 7107.0 | 2 |
| 7108.0 | 3 |
| 7109.0 | 2 |
| 7110.0 | 3 |
| 7111.0 | 4 |
| 7112.0 | 3 |
| 7113.0 | 2 |
| 7114.0 | 1 |
| 7115.0 | 0 |
| 7116.0 | -1 |
| 7117.0 | 0 |
| 7118.0 | -1 |
| 7119.0 | -2 |
| 7120.0 | -3 |
| 7121.0 | -4 |
| 7122.0 | -5 |
| 7123.0 | -6 |
| 7124.0 | -7 |
| 7125.0 | -8 |
| 7126.0 | -9 |
| 7127.0 | -8 |
| 7128.0 | -9 |
| 7129.0 | -8 |
| 7130.0 | -7 |
| 7131.0 | -6 |
| 7132.0 | -7 |
| 7133.0 | -8 |
| 7134.0 | -9 |
| 7135.0 | -10 |
| 7136.0 | -9 |
| 7137.0 | -10 |
| 7138.0 | -11 |
| 7139.0 | -10 |
| 7140.0 | -11 |
| 7141.0 | -12 |
| 7142.0 | -13 |
| 7143.0 | -12 |
| 7144.0 | -13 |
| 7145.0 | -14 |
| 7146.0 | -15 |
| 7147.0 | -14 |
| 7148.0 | -13 |
| 7149.0 | -12 |
| 7150.0 | -11 |
| 7151.0 | -10 |
| 7152.0 | -11 |
| 7153.0 | -12 |
| 7154.0 | -13 |
| 7155.0 | -14 |
| 7156.0 | -13 |
| 7157.0 | -12 |
| 7158.0 | -11 |
| 7159.0 | -12 |
| 7160.0 | -13 |
| 7161.0 | -12 |
| 7162.0 | -11 |
| 7163.0 | -10 |
| 7164.0 | -9 |
| 7165.0 | -8 |
| 7166.0 | -7 |
| 7167.0 | -8 |
| 7168.0 | -7 |
| 7169.0 | -8 |
| 7170.0 | -9 |
| 7171.0 | -10 |
| 7172.0 | -11 |
| 7173.0 | -10 |
| 7174.0 | -9 |
| 7175.0 | -10 |
| 7176.0 | -11 |
| 7177.0 | -10 |
| 7178.0 | -9 |
| 7179.0 | -10 |
| 7180.0 | -9 |
| 7181.0 | -8 |
| 7182.0 | -7 |
| 7183.0 | -6 |
| 7184.0 | -7 |
| 7185.0 | -8 |
| 7186.0 | -7 |
| 7187.0 | -6 |
| 7188.0 | -7 |
| 7189.0 | -6 |
| 7190.0 | -5 |
| 7191.0 | -6 |
| 7192.0 | -5 |
| 7193.0 | -6 |
| 7194.0 | -7 |
| 7195.0 | -8 |
| 7196.0 | -9 |
| 7197.0 | -8 |
| 7198.0 | -7 |
| 7199.0 | -8 |
| 7200.0 | -9 |
| 7201.0 | -8 |
| 7202.0 | -7 |
| 7203.0 | -6 |
| 7204.0 | -7 |
| 7205.0 | -8 |
| 7206.0 | -9 |
| 7207.0 | -10 |
| 7208.0 | -9 |
| 7209.0 | -10 |
| 7210.0 | -11 |
| 7211.0 | -12 |
| 7212.0 | -13 |
| 7213.0 | -12 |
| 7214.0 | -13 |
| 7215.0 | -14 |
| 7216.0 | -13 |
| 7217.0 | -14 |
| 7218.0 | -15 |
| 7219.0 | -16 |
| 7220.0 | -15 |
| 7221.0 | -14 |
| 7222.0 | -15 |
| 7223.0 | -14 |
| 7224.0 | -15 |
| 7225.0 | -14 |
| 7226.0 | -13 |
| 7227.0 | -14 |
| 7228.0 | -15 |
| 7229.0 | -16 |
| 7230.0 | -15 |
| 7231.0 | -16 |
| 7232.0 | -17 |
| 7233.0 | -18 |
| 7234.0 | -17 |
| 7235.0 | -16 |
| 7236.0 | -15 |
| 7237.0 | -16 |
| 7238.0 | -17 |
| 7239.0 | -18 |
| 7240.0 | -17 |
| 7241.0 | -18 |
| 7242.0 | -17 |
| 7243.0 | -16 |
| 7244.0 | -17 |
| 7245.0 | -16 |
| 7246.0 | -15 |
| 7247.0 | -16 |
| 7248.0 | -15 |
| 7249.0 | -14 |
| 7250.0 | -15 |
| 7251.0 | -14 |
| 7252.0 | -13 |
| 7253.0 | -14 |
| 7254.0 | -13 |
| 7255.0 | -12 |
| 7256.0 | -13 |
| 7257.0 | -14 |
| 7258.0 | -15 |
| 7259.0 | -14 |
| 7260.0 | -15 |
| 7261.0 | -14 |
| 7262.0 | -13 |
| 7263.0 | -14 |
| 7264.0 | -15 |
| 7265.0 | -16 |
| 7266.0 | -15 |
| 7267.0 | -14 |
| 7268.0 | -13 |
| 7269.0 | -12 |
| 7270.0 | -11 |
| 7271.0 | -12 |
| 7272.0 | -13 |
| 7273.0 | -14 |
| 7274.0 | -13 |
| 7275.0 | -14 |
| 7276.0 | -13 |
| 7277.0 | -12 |
| 7278.0 | -11 |
| 7279.0 | -12 |
| 7280.0 | -11 |
| 7281.0 | -12 |
| 7282.0 | -13 |
| 7283.0 | -14 |
| 7284.0 | -13 |
| 7285.0 | -14 |
| 7286.0 | -13 |
| 7287.0 | -14 |
| 7288.0 | -15 |
| 7289.0 | -16 |
| 7290.0 | -15 |
| 7291.0 | -16 |
| 7292.0 | -17 |
| 7293.0 | -16 |
| 7294.0 | -15 |
| 7295.0 | -16 |
| 7296.0 | -15 |
| 7297.0 | -16 |
| 7298.0 | -15 |
| 7299.0 | -16 |
| 7300.0 | -15 |
| 7301.0 | -14 |
| 7302.0 | -15 |
| 7303.0 | -14 |
| 7304.0 | -13 |
| 7305.0 | -12 |
| 7306.0 | -13 |
| 7307.0 | -14 |
| 7308.0 | -13 |
| 7309.0 | -14 |
| 7310.0 | -13 |
| 7311.0 | -12 |
| 7312.0 | -11 |
| 7313.0 | -12 |
| 7314.0 | -11 |
| 7315.0 | -10 |
| 7316.0 | -9 |
| 7317.0 | -10 |
| 7318.0 | -9 |
| 7319.0 | -10 |
| 7320.0 | -11 |
| 7321.0 | -10 |
| 7322.0 | -11 |
| 7323.0 | -12 |
| 7324.0 | -13 |
| 7325.0 | -12 |
| 7326.0 | -11 |
| 7327.0 | -12 |
| 7328.0 | -11 |
| 7329.0 | -12 |
| 7330.0 | -13 |
| 7331.0 | -14 |
| 7332.0 | -13 |
| 7333.0 | -12 |
| 7334.0 | -11 |
| 7335.0 | -10 |
| 7336.0 | -9 |
| 7337.0 | -10 |
| 7338.0 | -11 |
| 7339.0 | -12 |
| 7340.0 | -11 |
| 7341.0 | -10 |
| 7342.0 | -9 |
| 7343.0 | -10 |
| 7344.0 | -9 |
| 7345.0 | -10 |
| 7346.0 | -11 |
| 7347.0 | -10 |
| 7348.0 | -9 |
| 7349.0 | -10 |
| 7350.0 | -9 |
| 7351.0 | -8 |
| 7352.0 | -7 |
| 7353.0 | -8 |
| 7354.0 | -7 |
| 7355.0 | -6 |
| 7356.0 | -7 |
| 7357.0 | -8 |
| 7358.0 | -9 |
| 7359.0 | -10 |
| 7360.0 | -9 |
| 7361.0 | -10 |
| 7362.0 | -9 |
| 7363.0 | -8 |
| 7364.0 | -7 |
| 7365.0 | -8 |
| 7366.0 | -9 |
| 7367.0 | -8 |
| 7368.0 | -7 |
| 7369.0 | -6 |
| 7370.0 | -5 |
| 7371.0 | -6 |
| 7372.0 | -7 |
| 7373.0 | -6 |
| 7374.0 | -5 |
| 7375.0 | -4 |
| 7376.0 | -5 |
| 7377.0 | -6 |
| 7378.0 | -7 |
| 7379.0 | -6 |
| 7380.0 | -5 |
| 7381.0 | -6 |
| 7382.0 | -7 |
| 7383.0 | -6 |
| 7384.0 | -7 |
| 7385.0 | -8 |
| 7386.0 | -7 |
| 7387.0 | -8 |
| 7388.0 | -7 |
| 7389.0 | -6 |
| 7390.0 | -5 |
| 7391.0 | -4 |
| 7392.0 | -5 |
| 7393.0 | -6 |
| 7394.0 | -7 |
| 7395.0 | -8 |
| 7396.0 | -9 |
| 7397.0 | -8 |
| 7398.0 | -7 |
| 7399.0 | -6 |
| 7400.0 | -5 |
| 7401.0 | -4 |
| 7402.0 | -3 |
| 7403.0 | -4 |
| 7404.0 | -3 |
| 7405.0 | -4 |
| 7406.0 | -5 |
| 7407.0 | -4 |
| 7408.0 | -3 |
| 7409.0 | -4 |
| 7410.0 | -5 |
| 7411.0 | -4 |
| 7412.0 | -3 |
| 7413.0 | -2 |
| 7414.0 | -1 |
| 7415.0 | -2 |
| 7416.0 | -3 |
| 7417.0 | -2 |
| 7418.0 | -1 |
| 7419.0 | 0 |
| 7420.0 | -1 |
| 7421.0 | -2 |
| 7422.0 | -3 |
| 7423.0 | -4 |
| 7424.0 | -3 |
| 7425.0 | -4 |
| 7426.0 | -5 |
| 7427.0 | -6 |
| 7428.0 | -5 |
| 7429.0 | -4 |
| 7430.0 | -5 |
| 7431.0 | -6 |
| 7432.0 | -5 |
| 7433.0 | -6 |
| 7434.0 | -7 |
| 7435.0 | -6 |
| 7436.0 | -7 |
| 7437.0 | -8 |
| 7438.0 | -7 |
| 7439.0 | -8 |
| 7440.0 | -7 |
| 7441.0 | -8 |
| 7442.0 | -9 |
| 7443.0 | -10 |
| 7444.0 | -9 |
| 7445.0 | -8 |
| 7446.0 | -7 |
| 7447.0 | -6 |
| 7448.0 | -5 |
| 7449.0 | -4 |
| 7450.0 | -5 |
| 7451.0 | -6 |
| 7452.0 | -5 |
| 7453.0 | -4 |
| 7454.0 | -3 |
| 7455.0 | -2 |
| 7456.0 | -3 |
| 7457.0 | -4 |
| 7458.0 | -5 |
| 7459.0 | -6 |
| 7460.0 | -7 |
| 7461.0 | -8 |
| 7462.0 | -9 |
| 7463.0 | -10 |
| 7464.0 | -11 |
| 7465.0 | -10 |
| 7466.0 | -9 |
| 7467.0 | -8 |
| 7468.0 | -9 |
| 7469.0 | -10 |
| 7470.0 | -9 |
| 7471.0 | -8 |
| 7472.0 | -9 |
| 7473.0 | -8 |
| 7474.0 | -9 |
| 7475.0 | -10 |
| 7476.0 | -9 |
| 7477.0 | -8 |
| 7478.0 | -9 |
| 7479.0 | -10 |
| 7480.0 | -9 |
| 7481.0 | -10 |
| 7482.0 | -11 |
| 7483.0 | -12 |
| 7484.0 | -13 |
| 7485.0 | -12 |
| 7486.0 | -11 |
| 7487.0 | -12 |
| 7488.0 | -11 |
| 7489.0 | -10 |
| 7490.0 | -11 |
| 7491.0 | -10 |
| 7492.0 | -9 |
| 7493.0 | -8 |
| 7494.0 | -7 |
| 7495.0 | -6 |
| 7496.0 | -5 |
| 7497.0 | -4 |
| 7498.0 | -5 |
| 7499.0 | -6 |
| 7500.0 | -7 |
| 7501.0 | -6 |
| 7502.0 | -5 |
| 7503.0 | -6 |
| 7504.0 | -5 |
| 7505.0 | -4 |
| 7506.0 | -5 |
| 7507.0 | -6 |
| 7508.0 | -7 |
| 7509.0 | -6 |
| 7510.0 | -7 |
| 7511.0 | -6 |
| 7512.0 | -7 |
| 7513.0 | -8 |
| 7514.0 | -7 |
| 7515.0 | -6 |
| 7516.0 | -7 |
| 7517.0 | -8 |
| 7518.0 | -7 |
| 7519.0 | -8 |
| 7520.0 | -7 |
| 7521.0 | -8 |
| 7522.0 | -9 |
| 7523.0 | -10 |
| 7524.0 | -9 |
| 7525.0 | -8 |
| 7526.0 | -7 |
| 7527.0 | -8 |
| 7528.0 | -7 |
| 7529.0 | -6 |
| 7530.0 | -5 |
| 7531.0 | -4 |
| 7532.0 | -3 |
| 7533.0 | -4 |
| 7534.0 | -5 |
| 7535.0 | -6 |
| 7536.0 | -7 |
| 7537.0 | -6 |
| 7538.0 | -7 |
| 7539.0 | -6 |
| 7540.0 | -7 |
| 7541.0 | -6 |
| 7542.0 | -7 |
| 7543.0 | -8 |
| 7544.0 | -7 |
| 7545.0 | -6 |
| 7546.0 | -5 |
| 7547.0 | -6 |
| 7548.0 | -7 |
| 7549.0 | -6 |
| 7550.0 | -5 |
| 7551.0 | -4 |
| 7552.0 | -5 |
| 7553.0 | -4 |
| 7554.0 | -5 |
| 7555.0 | -6 |
| 7556.0 | -7 |
| 7557.0 | -8 |
| 7558.0 | -9 |
| 7559.0 | -10 |
| 7560.0 | -11 |
| 7561.0 | -12 |
| 7562.0 | -11 |
| 7563.0 | -12 |
| 7564.0 | -13 |
| 7565.0 | -14 |
| 7566.0 | -13 |
| 7567.0 | -14 |
| 7568.0 | -15 |
| 7569.0 | -16 |
| 7570.0 | -15 |
| 7571.0 | -14 |
| 7572.0 | -13 |
| 7573.0 | -14 |
| 7574.0 | -15 |
| 7575.0 | -14 |
| 7576.0 | -15 |
| 7577.0 | -14 |
| 7578.0 | -15 |
| 7579.0 | -16 |
| 7580.0 | -17 |
| 7581.0 | -18 |
| 7582.0 | -19 |
| 7583.0 | -20 |
| 7584.0 | -19 |
| 7585.0 | -20 |
| 7586.0 | -19 |
| 7587.0 | -20 |
| 7588.0 | -19 |
| 7589.0 | -18 |
| 7590.0 | -17 |
| 7591.0 | -18 |
| 7592.0 | -17 |
| 7593.0 | -16 |
| 7594.0 | -17 |
| 7595.0 | -16 |
| 7596.0 | -17 |
| 7597.0 | -16 |
| 7598.0 | -17 |
| 7599.0 | -16 |
| 7600.0 | -15 |
| 7601.0 | -14 |
| 7602.0 | -13 |
| 7603.0 | -14 |
| 7604.0 | -13 |
| 7605.0 | -14 |
| 7606.0 | -15 |
| 7607.0 | -16 |
| 7608.0 | -15 |
| 7609.0 | -16 |
| 7610.0 | -17 |
| 7611.0 | -18 |
| 7612.0 | -17 |
| 7613.0 | -18 |
| 7614.0 | -17 |
| 7615.0 | -18 |
| 7616.0 | -17 |
| 7617.0 | -18 |
| 7618.0 | -19 |
| 7619.0 | -20 |
| 7620.0 | -19 |
| 7621.0 | -18 |
| 7622.0 | -19 |
| 7623.0 | -18 |
| 7624.0 | -19 |
| 7625.0 | -20 |
| 7626.0 | -21 |
| 7627.0 | -20 |
| 7628.0 | -21 |
| 7629.0 | -20 |
| 7630.0 | -21 |
| 7631.0 | -20 |
| 7632.0 | -19 |
| 7633.0 | -20 |
| 7634.0 | -21 |
| 7635.0 | -20 |
| 7636.0 | -21 |
| 7637.0 | -22 |
| 7638.0 | -23 |
| 7639.0 | -24 |
| 7640.0 | -23 |
| 7641.0 | -22 |
| 7642.0 | -21 |
| 7643.0 | -22 |
| 7644.0 | -23 |
| 7645.0 | -22 |
| 7646.0 | -21 |
| 7647.0 | -20 |
| 7648.0 | -21 |
| 7649.0 | -22 |
| 7650.0 | -21 |
| 7651.0 | -22 |
| 7652.0 | -23 |
| 7653.0 | -24 |
| 7654.0 | -25 |
| 7655.0 | -24 |
| 7656.0 | -25 |
| 7657.0 | -26 |
| 7658.0 | -25 |
| 7659.0 | -26 |
| 7660.0 | -25 |
| 7661.0 | -26 |
| 7662.0 | -25 |
| 7663.0 | -24 |
| 7664.0 | -23 |
| 7665.0 | -22 |
| 7666.0 | -21 |
| 7667.0 | -20 |
| 7668.0 | -19 |
| 7669.0 | -18 |
| 7670.0 | -19 |
| 7671.0 | -18 |
| 7672.0 | -17 |
| 7673.0 | -16 |
| 7674.0 | -15 |
| 7675.0 | -14 |
| 7676.0 | -15 |
| 7677.0 | -14 |
| 7678.0 | -15 |
| 7679.0 | -14 |
| 7680.0 | -13 |
| 7681.0 | -12 |
| 7682.0 | -11 |
| 7683.0 | -12 |
| 7684.0 | -13 |
| 7685.0 | -12 |
| 7686.0 | -13 |
| 7687.0 | -12 |
| 7688.0 | -11 |
| 7689.0 | -10 |
| 7690.0 | -9 |
| 7691.0 | -10 |
| 7692.0 | -11 |
| 7693.0 | -12 |
| 7694.0 | -11 |
| 7695.0 | -12 |
| 7696.0 | -11 |
| 7697.0 | -10 |
| 7698.0 | -11 |
| 7699.0 | -12 |
| 7700.0 | -11 |
| 7701.0 | -10 |
| 7702.0 | -11 |
| 7703.0 | -12 |
| 7704.0 | -11 |
| 7705.0 | -10 |
| 7706.0 | -11 |
| 7707.0 | -12 |
| 7708.0 | -13 |
| 7709.0 | -14 |
| 7710.0 | -15 |
| 7711.0 | -14 |
| 7712.0 | -15 |
| 7713.0 | -14 |
| 7714.0 | -15 |
| 7715.0 | -14 |
| 7716.0 | -15 |
| 7717.0 | -16 |
| 7718.0 | -15 |
| 7719.0 | -14 |
| 7720.0 | -13 |
| 7721.0 | -14 |
| 7722.0 | -13 |
| 7723.0 | -12 |
| 7724.0 | -13 |
| 7725.0 | -14 |
| 7726.0 | -15 |
| 7727.0 | -14 |
| 7728.0 | -15 |
| 7729.0 | -16 |
| 7730.0 | -15 |
| 7731.0 | -14 |
| 7732.0 | -13 |
| 7733.0 | -12 |
| 7734.0 | -13 |
| 7735.0 | -12 |
| 7736.0 | -11 |
| 7737.0 | -10 |
| 7738.0 | -11 |
| 7739.0 | -12 |
| 7740.0 | -13 |
| 7741.0 | -14 |
| 7742.0 | -15 |
| 7743.0 | -16 |
| 7744.0 | -15 |
| 7745.0 | -16 |
| 7746.0 | -17 |
| 7747.0 | -18 |
| 7748.0 | -19 |
| 7749.0 | -20 |
| 7750.0 | -21 |
| 7751.0 | -22 |
| 7752.0 | -23 |
| 7753.0 | -24 |
| 7754.0 | -25 |
| 7755.0 | -24 |
| 7756.0 | -25 |
| 7757.0 | -24 |
| 7758.0 | -23 |
| 7759.0 | -24 |
| 7760.0 | -23 |
| 7761.0 | -24 |
| 7762.0 | -23 |
| 7763.0 | -22 |
| 7764.0 | -21 |
| 7765.0 | -20 |
| 7766.0 | -19 |
| 7767.0 | -18 |
| 7768.0 | -17 |
| 7769.0 | -16 |
| 7770.0 | -15 |
| 7771.0 | -16 |
| 7772.0 | -15 |
| 7773.0 | -16 |
| 7774.0 | -15 |
| 7775.0 | -16 |
| 7776.0 | -17 |
| 7777.0 | -16 |
| 7778.0 | -17 |
| 7779.0 | -16 |
| 7780.0 | -15 |
| 7781.0 | -14 |
| 7782.0 | -13 |
| 7783.0 | -12 |
| 7784.0 | -11 |
| 7785.0 | -10 |
| 7786.0 | -9 |
| 7787.0 | -8 |
| 7788.0 | -9 |
| 7789.0 | -8 |
| 7790.0 | -7 |
| 7791.0 | -6 |
| 7792.0 | -7 |
| 7793.0 | -8 |
| 7794.0 | -7 |
| 7795.0 | -8 |
| 7796.0 | -7 |
| 7797.0 | -6 |
| 7798.0 | -7 |
| 7799.0 | -8 |
| 7800.0 | -9 |
| 7801.0 | -10 |
| 7802.0 | -11 |
| 7803.0 | -12 |
| 7804.0 | -13 |
| 7805.0 | -14 |
| 7806.0 | -13 |
| 7807.0 | -14 |
| 7808.0 | -13 |
| 7809.0 | -14 |
| 7810.0 | -13 |
| 7811.0 | -14 |
| 7812.0 | -13 |
| 7813.0 | -14 |
| 7814.0 | -13 |
| 7815.0 | -14 |
| 7816.0 | -15 |
| 7817.0 | -16 |
| 7818.0 | -17 |
| 7819.0 | -18 |
| 7820.0 | -17 |
| 7821.0 | -18 |
| 7822.0 | -19 |
| 7823.0 | -20 |
| 7824.0 | -21 |
| 7825.0 | -20 |
| 7826.0 | -19 |
| 7827.0 | -18 |
| 7828.0 | -19 |
| 7829.0 | -20 |
| 7830.0 | -19 |
| 7831.0 | -18 |
| 7832.0 | -19 |
| 7833.0 | -20 |
| 7834.0 | -19 |
| 7835.0 | -18 |
| 7836.0 | -17 |
| 7837.0 | -16 |
| 7838.0 | -17 |
| 7839.0 | -18 |
| 7840.0 | -17 |
| 7841.0 | -18 |
| 7842.0 | -19 |
| 7843.0 | -20 |
| 7844.0 | -19 |
| 7845.0 | -18 |
| 7846.0 | -19 |
| 7847.0 | -20 |
| 7848.0 | -19 |
| 7849.0 | -20 |
| 7850.0 | -21 |
| 7851.0 | -22 |
| 7852.0 | -21 |
| 7853.0 | -22 |
| 7854.0 | -21 |
| 7855.0 | -22 |
| 7856.0 | -21 |
| 7857.0 | -20 |
| 7858.0 | -21 |
| 7859.0 | -20 |
| 7860.0 | -19 |
| 7861.0 | -20 |
| 7862.0 | -19 |
| 7863.0 | -18 |
| 7864.0 | -17 |
| 7865.0 | -18 |
| 7866.0 | -17 |
| 7867.0 | -16 |
| 7868.0 | -15 |
| 7869.0 | -16 |
| 7870.0 | -17 |
| 7871.0 | -18 |
| 7872.0 | -19 |
| 7873.0 | -20 |
| 7874.0 | -21 |
| 7875.0 | -22 |
| 7876.0 | -21 |
| 7877.0 | -20 |
| 7878.0 | -19 |
| 7879.0 | -20 |
| 7880.0 | -21 |
| 7881.0 | -22 |
| 7882.0 | -21 |
| 7883.0 | -20 |
| 7884.0 | -19 |
| 7885.0 | -20 |
| 7886.0 | -19 |
| 7887.0 | -20 |
| 7888.0 | -19 |
| 7889.0 | -20 |
| 7890.0 | -21 |
| 7891.0 | -22 |
| 7892.0 | -23 |
| 7893.0 | -24 |
| 7894.0 | -25 |
| 7895.0 | -24 |
| 7896.0 | -25 |
| 7897.0 | -26 |
| 7898.0 | -25 |
| 7899.0 | -24 |
| 7900.0 | -23 |
| 7901.0 | -22 |
| 7902.0 | -21 |
| 7903.0 | -22 |
| 7904.0 | -21 |
| 7905.0 | -22 |
| 7906.0 | -23 |
| 7907.0 | -24 |
| 7908.0 | -23 |
| 7909.0 | -22 |
| 7910.0 | -21 |
| 7911.0 | -22 |
| 7912.0 | -21 |
| 7913.0 | -22 |
| 7914.0 | -23 |
| 7915.0 | -22 |
| 7916.0 | -21 |
| 7917.0 | -22 |
| 7918.0 | -23 |
| 7919.0 | -24 |
| 7920.0 | -23 |
| 7921.0 | -22 |
| 7922.0 | -21 |
| 7923.0 | -20 |
| 7924.0 | -21 |
| 7925.0 | -20 |
| 7926.0 | -21 |
| 7927.0 | -20 |
| 7928.0 | -21 |
| 7929.0 | -20 |
| 7930.0 | -19 |
| 7931.0 | -20 |
| 7932.0 | -19 |
| 7933.0 | -20 |
| 7934.0 | -19 |
| 7935.0 | -20 |
| 7936.0 | -21 |
| 7937.0 | -22 |
| 7938.0 | -21 |
| 7939.0 | -22 |
| 7940.0 | -23 |
| 7941.0 | -22 |
| 7942.0 | -21 |
| 7943.0 | -22 |
| 7944.0 | -23 |
| 7945.0 | -24 |
| 7946.0 | -25 |
| 7947.0 | -26 |
| 7948.0 | -25 |
| 7949.0 | -24 |
| 7950.0 | -25 |
| 7951.0 | -24 |
| 7952.0 | -23 |
| 7953.0 | -24 |
| 7954.0 | -23 |
| 7955.0 | -22 |
| 7956.0 | -21 |
| 7957.0 | -20 |
| 7958.0 | -21 |
| 7959.0 | -20 |
| 7960.0 | -19 |
| 7961.0 | -20 |
| 7962.0 | -21 |
| 7963.0 | -22 |
| 7964.0 | -23 |
| 7965.0 | -22 |
| 7966.0 | -21 |
| 7967.0 | -20 |
| 7968.0 | -19 |
| 7969.0 | -20 |
| 7970.0 | -21 |
| 7971.0 | -22 |
| 7972.0 | -21 |
| 7973.0 | -22 |
| 7974.0 | -23 |
| 7975.0 | -24 |
| 7976.0 | -23 |
| 7977.0 | -24 |
| 7978.0 | -23 |
| 7979.0 | -22 |
| 7980.0 | -23 |
| 7981.0 | -24 |
| 7982.0 | -23 |
| 7983.0 | -22 |
| 7984.0 | -23 |
| 7985.0 | -24 |
| 7986.0 | -25 |
| 7987.0 | -24 |
| 7988.0 | -23 |
| 7989.0 | -24 |
| 7990.0 | -23 |
| 7991.0 | -22 |
| 7992.0 | -23 |
| 7993.0 | -22 |
| 7994.0 | -21 |
| 7995.0 | -22 |
| 7996.0 | -21 |
| 7997.0 | -22 |
| 7998.0 | -21 |
| 7999.0 | -20 |
| 8000.0 | -21 |
| 8001.0 | -20 |
| 8002.0 | -21 |
| 8003.0 | -22 |
| 8004.0 | -21 |
| 8005.0 | -20 |
| 8006.0 | -21 |
| 8007.0 | -22 |
| 8008.0 | -23 |
| 8009.0 | -24 |
| 8010.0 | -25 |
| 8011.0 | -26 |
| 8012.0 | -25 |
| 8013.0 | -26 |
| 8014.0 | -27 |
| 8015.0 | -28 |
| 8016.0 | -29 |
| 8017.0 | -28 |
| 8018.0 | -29 |
| 8019.0 | -30 |
| 8020.0 | -31 |
| 8021.0 | -32 |
| 8022.0 | -31 |
| 8023.0 | -32 |
| 8024.0 | -33 |
| 8025.0 | -34 |
| 8026.0 | -35 |
| 8027.0 | -34 |
| 8028.0 | -35 |
| 8029.0 | -34 |
| 8030.0 | -35 |
| 8031.0 | -34 |
| 8032.0 | -35 |
| 8033.0 | -34 |
| 8034.0 | -33 |
| 8035.0 | -32 |
| 8036.0 | -33 |
| 8037.0 | -34 |
| 8038.0 | -33 |
| 8039.0 | -34 |
| 8040.0 | -33 |
| 8041.0 | -34 |
| 8042.0 | -35 |
| 8043.0 | -34 |
| 8044.0 | -33 |
| 8045.0 | -34 |
| 8046.0 | -35 |
| 8047.0 | -36 |
| 8048.0 | -35 |
| 8049.0 | -34 |
| 8050.0 | -35 |
| 8051.0 | -36 |
| 8052.0 | -35 |
| 8053.0 | -34 |
| 8054.0 | -35 |
| 8055.0 | -36 |
| 8056.0 | -37 |
| 8057.0 | -38 |
| 8058.0 | -37 |
| 8059.0 | -36 |
| 8060.0 | -35 |
| 8061.0 | -34 |
| 8062.0 | -33 |
| 8063.0 | -34 |
| 8064.0 | -35 |
| 8065.0 | -34 |
| 8066.0 | -33 |
| 8067.0 | -32 |
| 8068.0 | -33 |
| 8069.0 | -34 |
| 8070.0 | -35 |
| 8071.0 | -36 |
| 8072.0 | -37 |
| 8073.0 | -36 |
| 8074.0 | -35 |
| 8075.0 | -34 |
| 8076.0 | -33 |
| 8077.0 | -34 |
| 8078.0 | -35 |
| 8079.0 | -36 |
| 8080.0 | -35 |
| 8081.0 | -34 |
| 8082.0 | -33 |
| 8083.0 | -34 |
| 8084.0 | -35 |
| 8085.0 | -36 |
| 8086.0 | -37 |
| 8087.0 | -38 |
| 8088.0 | -39 |
| 8089.0 | -38 |
| 8090.0 | -39 |
| 8091.0 | -40 |
| 8092.0 | -39 |
| 8093.0 | -38 |
| 8094.0 | -37 |
| 8095.0 | -38 |
| 8096.0 | -39 |
| 8097.0 | -40 |
| 8098.0 | -41 |
| 8099.0 | -40 |
| 8100.0 | -41 |
| 8101.0 | -40 |
| 8102.0 | -39 |
| 8103.0 | -40 |
| 8104.0 | -39 |
| 8105.0 | -38 |
| 8106.0 | -39 |
| 8107.0 | -38 |
| 8108.0 | -37 |
| 8109.0 | -38 |
| 8110.0 | -39 |
| 8111.0 | -40 |
| 8112.0 | -39 |
| 8113.0 | -38 |
| 8114.0 | -37 |
| 8115.0 | -38 |
| 8116.0 | -39 |
| 8117.0 | -38 |
| 8118.0 | -37 |
| 8119.0 | -38 |
| 8120.0 | -37 |
| 8121.0 | -36 |
| 8122.0 | -35 |
| 8123.0 | -34 |
| 8124.0 | -35 |
| 8125.0 | -36 |
| 8126.0 | -35 |
| 8127.0 | -36 |
| 8128.0 | -35 |
| 8129.0 | -36 |
| 8130.0 | -35 |
| 8131.0 | -36 |
| 8132.0 | -35 |
| 8133.0 | -36 |
| 8134.0 | -37 |
| 8135.0 | -38 |
| 8136.0 | -37 |
| 8137.0 | -36 |
| 8138.0 | -37 |
| 8139.0 | -38 |
| 8140.0 | -39 |
| 8141.0 | -38 |
| 8142.0 | -37 |
| 8143.0 | -38 |
| 8144.0 | -37 |
| 8145.0 | -38 |
| 8146.0 | -39 |
| 8147.0 | -40 |
| 8148.0 | -41 |
| 8149.0 | -40 |
| 8150.0 | -39 |
| 8151.0 | -38 |
| 8152.0 | -39 |
| 8153.0 | -40 |
| 8154.0 | -39 |
| 8155.0 | -38 |
| 8156.0 | -39 |
| 8157.0 | -40 |
| 8158.0 | -39 |
| 8159.0 | -38 |
| 8160.0 | -39 |
| 8161.0 | -40 |
| 8162.0 | -39 |
| 8163.0 | -38 |
| 8164.0 | -39 |
| 8165.0 | -40 |
| 8166.0 | -39 |
| 8167.0 | -38 |
| 8168.0 | -39 |
| 8169.0 | -38 |
| 8170.0 | -37 |
| 8171.0 | -38 |
| 8172.0 | -39 |
| 8173.0 | -40 |
| 8174.0 | -41 |
| 8175.0 | -42 |
| 8176.0 | -43 |
| 8177.0 | -44 |
| 8178.0 | -43 |
| 8179.0 | -44 |
| 8180.0 | -45 |
| 8181.0 | -46 |
| 8182.0 | -47 |
| 8183.0 | -46 |
| 8184.0 | -47 |
| 8185.0 | -46 |
| 8186.0 | -45 |
| 8187.0 | -44 |
| 8188.0 | -43 |
| 8189.0 | -44 |
| 8190.0 | -45 |
| 8191.0 | -44 |
| 8192.0 | -45 |
| 8193.0 | -44 |
| 8194.0 | -43 |
| 8195.0 | -44 |
| 8196.0 | -45 |
| 8197.0 | -46 |
| 8198.0 | -47 |
| 8199.0 | -46 |
| 8200.0 | -47 |
| 8201.0 | -48 |
| 8202.0 | -49 |
| 8203.0 | -50 |
| 8204.0 | -51 |
| 8205.0 | -52 |
| 8206.0 | -53 |
| 8207.0 | -52 |
| 8208.0 | -51 |
| 8209.0 | -52 |
| 8210.0 | -53 |
| 8211.0 | -54 |
| 8212.0 | -53 |
| 8213.0 | -52 |
| 8214.0 | -53 |
| 8215.0 | -52 |
| 8216.0 | -53 |
| 8217.0 | -54 |
| 8218.0 | -53 |
| 8219.0 | -52 |
| 8220.0 | -51 |
| 8221.0 | -50 |
| 8222.0 | -51 |
| 8223.0 | -52 |
| 8224.0 | -53 |
| 8225.0 | -52 |
| 8226.0 | -51 |
| 8227.0 | -52 |
| 8228.0 | -51 |
| 8229.0 | -52 |
| 8230.0 | -53 |
| 8231.0 | -52 |
| 8232.0 | -51 |
| 8233.0 | -50 |
| 8234.0 | -51 |
| 8235.0 | -52 |
| 8236.0 | -53 |
| 8237.0 | -54 |
| 8238.0 | -55 |
| 8239.0 | -56 |
| 8240.0 | -55 |
| 8241.0 | -56 |
| 8242.0 | -57 |
| 8243.0 | -56 |
| 8244.0 | -57 |
| 8245.0 | -56 |
| 8246.0 | -55 |
| 8247.0 | -54 |
| 8248.0 | -53 |
| 8249.0 | -52 |
| 8250.0 | -53 |
| 8251.0 | -52 |
| 8252.0 | -53 |
| 8253.0 | -54 |
| 8254.0 | -53 |
| 8255.0 | -54 |
| 8256.0 | -55 |
| 8257.0 | -54 |
| 8258.0 | -55 |
| 8259.0 | -56 |
| 8260.0 | -57 |
| 8261.0 | -58 |
| 8262.0 | -57 |
| 8263.0 | -58 |
| 8264.0 | -57 |
| 8265.0 | -58 |
| 8266.0 | -59 |
| 8267.0 | -58 |
| 8268.0 | -59 |
| 8269.0 | -60 |
| 8270.0 | -61 |
| 8271.0 | -62 |
| 8272.0 | -61 |
| 8273.0 | -62 |
| 8274.0 | -63 |
| 8275.0 | -62 |
| 8276.0 | -63 |
| 8277.0 | -64 |
| 8278.0 | -63 |
| 8279.0 | -62 |
| 8280.0 | -63 |
| 8281.0 | -64 |
| 8282.0 | -65 |
| 8283.0 | -66 |
| 8284.0 | -67 |
| 8285.0 | -66 |
| 8286.0 | -65 |
| 8287.0 | -64 |
| 8288.0 | -63 |
| 8289.0 | -64 |
| 8290.0 | -63 |
| 8291.0 | -64 |
| 8292.0 | -65 |
| 8293.0 | -64 |
| 8294.0 | -63 |
| 8295.0 | -64 |
| 8296.0 | -63 |
| 8297.0 | -64 |
| 8298.0 | -65 |
| 8299.0 | -64 |
| 8300.0 | -65 |
| 8301.0 | -64 |
| 8302.0 | -63 |
| 8303.0 | -62 |
| 8304.0 | -61 |
| 8305.0 | -60 |
| 8306.0 | -61 |
| 8307.0 | -62 |
| 8308.0 | -61 |
| 8309.0 | -62 |
| 8310.0 | -61 |
| 8311.0 | -62 |
| 8312.0 | -61 |
| 8313.0 | -60 |
| 8314.0 | -61 |
| 8315.0 | -62 |
| 8316.0 | -61 |
| 8317.0 | -62 |
| 8318.0 | -63 |
| 8319.0 | -64 |
| 8320.0 | -65 |
| 8321.0 | -64 |
| 8322.0 | -63 |
| 8323.0 | -64 |
| 8324.0 | -65 |
| 8325.0 | -66 |
| 8326.0 | -65 |
| 8327.0 | -64 |
| 8328.0 | -65 |
| 8329.0 | -66 |
| 8330.0 | -65 |
| 8331.0 | -64 |
| 8332.0 | -63 |
| 8333.0 | -64 |
| 8334.0 | -65 |
| 8335.0 | -66 |
| 8336.0 | -65 |
| 8337.0 | -64 |
| 8338.0 | -65 |
| 8339.0 | -66 |
| 8340.0 | -65 |
| 8341.0 | -64 |
| 8342.0 | -63 |
| 8343.0 | -64 |
| 8344.0 | -63 |
| 8345.0 | -64 |
| 8346.0 | -65 |
| 8347.0 | -64 |
| 8348.0 | -63 |
| 8349.0 | -64 |
| 8350.0 | -63 |
| 8351.0 | -62 |
| 8352.0 | -63 |
| 8353.0 | -62 |
| 8354.0 | -61 |
| 8355.0 | -62 |
| 8356.0 | -63 |
| 8357.0 | -64 |
| 8358.0 | -65 |
| 8359.0 | -66 |
| 8360.0 | -65 |
| 8361.0 | -66 |
| 8362.0 | -65 |
| 8363.0 | -64 |
| 8364.0 | -65 |
| 8365.0 | -66 |
| 8366.0 | -67 |
| 8367.0 | -66 |
| 8368.0 | -65 |
| 8369.0 | -64 |
| 8370.0 | -65 |
| 8371.0 | -66 |
| 8372.0 | -67 |
| 8373.0 | -66 |
| 8374.0 | -65 |
| 8375.0 | -66 |
| 8376.0 | -65 |
| 8377.0 | -66 |
| 8378.0 | -65 |
| 8379.0 | -66 |
| 8380.0 | -67 |
| 8381.0 | -68 |
| 8382.0 | -69 |
| 8383.0 | -68 |
| 8384.0 | -67 |
| 8385.0 | -66 |
| 8386.0 | -67 |
| 8387.0 | -68 |
| 8388.0 | -67 |
| 8389.0 | -68 |
| 8390.0 | -67 |
| 8391.0 | -68 |
| 8392.0 | -69 |
| 8393.0 | -70 |
| 8394.0 | -69 |
| 8395.0 | -70 |
| 8396.0 | -71 |
| 8397.0 | -72 |
| 8398.0 | -73 |
| 8399.0 | -74 |
| 8400.0 | -73 |
| 8401.0 | -74 |
| 8402.0 | -73 |
| 8403.0 | -72 |
| 8404.0 | -73 |
| 8405.0 | -72 |
| 8406.0 | -71 |
| 8407.0 | -70 |
| 8408.0 | -69 |
| 8409.0 | -68 |
| 8410.0 | -69 |
| 8411.0 | -68 |
| 8412.0 | -67 |
| 8413.0 | -68 |
| 8414.0 | -69 |
| 8415.0 | -68 |
| 8416.0 | -67 |
| 8417.0 | -66 |
| 8418.0 | -65 |
| 8419.0 | -64 |
| 8420.0 | -65 |
| 8421.0 | -66 |
| 8422.0 | -65 |
| 8423.0 | -64 |
| 8424.0 | -63 |
| 8425.0 | -64 |
| 8426.0 | -65 |
| 8427.0 | -64 |
| 8428.0 | -63 |
| 8429.0 | -64 |
| 8430.0 | -65 |
| 8431.0 | -64 |
| 8432.0 | -63 |
| 8433.0 | -64 |
| 8434.0 | -63 |
| 8435.0 | -64 |
| 8436.0 | -65 |
| 8437.0 | -66 |
| 8438.0 | -65 |
| 8439.0 | -66 |
| 8440.0 | -65 |
| 8441.0 | -66 |
| 8442.0 | -67 |
| 8443.0 | -66 |
| 8444.0 | -67 |
| 8445.0 | -68 |
| 8446.0 | -67 |
| 8447.0 | -68 |
| 8448.0 | -69 |
| 8449.0 | -70 |
| 8450.0 | -69 |
| 8451.0 | -70 |
| 8452.0 | -69 |
| 8453.0 | -70 |
| 8454.0 | -69 |
| 8455.0 | -70 |
| 8456.0 | -71 |
| 8457.0 | -72 |
| 8458.0 | -73 |
| 8459.0 | -74 |
| 8460.0 | -73 |
| 8461.0 | -74 |
| 8462.0 | -75 |
| 8463.0 | -76 |
| 8464.0 | -77 |
| 8465.0 | -76 |
| 8466.0 | -75 |
| 8467.0 | -76 |
| 8468.0 | -77 |
| 8469.0 | -76 |
| 8470.0 | -75 |
| 8471.0 | -76 |
| 8472.0 | -77 |
| 8473.0 | -76 |
| 8474.0 | -77 |
| 8475.0 | -76 |
| 8476.0 | -77 |
| 8477.0 | -76 |
| 8478.0 | -77 |
| 8479.0 | -78 |
| 8480.0 | -77 |
| 8481.0 | -78 |
| 8482.0 | -79 |
| 8483.0 | -80 |
| 8484.0 | -81 |
| 8485.0 | -82 |
| 8486.0 | -81 |
| 8487.0 | -80 |
| 8488.0 | -79 |
| 8489.0 | -80 |
| 8490.0 | -79 |
| 8491.0 | -80 |
| 8492.0 | -81 |
| 8493.0 | -82 |
| 8494.0 | -81 |
| 8495.0 | -82 |
| 8496.0 | -83 |
| 8497.0 | -84 |
| 8498.0 | -83 |
| 8499.0 | -82 |
| 8500.0 | -83 |
| 8501.0 | -84 |
| 8502.0 | -85 |
| 8503.0 | -86 |
| 8504.0 | -85 |
| 8505.0 | -84 |
| 8506.0 | -85 |
| 8507.0 | -84 |
| 8508.0 | -85 |
| 8509.0 | -86 |
| 8510.0 | -85 |
| 8511.0 | -86 |
| 8512.0 | -87 |
| 8513.0 | -86 |
| 8514.0 | -87 |
| 8515.0 | -88 |
| 8516.0 | -87 |
| 8517.0 | -88 |
| 8518.0 | -87 |
| 8519.0 | -88 |
| 8520.0 | -89 |
| 8521.0 | -90 |
| 8522.0 | -89 |
| 8523.0 | -90 |
| 8524.0 | -91 |
| 8525.0 | -90 |
| 8526.0 | -89 |
| 8527.0 | -90 |
| 8528.0 | -89 |
| 8529.0 | -88 |
| 8530.0 | -87 |
| 8531.0 | -88 |
| 8532.0 | -89 |
| 8533.0 | -90 |
| 8534.0 | -89 |
| 8535.0 | -88 |
| 8536.0 | -89 |
| 8537.0 | -90 |
| 8538.0 | -91 |
| 8539.0 | -92 |
| 8540.0 | -93 |
| 8541.0 | -94 |
| 8542.0 | -93 |
| 8543.0 | -92 |
| 8544.0 | -91 |
| 8545.0 | -90 |
| 8546.0 | -89 |
| 8547.0 | -88 |
| 8548.0 | -87 |
| 8549.0 | -88 |
| 8550.0 | -87 |
| 8551.0 | -88 |
| 8552.0 | -89 |
| 8553.0 | -88 |
| 8554.0 | -89 |
| 8555.0 | -88 |
| 8556.0 | -89 |
| 8557.0 | -90 |
| 8558.0 | -89 |
| 8559.0 | -88 |
| 8560.0 | -87 |
| 8561.0 | -86 |
| 8562.0 | -85 |
| 8563.0 | -84 |
| 8564.0 | -83 |
| 8565.0 | -82 |
| 8566.0 | -83 |
| 8567.0 | -82 |
| 8568.0 | -83 |
| 8569.0 | -82 |
| 8570.0 | -83 |
| 8571.0 | -82 |
| 8572.0 | -83 |
| 8573.0 | -84 |
| 8574.0 | -85 |
| 8575.0 | -84 |
| 8576.0 | -83 |
| 8577.0 | -84 |
| 8578.0 | -85 |
| 8579.0 | -84 |
| 8580.0 | -85 |
| 8581.0 | -84 |
| 8582.0 | -85 |
| 8583.0 | -84 |
| 8584.0 | -85 |
| 8585.0 | -84 |
| 8586.0 | -85 |
| 8587.0 | -86 |
| 8588.0 | -87 |
| 8589.0 | -86 |
| 8590.0 | -87 |
| 8591.0 | -86 |
| 8592.0 | -85 |
| 8593.0 | -84 |
| 8594.0 | -85 |
| 8595.0 | -84 |
| 8596.0 | -83 |
| 8597.0 | -82 |
| 8598.0 | -81 |
| 8599.0 | -80 |
| 8600.0 | -79 |
| 8601.0 | -80 |
| 8602.0 | -79 |
| 8603.0 | -80 |
| 8604.0 | -81 |
| 8605.0 | -80 |
| 8606.0 | -81 |
| 8607.0 | -80 |
| 8608.0 | -79 |
| 8609.0 | -78 |
| 8610.0 | -77 |
| 8611.0 | -78 |
| 8612.0 | -77 |
| 8613.0 | -78 |
| 8614.0 | -79 |
| 8615.0 | -80 |
| 8616.0 | -79 |
| 8617.0 | -80 |
| 8618.0 | -81 |
| 8619.0 | -82 |
| 8620.0 | -81 |
| 8621.0 | -82 |
| 8622.0 | -83 |
| 8623.0 | -84 |
| 8624.0 | -83 |
| 8625.0 | -82 |
| 8626.0 | -83 |
| 8627.0 | -82 |
| 8628.0 | -81 |
| 8629.0 | -82 |
| 8630.0 | -81 |
| 8631.0 | -80 |
| 8632.0 | -81 |
| 8633.0 | -80 |
| 8634.0 | -81 |
| 8635.0 | -80 |
| 8636.0 | -79 |
| 8637.0 | -78 |
| 8638.0 | -77 |
| 8639.0 | -78 |
| 8640.0 | -77 |
| 8641.0 | -78 |
| 8642.0 | -77 |
| 8643.0 | -78 |
| 8644.0 | -77 |
| 8645.0 | -78 |
| 8646.0 | -77 |
| 8647.0 | -78 |
| 8648.0 | -77 |
| 8649.0 | -76 |
| 8650.0 | -75 |
| 8651.0 | -76 |
| 8652.0 | -75 |
| 8653.0 | -74 |
| 8654.0 | -73 |
| 8655.0 | -74 |
| 8656.0 | -73 |
| 8657.0 | -72 |
| 8658.0 | -73 |
| 8659.0 | -74 |
| 8660.0 | -75 |
| 8661.0 | -76 |
| 8662.0 | -75 |
| 8663.0 | -74 |
| 8664.0 | -73 |
| 8665.0 | -74 |
| 8666.0 | -73 |
| 8667.0 | -74 |
| 8668.0 | -73 |
| 8669.0 | -72 |
| 8670.0 | -73 |
| 8671.0 | -74 |
| 8672.0 | -73 |
| 8673.0 | -74 |
| 8674.0 | -73 |
| 8675.0 | -74 |
| 8676.0 | -75 |
| 8677.0 | -76 |
| 8678.0 | -77 |
| 8679.0 | -76 |
| 8680.0 | -77 |
| 8681.0 | -78 |
| 8682.0 | -77 |
| 8683.0 | -76 |
| 8684.0 | -77 |
| 8685.0 | -76 |
| 8686.0 | -77 |
| 8687.0 | -76 |
| 8688.0 | -75 |
| 8689.0 | -74 |
| 8690.0 | -73 |
| 8691.0 | -72 |
| 8692.0 | -71 |
| 8693.0 | -70 |
| 8694.0 | -71 |
| 8695.0 | -72 |
| 8696.0 | -73 |
| 8697.0 | -74 |
| 8698.0 | -75 |
| 8699.0 | -76 |
| 8700.0 | -77 |
| 8701.0 | -76 |
| 8702.0 | -75 |
| 8703.0 | -76 |
| 8704.0 | -77 |
| 8705.0 | -78 |
| 8706.0 | -77 |
| 8707.0 | -78 |
| 8708.0 | -77 |
| 8709.0 | -76 |
| 8710.0 | -77 |
| 8711.0 | -76 |
| 8712.0 | -77 |
| 8713.0 | -76 |
| 8714.0 | -75 |
| 8715.0 | -76 |
| 8716.0 | -77 |
| 8717.0 | -78 |
| 8718.0 | -79 |
| 8719.0 | -78 |
| 8720.0 | -77 |
| 8721.0 | -78 |
| 8722.0 | -79 |
| 8723.0 | -80 |
| 8724.0 | -79 |
| 8725.0 | -78 |
| 8726.0 | -77 |
| 8727.0 | -76 |
| 8728.0 | -77 |
| 8729.0 | -76 |
| 8730.0 | -77 |
| 8731.0 | -78 |
| 8732.0 | -79 |
| 8733.0 | -80 |
| 8734.0 | -81 |
| 8735.0 | -82 |
| 8736.0 | -81 |
| 8737.0 | -80 |
| 8738.0 | -79 |
| 8739.0 | -78 |
| 8740.0 | -79 |
| 8741.0 | -80 |
| 8742.0 | -79 |
| 8743.0 | -80 |
| 8744.0 | -81 |
| 8745.0 | -80 |
| 8746.0 | -79 |
| 8747.0 | -80 |
| 8748.0 | -81 |
| 8749.0 | -82 |
| 8750.0 | -81 |
| 8751.0 | -82 |
| 8752.0 | -81 |
| 8753.0 | -80 |
| 8754.0 | -79 |
| 8755.0 | -80 |
| 8756.0 | -79 |
| 8757.0 | -80 |
| 8758.0 | -81 |
| 8759.0 | -80 |
| 8760.0 | -79 |
| 8761.0 | -80 |
| 8762.0 | -79 |
| 8763.0 | -80 |
| 8764.0 | -79 |
| 8765.0 | -80 |
| 8766.0 | -79 |
| 8767.0 | -78 |
| 8768.0 | -77 |
| 8769.0 | -78 |
| 8770.0 | -79 |
| 8771.0 | -78 |
| 8772.0 | -77 |
| 8773.0 | -76 |
| 8774.0 | -75 |
| 8775.0 | -76 |
| 8776.0 | -77 |
| 8777.0 | -78 |
| 8778.0 | -79 |
| 8779.0 | -80 |
| 8780.0 | -81 |
| 8781.0 | -82 |
| 8782.0 | -83 |
| 8783.0 | -84 |
| 8784.0 | -85 |
| 8785.0 | -84 |
| 8786.0 | -85 |
| 8787.0 | -84 |
| 8788.0 | -83 |
| 8789.0 | -82 |
| 8790.0 | -81 |
| 8791.0 | -80 |
| 8792.0 | -81 |
| 8793.0 | -82 |
| 8794.0 | -81 |
| 8795.0 | -82 |
| 8796.0 | -83 |
| 8797.0 | -82 |
| 8798.0 | -81 |
| 8799.0 | -82 |
| 8800.0 | -83 |
| 8801.0 | -84 |
| 8802.0 | -85 |
| 8803.0 | -84 |
| 8804.0 | -83 |
| 8805.0 | -84 |
| 8806.0 | -85 |
| 8807.0 | -86 |
| 8808.0 | -85 |
| 8809.0 | -86 |
| 8810.0 | -87 |
| 8811.0 | -86 |
| 8812.0 | -87 |
| 8813.0 | -88 |
| 8814.0 | -89 |
| 8815.0 | -90 |
| 8816.0 | -89 |
| 8817.0 | -90 |
| 8818.0 | -91 |
| 8819.0 | -92 |
| 8820.0 | -93 |
| 8821.0 | -92 |
| 8822.0 | -91 |
| 8823.0 | -92 |
| 8824.0 | -91 |
| 8825.0 | -92 |
| 8826.0 | -93 |
| 8827.0 | -94 |
| 8828.0 | -93 |
| 8829.0 | -94 |
| 8830.0 | -93 |
| 8831.0 | -92 |
| 8832.0 | -93 |
| 8833.0 | -94 |
| 8834.0 | -95 |
| 8835.0 | -94 |
| 8836.0 | -95 |
| 8837.0 | -94 |
| 8838.0 | -95 |
| 8839.0 | -94 |
| 8840.0 | -95 |
| 8841.0 | -94 |
| 8842.0 | -93 |
| 8843.0 | -92 |
| 8844.0 | -91 |
| 8845.0 | -92 |
| 8846.0 | -93 |
| 8847.0 | -92 |
| 8848.0 | -91 |
| 8849.0 | -90 |
| 8850.0 | -89 |
| 8851.0 | -88 |
| 8852.0 | -87 |
| 8853.0 | -86 |
| 8854.0 | -87 |
| 8855.0 | -88 |
| 8856.0 | -89 |
| 8857.0 | -88 |
| 8858.0 | -89 |
| 8859.0 | -90 |
| 8860.0 | -89 |
| 8861.0 | -90 |
| 8862.0 | -91 |
| 8863.0 | -90 |
| 8864.0 | -91 |
| 8865.0 | -92 |
| 8866.0 | -93 |
| 8867.0 | -92 |
| 8868.0 | -91 |
| 8869.0 | -92 |
| 8870.0 | -93 |
| 8871.0 | -92 |
| 8872.0 | -91 |
| 8873.0 | -92 |
| 8874.0 | -91 |
| 8875.0 | -90 |
| 8876.0 | -89 |
| 8877.0 | -88 |
| 8878.0 | -87 |
| 8879.0 | -86 |
| 8880.0 | -85 |
| 8881.0 | -86 |
| 8882.0 | -87 |
| 8883.0 | -88 |
| 8884.0 | -87 |
| 8885.0 | -88 |
| 8886.0 | -87 |
| 8887.0 | -86 |
| 8888.0 | -85 |
| 8889.0 | -84 |
| 8890.0 | -83 |
| 8891.0 | -82 |
| 8892.0 | -81 |
| 8893.0 | -80 |
| 8894.0 | -79 |
| 8895.0 | -80 |
| 8896.0 | -81 |
| 8897.0 | -82 |
| 8898.0 | -81 |
| 8899.0 | -80 |
| 8900.0 | -79 |
| 8901.0 | -80 |
| 8902.0 | -81 |
| 8903.0 | -80 |
| 8904.0 | -79 |
| 8905.0 | -80 |
| 8906.0 | -79 |
| 8907.0 | -80 |
| 8908.0 | -79 |
| 8909.0 | -80 |
| 8910.0 | -81 |
| 8911.0 | -82 |
| 8912.0 | -83 |
| 8913.0 | -82 |
| 8914.0 | -83 |
| 8915.0 | -84 |
| 8916.0 | -85 |
| 8917.0 | -86 |
| 8918.0 | -85 |
| 8919.0 | -86 |
| 8920.0 | -87 |
| 8921.0 | -86 |
| 8922.0 | -87 |
| 8923.0 | -86 |
| 8924.0 | -85 |
| 8925.0 | -84 |
| 8926.0 | -85 |
| 8927.0 | -84 |
| 8928.0 | -85 |
| 8929.0 | -86 |
| 8930.0 | -87 |
| 8931.0 | -88 |
| 8932.0 | -87 |
| 8933.0 | -86 |
| 8934.0 | -85 |
| 8935.0 | -84 |
| 8936.0 | -83 |
| 8937.0 | -84 |
| 8938.0 | -85 |
| 8939.0 | -84 |
| 8940.0 | -85 |
| 8941.0 | -84 |
| 8942.0 | -83 |
| 8943.0 | -82 |
| 8944.0 | -83 |
| 8945.0 | -82 |
| 8946.0 | -81 |
| 8947.0 | -80 |
| 8948.0 | -81 |
| 8949.0 | -82 |
| 8950.0 | -81 |
| 8951.0 | -82 |
| 8952.0 | -83 |
| 8953.0 | -82 |
| 8954.0 | -83 |
| 8955.0 | -84 |
| 8956.0 | -83 |
| 8957.0 | -82 |
| 8958.0 | -83 |
| 8959.0 | -84 |
| 8960.0 | -85 |
| 8961.0 | -86 |
| 8962.0 | -85 |
| 8963.0 | -86 |
| 8964.0 | -85 |
| 8965.0 | -84 |
| 8966.0 | -85 |
| 8967.0 | -86 |
| 8968.0 | -85 |
| 8969.0 | -84 |
| 8970.0 | -85 |
| 8971.0 | -84 |
| 8972.0 | -83 |
| 8973.0 | -84 |
| 8974.0 | -85 |
| 8975.0 | -84 |
| 8976.0 | -83 |
| 8977.0 | -82 |
| 8978.0 | -83 |
| 8979.0 | -82 |
| 8980.0 | -83 |
| 8981.0 | -82 |
| 8982.0 | -83 |
| 8983.0 | -82 |
| 8984.0 | -81 |
| 8985.0 | -82 |
| 8986.0 | -83 |
| 8987.0 | -84 |
| 8988.0 | -83 |
| 8989.0 | -82 |
| 8990.0 | -81 |
| 8991.0 | -82 |
| 8992.0 | -81 |
| 8993.0 | -80 |
| 8994.0 | -79 |
| 8995.0 | -80 |
| 8996.0 | -79 |
| 8997.0 | -78 |
| 8998.0 | -79 |
| 8999.0 | -78 |
| 9000.0 | -77 |
| 9001.0 | -76 |
| 9002.0 | -75 |
| 9003.0 | -74 |
| 9004.0 | -73 |
| 9005.0 | -74 |
| 9006.0 | -75 |
| 9007.0 | -76 |
| 9008.0 | -77 |
| 9009.0 | -76 |
| 9010.0 | -77 |
| 9011.0 | -78 |
| 9012.0 | -77 |
| 9013.0 | -78 |
| 9014.0 | -79 |
| 9015.0 | -80 |
| 9016.0 | -79 |
| 9017.0 | -78 |
| 9018.0 | -79 |
| 9019.0 | -78 |
| 9020.0 | -79 |
| 9021.0 | -80 |
| 9022.0 | -79 |
| 9023.0 | -80 |
| 9024.0 | -81 |
| 9025.0 | -80 |
| 9026.0 | -81 |
| 9027.0 | -82 |
| 9028.0 | -83 |
| 9029.0 | -82 |
| 9030.0 | -83 |
| 9031.0 | -84 |
| 9032.0 | -83 |
| 9033.0 | -82 |
| 9034.0 | -83 |
| 9035.0 | -84 |
| 9036.0 | -83 |
| 9037.0 | -84 |
| 9038.0 | -85 |
| 9039.0 | -86 |
| 9040.0 | -87 |
| 9041.0 | -88 |
| 9042.0 | -89 |
| 9043.0 | -90 |
| 9044.0 | -91 |
| 9045.0 | -90 |
| 9046.0 | -91 |
| 9047.0 | -92 |
| 9048.0 | -93 |
| 9049.0 | -92 |
| 9050.0 | -91 |
| 9051.0 | -92 |
| 9052.0 | -93 |
| 9053.0 | -92 |
| 9054.0 | -93 |
| 9055.0 | -94 |
| 9056.0 | -95 |
| 9057.0 | -96 |
| 9058.0 | -95 |
| 9059.0 | -94 |
| 9060.0 | -93 |
| 9061.0 | -94 |
| 9062.0 | -93 |
| 9063.0 | -94 |
| 9064.0 | -95 |
| 9065.0 | -96 |
| 9066.0 | -95 |
| 9067.0 | -94 |
| 9068.0 | -95 |
| 9069.0 | -94 |
| 9070.0 | -93 |
| 9071.0 | -92 |
| 9072.0 | -93 |
| 9073.0 | -94 |
| 9074.0 | -95 |
| 9075.0 | -94 |
| 9076.0 | -95 |
| 9077.0 | -94 |
| 9078.0 | -93 |
| 9079.0 | -94 |
| 9080.0 | -93 |
| 9081.0 | -92 |
| 9082.0 | -93 |
| 9083.0 | -94 |
| 9084.0 | -93 |
| 9085.0 | -94 |
| 9086.0 | -95 |
| 9087.0 | -96 |
| 9088.0 | -95 |
| 9089.0 | -94 |
| 9090.0 | -93 |
| 9091.0 | -94 |
| 9092.0 | -95 |
| 9093.0 | -94 |
| 9094.0 | -93 |
| 9095.0 | -94 |
| 9096.0 | -95 |
| 9097.0 | -94 |
| 9098.0 | -95 |
| 9099.0 | -94 |
| 9100.0 | -93 |
| 9101.0 | -94 |
| 9102.0 | -93 |
| 9103.0 | -92 |
| 9104.0 | -91 |
| 9105.0 | -90 |
| 9106.0 | -89 |
| 9107.0 | -90 |
| 9108.0 | -91 |
| 9109.0 | -90 |
| 9110.0 | -91 |
| 9111.0 | -92 |
| 9112.0 | -91 |
| 9113.0 | -92 |
| 9114.0 | -91 |
| 9115.0 | -92 |
| 9116.0 | -91 |
| 9117.0 | -90 |
| 9118.0 | -91 |
| 9119.0 | -92 |
| 9120.0 | -91 |
| 9121.0 | -92 |
| 9122.0 | -93 |
| 9123.0 | -92 |
| 9124.0 | -93 |
| 9125.0 | -94 |
| 9126.0 | -93 |
| 9127.0 | -92 |
| 9128.0 | -93 |
| 9129.0 | -94 |
| 9130.0 | -93 |
| 9131.0 | -92 |
| 9132.0 | -91 |
| 9133.0 | -92 |
| 9134.0 | -91 |
| 9135.0 | -90 |
| 9136.0 | -91 |
| 9137.0 | -90 |
| 9138.0 | -91 |
| 9139.0 | -90 |
| 9140.0 | -91 |
| 9141.0 | -92 |
| 9142.0 | -93 |
| 9143.0 | -94 |
| 9144.0 | -95 |
| 9145.0 | -94 |
| 9146.0 | -95 |
| 9147.0 | -96 |
| 9148.0 | -97 |
| 9149.0 | -98 |
| 9150.0 | -97 |
| 9151.0 | -96 |
| 9152.0 | -97 |
| 9153.0 | -96 |
| 9154.0 | -95 |
| 9155.0 | -96 |
| 9156.0 | -97 |
| 9157.0 | -96 |
| 9158.0 | -95 |
| 9159.0 | -96 |
| 9160.0 | -95 |
| 9161.0 | -94 |
| 9162.0 | -93 |
| 9163.0 | -94 |
| 9164.0 | -95 |
| 9165.0 | -94 |
| 9166.0 | -95 |
| 9167.0 | -94 |
| 9168.0 | -95 |
| 9169.0 | -94 |
| 9170.0 | -93 |
| 9171.0 | -92 |
| 9172.0 | -91 |
| 9173.0 | -92 |
| 9174.0 | -91 |
| 9175.0 | -90 |
| 9176.0 | -89 |
| 9177.0 | -88 |
| 9178.0 | -87 |
| 9179.0 | -88 |
| 9180.0 | -87 |
| 9181.0 | -88 |
| 9182.0 | -89 |
| 9183.0 | -88 |
| 9184.0 | -89 |
| 9185.0 | -90 |
| 9186.0 | -91 |
| 9187.0 | -92 |
| 9188.0 | -91 |
| 9189.0 | -90 |
| 9190.0 | -89 |
| 9191.0 | -88 |
| 9192.0 | -87 |
| 9193.0 | -88 |
| 9194.0 | -89 |
| 9195.0 | -90 |
| 9196.0 | -89 |
| 9197.0 | -88 |
| 9198.0 | -89 |
| 9199.0 | -90 |
| 9200.0 | -89 |
| 9201.0 | -90 |
| 9202.0 | -91 |
| 9203.0 | -90 |
| 9204.0 | -89 |
| 9205.0 | -88 |
| 9206.0 | -89 |
| 9207.0 | -88 |
| 9208.0 | -89 |
| 9209.0 | -90 |
| 9210.0 | -89 |
| 9211.0 | -88 |
| 9212.0 | -87 |
| 9213.0 | -86 |
| 9214.0 | -85 |
| 9215.0 | -84 |
| 9216.0 | -83 |
| 9217.0 | -84 |
| 9218.0 | -83 |
| 9219.0 | -82 |
| 9220.0 | -81 |
| 9221.0 | -80 |
| 9222.0 | -79 |
| 9223.0 | -78 |
| 9224.0 | -79 |
| 9225.0 | -78 |
| 9226.0 | -79 |
| 9227.0 | -78 |
| 9228.0 | -79 |
| 9229.0 | -78 |
| 9230.0 | -79 |
| 9231.0 | -80 |
| 9232.0 | -81 |
| 9233.0 | -82 |
| 9234.0 | -83 |
| 9235.0 | -84 |
| 9236.0 | -85 |
| 9237.0 | -86 |
| 9238.0 | -87 |
| 9239.0 | -88 |
| 9240.0 | -89 |
| 9241.0 | -90 |
| 9242.0 | -91 |
| 9243.0 | -90 |
| 9244.0 | -91 |
| 9245.0 | -90 |
| 9246.0 | -89 |
| 9247.0 | -88 |
| 9248.0 | -89 |
| 9249.0 | -90 |
| 9250.0 | -91 |
| 9251.0 | -90 |
| 9252.0 | -89 |
| 9253.0 | -90 |
| 9254.0 | -89 |
| 9255.0 | -88 |
| 9256.0 | -89 |
| 9257.0 | -88 |
| 9258.0 | -87 |
| 9259.0 | -86 |
| 9260.0 | -87 |
| 9261.0 | -88 |
| 9262.0 | -89 |
| 9263.0 | -90 |
| 9264.0 | -89 |
| 9265.0 | -90 |
| 9266.0 | -91 |
| 9267.0 | -90 |
| 9268.0 | -91 |
| 9269.0 | -92 |
| 9270.0 | -93 |
| 9271.0 | -94 |
| 9272.0 | -93 |
| 9273.0 | -94 |
| 9274.0 | -93 |
| 9275.0 | -94 |
| 9276.0 | -95 |
| 9277.0 | -96 |
| 9278.0 | -95 |
| 9279.0 | -94 |
| 9280.0 | -93 |
| 9281.0 | -92 |
| 9282.0 | -93 |
| 9283.0 | -94 |
| 9284.0 | -95 |
| 9285.0 | -94 |
| 9286.0 | -93 |
| 9287.0 | -92 |
| 9288.0 | -91 |
| 9289.0 | -90 |
| 9290.0 | -91 |
| 9291.0 | -92 |
| 9292.0 | -93 |
| 9293.0 | -94 |
| 9294.0 | -95 |
| 9295.0 | -94 |
| 9296.0 | -95 |
| 9297.0 | -94 |
| 9298.0 | -95 |
| 9299.0 | -96 |
| 9300.0 | -97 |
| 9301.0 | -96 |
| 9302.0 | -95 |
| 9303.0 | -96 |
| 9304.0 | -97 |
| 9305.0 | -96 |
| 9306.0 | -97 |
| 9307.0 | -98 |
| 9308.0 | -99 |
| 9309.0 | -98 |
| 9310.0 | -99 |
| 9311.0 | -98 |
| 9312.0 | -99 |
| 9313.0 | -100 |
| 9314.0 | -99 |
| 9315.0 | -98 |
| 9316.0 | -99 |
| 9317.0 | -100 |
| 9318.0 | -101 |
| 9319.0 | -100 |
| 9320.0 | -99 |
| 9321.0 | -100 |
| 9322.0 | -99 |
| 9323.0 | -100 |
| 9324.0 | -101 |
| 9325.0 | -100 |
| 9326.0 | -101 |
| 9327.0 | -102 |
| 9328.0 | -103 |
| 9329.0 | -104 |
| 9330.0 | -105 |
| 9331.0 | -104 |
| 9332.0 | -105 |
| 9333.0 | -106 |
| 9334.0 | -105 |
| 9335.0 | -106 |
| 9336.0 | -105 |
| 9337.0 | -106 |
| 9338.0 | -105 |
| 9339.0 | -106 |
| 9340.0 | -107 |
| 9341.0 | -106 |
| 9342.0 | -107 |
| 9343.0 | -108 |
| 9344.0 | -107 |
| 9345.0 | -108 |
| 9346.0 | -107 |
| 9347.0 | -108 |
| 9348.0 | -107 |
| 9349.0 | -108 |
| 9350.0 | -109 |
| 9351.0 | -110 |
| 9352.0 | -111 |
| 9353.0 | -112 |
| 9354.0 | -111 |
| 9355.0 | -112 |
| 9356.0 | -111 |
| 9357.0 | -112 |
| 9358.0 | -113 |
| 9359.0 | -114 |
| 9360.0 | -113 |
| 9361.0 | -114 |
| 9362.0 | -113 |
| 9363.0 | -112 |
| 9364.0 | -111 |
| 9365.0 | -110 |
| 9366.0 | -109 |
| 9367.0 | -108 |
| 9368.0 | -107 |
| 9369.0 | -106 |
| 9370.0 | -107 |
| 9371.0 | -106 |
| 9372.0 | -107 |
| 9373.0 | -108 |
| 9374.0 | -107 |
| 9375.0 | -106 |
| 9376.0 | -105 |
| 9377.0 | -104 |
| 9378.0 | -103 |
| 9379.0 | -102 |
| 9380.0 | -103 |
| 9381.0 | -104 |
| 9382.0 | -103 |
| 9383.0 | -102 |
| 9384.0 | -101 |
| 9385.0 | -102 |
| 9386.0 | -101 |
| 9387.0 | -100 |
| 9388.0 | -101 |
| 9389.0 | -100 |
| 9390.0 | -101 |
| 9391.0 | -100 |
| 9392.0 | -99 |
| 9393.0 | -98 |
| 9394.0 | -97 |
| 9395.0 | -98 |
| 9396.0 | -99 |
| 9397.0 | -100 |
| 9398.0 | -101 |
| 9399.0 | -100 |
| 9400.0 | -99 |
| 9401.0 | -100 |
| 9402.0 | -99 |
| 9403.0 | -98 |
| 9404.0 | -99 |
| 9405.0 | -98 |
| 9406.0 | -99 |
| 9407.0 | -98 |
| 9408.0 | -97 |
| 9409.0 | -98 |
| 9410.0 | -97 |
| 9411.0 | -98 |
| 9412.0 | -97 |
| 9413.0 | -96 |
| 9414.0 | -95 |
| 9415.0 | -96 |
| 9416.0 | -97 |
| 9417.0 | -98 |
| 9418.0 | -97 |
| 9419.0 | -96 |
| 9420.0 | -97 |
| 9421.0 | -98 |
| 9422.0 | -97 |
| 9423.0 | -98 |
| 9424.0 | -99 |
| 9425.0 | -98 |
| 9426.0 | -97 |
| 9427.0 | -96 |
| 9428.0 | -97 |
| 9429.0 | -96 |
| 9430.0 | -97 |
| 9431.0 | -98 |
| 9432.0 | -97 |
| 9433.0 | -98 |
| 9434.0 | -97 |
| 9435.0 | -98 |
| 9436.0 | -99 |
| 9437.0 | -100 |
| 9438.0 | -99 |
| 9439.0 | -98 |
| 9440.0 | -97 |
| 9441.0 | -98 |
| 9442.0 | -99 |
| 9443.0 | -100 |
| 9444.0 | -99 |
| 9445.0 | -98 |
| 9446.0 | -97 |
| 9447.0 | -96 |
| 9448.0 | -97 |
| 9449.0 | -98 |
| 9450.0 | -97 |
| 9451.0 | -96 |
| 9452.0 | -97 |
| 9453.0 | -98 |
| 9454.0 | -97 |
| 9455.0 | -98 |
| 9456.0 | -99 |
| 9457.0 | -100 |
| 9458.0 | -99 |
| 9459.0 | -98 |
| 9460.0 | -97 |
| 9461.0 | -96 |
| 9462.0 | -95 |
| 9463.0 | -96 |
| 9464.0 | -95 |
| 9465.0 | -96 |
| 9466.0 | -95 |
| 9467.0 | -94 |
| 9468.0 | -93 |
| 9469.0 | -92 |
| 9470.0 | -91 |
| 9471.0 | -92 |
| 9472.0 | -93 |
| 9473.0 | -92 |
| 9474.0 | -91 |
| 9475.0 | -90 |
| 9476.0 | -91 |
| 9477.0 | -92 |
| 9478.0 | -91 |
| 9479.0 | -90 |
| 9480.0 | -91 |
| 9481.0 | -90 |
| 9482.0 | -89 |
| 9483.0 | -88 |
| 9484.0 | -87 |
| 9485.0 | -88 |
| 9486.0 | -89 |
| 9487.0 | -90 |
| 9488.0 | -91 |
| 9489.0 | -92 |
| 9490.0 | -93 |
| 9491.0 | -94 |
| 9492.0 | -93 |
| 9493.0 | -94 |
| 9494.0 | -95 |
| 9495.0 | -94 |
| 9496.0 | -95 |
| 9497.0 | -94 |
| 9498.0 | -93 |
| 9499.0 | -92 |
| 9500.0 | -93 |
| 9501.0 | -94 |
| 9502.0 | -95 |
| 9503.0 | -96 |
| 9504.0 | -97 |
| 9505.0 | -96 |
| 9506.0 | -97 |
| 9507.0 | -96 |
| 9508.0 | -95 |
| 9509.0 | -96 |
| 9510.0 | -95 |
| 9511.0 | -94 |
| 9512.0 | -95 |
| 9513.0 | -94 |
| 9514.0 | -95 |
| 9515.0 | -94 |
| 9516.0 | -93 |
| 9517.0 | -92 |
| 9518.0 | -93 |
| 9519.0 | -94 |
| 9520.0 | -95 |
| 9521.0 | -96 |
| 9522.0 | -95 |
| 9523.0 | -96 |
| 9524.0 | -97 |
| 9525.0 | -96 |
| 9526.0 | -97 |
| 9527.0 | -98 |
| 9528.0 | -99 |
| 9529.0 | -98 |
| 9530.0 | -99 |
| 9531.0 | -100 |
| 9532.0 | -99 |
| 9533.0 | -98 |
| 9534.0 | -99 |
| 9535.0 | -100 |
| 9536.0 | -101 |
| 9537.0 | -100 |
| 9538.0 | -101 |
| 9539.0 | -102 |
| 9540.0 | -101 |
| 9541.0 | -102 |
| 9542.0 | -101 |
| 9543.0 | -102 |
| 9544.0 | -101 |
| 9545.0 | -102 |
| 9546.0 | -103 |
| 9547.0 | -104 |
| 9548.0 | -103 |
| 9549.0 | -104 |
| 9550.0 | -103 |
| 9551.0 | -102 |
| 9552.0 | -103 |
| 9553.0 | -104 |
| 9554.0 | -103 |
| 9555.0 | -102 |
| 9556.0 | -101 |
| 9557.0 | -102 |
| 9558.0 | -101 |
| 9559.0 | -102 |
| 9560.0 | -101 |
| 9561.0 | -100 |
| 9562.0 | -99 |
| 9563.0 | -98 |
| 9564.0 | -97 |
| 9565.0 | -98 |
| 9566.0 | -97 |
| 9567.0 | -98 |
| 9568.0 | -97 |
| 9569.0 | -96 |
| 9570.0 | -95 |
| 9571.0 | -94 |
| 9572.0 | -93 |
| 9573.0 | -94 |
| 9574.0 | -93 |
| 9575.0 | -94 |
| 9576.0 | -95 |
| 9577.0 | -94 |
| 9578.0 | -95 |
| 9579.0 | -96 |
| 9580.0 | -95 |
| 9581.0 | -94 |
| 9582.0 | -95 |
| 9583.0 | -94 |
| 9584.0 | -93 |
| 9585.0 | -94 |
| 9586.0 | -93 |
| 9587.0 | -94 |
| 9588.0 | -93 |
| 9589.0 | -94 |
| 9590.0 | -93 |
| 9591.0 | -94 |
| 9592.0 | -93 |
| 9593.0 | -92 |
| 9594.0 | -91 |
| 9595.0 | -90 |
| 9596.0 | -91 |
| 9597.0 | -90 |
| 9598.0 | -91 |
| 9599.0 | -92 |
| 9600.0 | -91 |
| 9601.0 | -90 |
| 9602.0 | -89 |
| 9603.0 | -88 |
| 9604.0 | -87 |
| 9605.0 | -88 |
| 9606.0 | -89 |
| 9607.0 | -88 |
| 9608.0 | -89 |
| 9609.0 | -90 |
| 9610.0 | -91 |
| 9611.0 | -90 |
| 9612.0 | -89 |
| 9613.0 | -88 |
| 9614.0 | -87 |
| 9615.0 | -86 |
| 9616.0 | -85 |
| 9617.0 | -86 |
| 9618.0 | -87 |
| 9619.0 | -88 |
| 9620.0 | -89 |
| 9621.0 | -90 |
| 9622.0 | -89 |
| 9623.0 | -88 |
| 9624.0 | -89 |
| 9625.0 | -88 |
| 9626.0 | -89 |
| 9627.0 | -88 |
| 9628.0 | -89 |
| 9629.0 | -88 |
| 9630.0 | -89 |
| 9631.0 | -88 |
| 9632.0 | -87 |
| 9633.0 | -86 |
| 9634.0 | -85 |
| 9635.0 | -86 |
| 9636.0 | -87 |
| 9637.0 | -88 |
| 9638.0 | -89 |
| 9639.0 | -88 |
| 9640.0 | -89 |
| 9641.0 | -88 |
| 9642.0 | -87 |
| 9643.0 | -86 |
| 9644.0 | -85 |
| 9645.0 | -84 |
| 9646.0 | -85 |
| 9647.0 | -84 |
| 9648.0 | -83 |
| 9649.0 | -82 |
| 9650.0 | -81 |
| 9651.0 | -80 |
| 9652.0 | -81 |
| 9653.0 | -80 |
| 9654.0 | -79 |
| 9655.0 | -78 |
| 9656.0 | -77 |
| 9657.0 | -76 |
| 9658.0 | -75 |
| 9659.0 | -74 |
| 9660.0 | -75 |
| 9661.0 | -74 |
| 9662.0 | -73 |
| 9663.0 | -72 |
| 9664.0 | -71 |
| 9665.0 | -70 |
| 9666.0 | -71 |
| 9667.0 | -72 |
| 9668.0 | -71 |
| 9669.0 | -70 |
| 9670.0 | -71 |
| 9671.0 | -72 |
| 9672.0 | -71 |
| 9673.0 | -72 |
| 9674.0 | -73 |
| 9675.0 | -72 |
| 9676.0 | -73 |
| 9677.0 | -72 |
| 9678.0 | -71 |
| 9679.0 | -72 |
| 9680.0 | -73 |
| 9681.0 | -74 |
| 9682.0 | -75 |
| 9683.0 | -74 |
| 9684.0 | -75 |
| 9685.0 | -74 |
| 9686.0 | -73 |
| 9687.0 | -74 |
| 9688.0 | -75 |
| 9689.0 | -76 |
| 9690.0 | -75 |
| 9691.0 | -74 |
| 9692.0 | -75 |
| 9693.0 | -76 |
| 9694.0 | -75 |
| 9695.0 | -76 |
| 9696.0 | -75 |
| 9697.0 | -76 |
| 9698.0 | -77 |
| 9699.0 | -76 |
| 9700.0 | -77 |
| 9701.0 | -78 |
| 9702.0 | -79 |
| 9703.0 | -78 |
| 9704.0 | -79 |
| 9705.0 | -80 |
| 9706.0 | -81 |
| 9707.0 | -82 |
| 9708.0 | -83 |
| 9709.0 | -82 |
| 9710.0 | -83 |
| 9711.0 | -84 |
| 9712.0 | -83 |
| 9713.0 | -82 |
| 9714.0 | -81 |
| 9715.0 | -82 |
| 9716.0 | -83 |
| 9717.0 | -84 |
| 9718.0 | -83 |
| 9719.0 | -84 |
| 9720.0 | -83 |
| 9721.0 | -84 |
| 9722.0 | -85 |
| 9723.0 | -84 |
| 9724.0 | -85 |
| 9725.0 | -86 |
| 9726.0 | -87 |
| 9727.0 | -86 |
| 9728.0 | -85 |
| 9729.0 | -86 |
| 9730.0 | -85 |
| 9731.0 | -84 |
| 9732.0 | -83 |
| 9733.0 | -84 |
| 9734.0 | -85 |
| 9735.0 | -86 |
| 9736.0 | -85 |
| 9737.0 | -86 |
| 9738.0 | -87 |
| 9739.0 | -88 |
| 9740.0 | -87 |
| 9741.0 | -86 |
| 9742.0 | -87 |
| 9743.0 | -86 |
| 9744.0 | -87 |
| 9745.0 | -86 |
| 9746.0 | -87 |
| 9747.0 | -86 |
| 9748.0 | -85 |
| 9749.0 | -84 |
| 9750.0 | -85 |
| 9751.0 | -84 |
| 9752.0 | -83 |
| 9753.0 | -82 |
| 9754.0 | -81 |
| 9755.0 | -80 |
| 9756.0 | -81 |
| 9757.0 | -82 |
| 9758.0 | -81 |
| 9759.0 | -82 |
| 9760.0 | -83 |
| 9761.0 | -84 |
| 9762.0 | -85 |
| 9763.0 | -84 |
| 9764.0 | -85 |
| 9765.0 | -84 |
| 9766.0 | -85 |
| 9767.0 | -86 |
| 9768.0 | -87 |
| 9769.0 | -88 |
| 9770.0 | -89 |
| 9771.0 | -90 |
| 9772.0 | -89 |
| 9773.0 | -90 |
| 9774.0 | -91 |
| 9775.0 | -90 |
| 9776.0 | -89 |
| 9777.0 | -90 |
| 9778.0 | -91 |
| 9779.0 | -90 |
| 9780.0 | -89 |
| 9781.0 | -90 |
| 9782.0 | -91 |
| 9783.0 | -90 |
| 9784.0 | -89 |
| 9785.0 | -88 |
| 9786.0 | -87 |
| 9787.0 | -88 |
| 9788.0 | -87 |
| 9789.0 | -86 |
| 9790.0 | -85 |
| 9791.0 | -84 |
| 9792.0 | -83 |
| 9793.0 | -84 |
| 9794.0 | -85 |
| 9795.0 | -86 |
| 9796.0 | -85 |
| 9797.0 | -84 |
| 9798.0 | -83 |
| 9799.0 | -82 |
| 9800.0 | -81 |
| 9801.0 | -82 |
| 9802.0 | -81 |
| 9803.0 | -82 |
| 9804.0 | -83 |
| 9805.0 | -84 |
| 9806.0 | -85 |
| 9807.0 | -84 |
| 9808.0 | -85 |
| 9809.0 | -84 |
| 9810.0 | -85 |
| 9811.0 | -84 |
| 9812.0 | -83 |
| 9813.0 | -84 |
| 9814.0 | -83 |
| 9815.0 | -84 |
| 9816.0 | -85 |
| 9817.0 | -86 |
| 9818.0 | -85 |
| 9819.0 | -84 |
| 9820.0 | -85 |
| 9821.0 | -86 |
| 9822.0 | -85 |
| 9823.0 | -86 |
| 9824.0 | -87 |
| 9825.0 | -88 |
| 9826.0 | -87 |
| 9827.0 | -86 |
| 9828.0 | -85 |
| 9829.0 | -86 |
| 9830.0 | -87 |
| 9831.0 | -86 |
| 9832.0 | -87 |
| 9833.0 | -86 |
| 9834.0 | -87 |
| 9835.0 | -88 |
| 9836.0 | -89 |
| 9837.0 | -90 |
| 9838.0 | -91 |
| 9839.0 | -90 |
| 9840.0 | -91 |
| 9841.0 | -92 |
| 9842.0 | -93 |
| 9843.0 | -94 |
| 9844.0 | -93 |
| 9845.0 | -94 |
| 9846.0 | -93 |
| 9847.0 | -92 |
| 9848.0 | -93 |
| 9849.0 | -94 |
| 9850.0 | -95 |
| 9851.0 | -96 |
| 9852.0 | -95 |
| 9853.0 | -96 |
| 9854.0 | -97 |
| 9855.0 | -96 |
| 9856.0 | -97 |
| 9857.0 | -96 |
| 9858.0 | -95 |
| 9859.0 | -96 |
| 9860.0 | -97 |
| 9861.0 | -98 |
| 9862.0 | -97 |
| 9863.0 | -96 |
| 9864.0 | -97 |
| 9865.0 | -98 |
| 9866.0 | -97 |
| 9867.0 | -96 |
| 9868.0 | -97 |
| 9869.0 | -96 |
| 9870.0 | -95 |
| 9871.0 | -94 |
| 9872.0 | -95 |
| 9873.0 | -94 |
| 9874.0 | -93 |
| 9875.0 | -92 |
| 9876.0 | -93 |
| 9877.0 | -92 |
| 9878.0 | -91 |
| 9879.0 | -90 |
| 9880.0 | -89 |
| 9881.0 | -88 |
| 9882.0 | -89 |
| 9883.0 | -90 |
| 9884.0 | -89 |
| 9885.0 | -90 |
| 9886.0 | -91 |
| 9887.0 | -90 |
| 9888.0 | -91 |
| 9889.0 | -92 |
| 9890.0 | -91 |
| 9891.0 | -92 |
| 9892.0 | -93 |
| 9893.0 | -92 |
| 9894.0 | -91 |
| 9895.0 | -92 |
| 9896.0 | -93 |
| 9897.0 | -94 |
| 9898.0 | -93 |
| 9899.0 | -94 |
| 9900.0 | -93 |
| 9901.0 | -94 |
| 9902.0 | -95 |
| 9903.0 | -96 |
| 9904.0 | -95 |
| 9905.0 | -96 |
| 9906.0 | -97 |
| 9907.0 | -98 |
| 9908.0 | -97 |
| 9909.0 | -96 |
| 9910.0 | -95 |
| 9911.0 | -94 |
| 9912.0 | -93 |
| 9913.0 | -92 |
| 9914.0 | -91 |
| 9915.0 | -92 |
| 9916.0 | -93 |
| 9917.0 | -92 |
| 9918.0 | -91 |
| 9919.0 | -90 |
| 9920.0 | -89 |
| 9921.0 | -88 |
| 9922.0 | -89 |
| 9923.0 | -88 |
| 9924.0 | -89 |
| 9925.0 | -88 |
| 9926.0 | -89 |
| 9927.0 | -88 |
| 9928.0 | -87 |
| 9929.0 | -86 |
| 9930.0 | -87 |
| 9931.0 | -86 |
| 9932.0 | -87 |
| 9933.0 | -88 |
| 9934.0 | -87 |
| 9935.0 | -86 |
| 9936.0 | -85 |
| 9937.0 | -86 |
| 9938.0 | -87 |
| 9939.0 | -86 |
| 9940.0 | -85 |
| 9941.0 | -86 |
| 9942.0 | -85 |
| 9943.0 | -86 |
| 9944.0 | -87 |
| 9945.0 | -86 |
| 9946.0 | -87 |
| 9947.0 | -88 |
| 9948.0 | -87 |
| 9949.0 | -88 |
| 9950.0 | -89 |
| 9951.0 | -88 |
| 9952.0 | -89 |
| 9953.0 | -88 |
| 9954.0 | -87 |
| 9955.0 | -88 |
| 9956.0 | -87 |
| 9957.0 | -86 |
| 9958.0 | -87 |
| 9959.0 | -86 |
| 9960.0 | -85 |
| 9961.0 | -84 |
| 9962.0 | -85 |
| 9963.0 | -86 |
| 9964.0 | -85 |
| 9965.0 | -86 |
| 9966.0 | -87 |
| 9967.0 | -86 |
| 9968.0 | -85 |
| 9969.0 | -84 |
| 9970.0 | -85 |
| 9971.0 | -86 |
| 9972.0 | -87 |
| 9973.0 | -88 |
| 9974.0 | -87 |
| 9975.0 | -86 |
| 9976.0 | -87 |
| 9977.0 | -88 |
| 9978.0 | -87 |
| 9979.0 | -88 |
| 9980.0 | -87 |
| 9981.0 | -86 |
| 9982.0 | -85 |
| 9983.0 | -84 |
| 9984.0 | -83 |
| 9985.0 | -84 |
| 9986.0 | -83 |
| 9987.0 | -82 |
| 9988.0 | -83 |
| 9989.0 | -84 |
| 9990.0 | -85 |
| 9991.0 | -84 |
| 9992.0 | -83 |
| 9993.0 | -82 |
| 9994.0 | -83 |
| 9995.0 | -82 |
| 9996.0 | -81 |
| 9997.0 | -80 |
| 9998.0 | -79 |
| 9999.0 | -80 |
| 10000.0 | -81 |